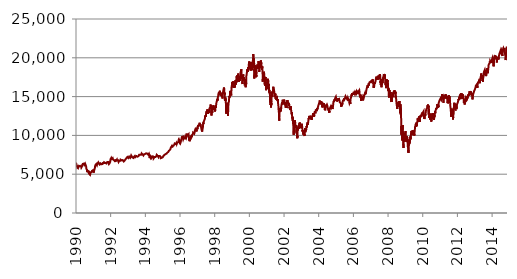
| Category | Series 0 |
|---|---|
| 1990-01-02 | 6481.917 |
| 1990-01-03 | 6478.946 |
| 1990-01-04 | 6435.973 |
| 1990-01-05 | 6386.667 |
| 1990-01-08 | 6402.94 |
| 1990-01-09 | 6342.966 |
| 1990-01-10 | 6295.359 |
| 1990-01-11 | 6310.886 |
| 1990-01-12 | 6166.74 |
| 1990-01-15 | 6113.155 |
| 1990-01-16 | 6160.519 |
| 1990-01-17 | 6118.686 |
| 1990-01-18 | 6121.993 |
| 1990-01-19 | 6139.929 |
| 1990-01-22 | 6001.557 |
| 1990-01-23 | 6007.873 |
| 1990-01-24 | 5960.491 |
| 1990-01-25 | 5909.802 |
| 1990-01-25 | 5889.754 |
| 1990-01-29 | 5867.016 |
| 1990-01-30 | 5816.233 |
| 1990-01-31 | 5910.231 |
| 1990-02-01 | 5888.292 |
| 1990-02-02 | 5931.733 |
| 1990-02-05 | 5954.252 |
| 1990-02-06 | 5926.023 |
| 1990-02-07 | 5984.862 |
| 1990-02-08 | 5982.351 |
| 1990-02-09 | 5995.406 |
| 1990-02-12 | 5939.376 |
| 1990-02-13 | 5947.316 |
| 1990-02-14 | 5958.92 |
| 1990-02-15 | 6007.233 |
| 1990-02-16 | 5979.934 |
| 1990-02-20 | 5903.671 |
| 1990-02-21 | 5889.91 |
| 1990-02-22 | 5870.179 |
| 1990-02-23 | 5836.743 |
| 1990-02-26 | 5890.021 |
| 1990-02-27 | 5919.031 |
| 1990-02-28 | 5953.007 |
| 1990-03-01 | 5938.716 |
| 1990-03-02 | 5988.024 |
| 1990-03-05 | 5964.924 |
| 1990-03-06 | 6026.605 |
| 1990-03-07 | 6016.617 |
| 1990-03-08 | 6068.422 |
| 1990-03-09 | 6038.201 |
| 1990-03-12 | 6048.207 |
| 1990-03-13 | 6010.255 |
| 1990-03-14 | 6023.83 |
| 1990-03-15 | 6042.621 |
| 1990-03-16 | 6096.59 |
| 1990-03-19 | 6118.173 |
| 1990-03-20 | 6089.414 |
| 1990-03-21 | 6062.559 |
| 1990-03-22 | 5995.625 |
| 1990-03-23 | 6017.302 |
| 1990-03-26 | 6025.236 |
| 1990-03-27 | 6077.558 |
| 1990-03-28 | 6079.648 |
| 1990-03-29 | 6062.319 |
| 1990-03-30 | 6054.273 |
| 1990-04-02 | 6017.161 |
| 1990-04-03 | 6094.683 |
| 1990-04-04 | 6057.4 |
| 1990-04-05 | 6049.33 |
| 1990-04-06 | 6034.871 |
| 1990-04-09 | 6048.48 |
| 1990-04-10 | 6057.547 |
| 1990-04-11 | 6057.621 |
| 1990-04-12 | 6096.677 |
| 1990-04-16 | 6102.07 |
| 1990-04-17 | 6100.795 |
| 1990-04-18 | 6039.746 |
| 1990-04-19 | 5995.907 |
| 1990-04-20 | 5943.425 |
| 1990-04-23 | 5870.76 |
| 1990-04-24 | 5858.222 |
| 1990-04-25 | 5883.705 |
| 1990-04-26 | 5895.136 |
| 1990-04-27 | 5837.816 |
| 1990-04-30 | 5858.129 |
| 1990-05-01 | 5868.68 |
| 1990-05-02 | 5904.514 |
| 1990-05-03 | 5923.637 |
| 1990-05-04 | 5966.693 |
| 1990-05-07 | 6000.463 |
| 1990-05-08 | 6021.079 |
| 1990-05-09 | 6034.049 |
| 1990-05-10 | 6052.233 |
| 1990-05-11 | 6179.171 |
| 1990-05-14 | 6222.318 |
| 1990-05-15 | 6215.483 |
| 1990-05-16 | 6214.857 |
| 1990-05-17 | 6226.353 |
| 1990-05-18 | 6233.943 |
| 1990-05-21 | 6292.106 |
| 1990-05-22 | 6305.076 |
| 1990-05-23 | 6316.978 |
| 1990-05-24 | 6310.124 |
| 1990-05-25 | 6258.078 |
| 1990-05-29 | 6341.315 |
| 1990-05-30 | 6347.174 |
| 1990-05-31 | 6353.291 |
| 1990-06-01 | 6354.768 |
| 1990-06-04 | 6419.801 |
| 1990-06-05 | 6410.583 |
| 1990-06-06 | 6391.27 |
| 1990-06-07 | 6365.176 |
| 1990-06-08 | 6298.641 |
| 1990-06-11 | 6339.211 |
| 1990-06-12 | 6407.139 |
| 1990-06-13 | 6393.689 |
| 1990-06-14 | 6363.142 |
| 1990-06-15 | 6359.111 |
| 1990-06-18 | 6265.071 |
| 1990-06-19 | 6283.285 |
| 1990-06-20 | 6290.285 |
| 1990-06-21 | 6307.528 |
| 1990-06-22 | 6240.095 |
| 1990-06-25 | 6189.686 |
| 1990-06-26 | 6181.989 |
| 1990-06-27 | 6220.397 |
| 1990-06-28 | 6262.158 |
| 1990-06-29 | 6274.875 |
| 1990-07-02 | 6271.295 |
| 1990-07-03 | 6281.664 |
| 1990-07-05 | 6215.53 |
| 1990-07-06 | 6254.703 |
| 1990-07-09 | 6269.324 |
| 1990-07-10 | 6231.046 |
| 1990-07-11 | 6303.66 |
| 1990-07-12 | 6367.348 |
| 1990-07-13 | 6399.182 |
| 1990-07-16 | 6422.31 |
| 1990-07-17 | 6397.32 |
| 1990-07-18 | 6344.494 |
| 1990-07-19 | 6351.138 |
| 1990-07-20 | 6297.234 |
| 1990-07-23 | 6185.21 |
| 1990-07-24 | 6186.689 |
| 1990-07-25 | 6207.461 |
| 1990-07-26 | 6191.453 |
| 1990-07-27 | 6155.055 |
| 1990-07-30 | 6170.205 |
| 1990-07-31 | 6177.781 |
| 1990-08-01 | 6109.583 |
| 1990-08-02 | 6043.509 |
| 1990-08-03 | 5923.155 |
| 1990-08-06 | 5750.474 |
| 1990-08-07 | 5755.177 |
| 1990-08-08 | 5805.243 |
| 1990-08-09 | 5838.578 |
| 1990-08-10 | 5776.683 |
| 1990-08-13 | 5814.45 |
| 1990-08-14 | 5830.837 |
| 1990-08-15 | 5842.865 |
| 1990-08-16 | 5725.261 |
| 1990-08-17 | 5638.025 |
| 1990-08-20 | 5634.498 |
| 1990-08-21 | 5521.27 |
| 1990-08-22 | 5438.538 |
| 1990-08-23 | 5266.544 |
| 1990-08-24 | 5332.672 |
| 1990-08-27 | 5499.891 |
| 1990-08-28 | 5506.8 |
| 1990-08-29 | 5541.637 |
| 1990-08-30 | 5472.126 |
| 1990-08-31 | 5523.187 |
| 1990-09-04 | 5481.099 |
| 1990-09-05 | 5504.794 |
| 1990-09-06 | 5449.493 |
| 1990-09-07 | 5489.637 |
| 1990-09-10 | 5470.713 |
| 1990-09-11 | 5458.175 |
| 1990-09-12 | 5479.664 |
| 1990-09-13 | 5420.093 |
| 1990-09-14 | 5389.51 |
| 1990-09-17 | 5400.739 |
| 1990-09-18 | 5403.304 |
| 1990-09-19 | 5378.245 |
| 1990-09-20 | 5294.028 |
| 1990-09-21 | 5285.329 |
| 1990-09-24 | 5173.488 |
| 1990-09-25 | 5220.502 |
| 1990-09-26 | 5168.555 |
| 1990-09-27 | 5094.904 |
| 1990-09-28 | 5164.824 |
| 1990-10-01 | 5268.33 |
| 1990-10-02 | 5284.288 |
| 1990-10-03 | 5230.263 |
| 1990-10-04 | 5236.967 |
| 1990-10-05 | 5213.753 |
| 1990-10-08 | 5237.966 |
| 1990-10-09 | 5111.943 |
| 1990-10-10 | 5034.703 |
| 1990-10-11 | 4943.039 |
| 1990-10-12 | 5004.392 |
| 1990-10-15 | 5044.242 |
| 1990-10-16 | 4980.161 |
| 1990-10-17 | 4977.023 |
| 1990-10-18 | 5082.88 |
| 1990-10-19 | 5179.448 |
| 1990-10-22 | 5211.221 |
| 1990-10-23 | 5191.625 |
| 1990-10-24 | 5194.657 |
| 1990-10-25 | 5163.704 |
| 1990-10-26 | 5079.617 |
| 1990-10-29 | 5031.761 |
| 1990-10-30 | 5050.287 |
| 1990-10-31 | 5053.015 |
| 1990-11-01 | 5082.478 |
| 1990-11-02 | 5157.961 |
| 1990-11-05 | 5205.496 |
| 1990-11-06 | 5171.944 |
| 1990-11-07 | 5090.91 |
| 1990-11-08 | 5106.619 |
| 1990-11-09 | 5198.576 |
| 1990-11-12 | 5292.205 |
| 1990-11-13 | 5280.41 |
| 1990-11-14 | 5325.953 |
| 1990-11-15 | 5279.698 |
| 1990-11-16 | 5279.77 |
| 1990-11-19 | 5305.601 |
| 1990-11-20 | 5250.202 |
| 1990-11-21 | 5257.23 |
| 1990-11-23 | 5247.996 |
| 1990-11-26 | 5258.546 |
| 1990-11-27 | 5291.582 |
| 1990-11-28 | 5297.168 |
| 1990-11-29 | 5280.73 |
| 1990-11-30 | 5363.739 |
| 1990-12-03 | 5395.458 |
| 1990-12-04 | 5432.301 |
| 1990-12-05 | 5499.281 |
| 1990-12-06 | 5493.268 |
| 1990-12-07 | 5474.784 |
| 1990-12-10 | 5487.718 |
| 1990-12-11 | 5450.412 |
| 1990-12-12 | 5506.184 |
| 1990-12-13 | 5500.864 |
| 1990-12-14 | 5460.214 |
| 1990-12-17 | 5439.987 |
| 1990-12-18 | 5496.862 |
| 1990-12-19 | 5508.158 |
| 1990-12-20 | 5506.806 |
| 1990-12-21 | 5526.162 |
| 1990-12-24 | 5502.661 |
| 1990-12-26 | 5519.224 |
| 1990-12-27 | 5485.743 |
| 1990-12-28 | 5491.204 |
| 1990-12-31 | 5517.338 |
| 1991-01-02 | 5428.345 |
| 1991-01-03 | 5363.178 |
| 1991-01-04 | 5349.19 |
| 1991-01-07 | 5259.283 |
| 1991-01-08 | 5243.579 |
| 1991-01-09 | 5196.68 |
| 1991-01-10 | 5241.085 |
| 1991-01-11 | 5251.431 |
| 1991-01-14 | 5197.617 |
| 1991-01-15 | 5213.091 |
| 1991-01-16 | 5261.086 |
| 1991-01-17 | 5441.608 |
| 1991-01-18 | 5495.51 |
| 1991-01-21 | 5483.025 |
| 1991-01-22 | 5456.357 |
| 1991-01-23 | 5487.976 |
| 1991-01-24 | 5565.168 |
| 1991-01-25 | 5591.659 |
| 1991-01-28 | 5597.265 |
| 1991-01-29 | 5601.174 |
| 1991-01-30 | 5686.394 |
| 1991-01-31 | 5739.182 |
| 1991-02-01 | 5735.805 |
| 1991-02-04 | 5824.414 |
| 1991-02-05 | 5878.359 |
| 1991-02-06 | 5987.804 |
| 1991-02-07 | 5967.55 |
| 1991-02-08 | 6006.292 |
| 1991-02-11 | 6143.937 |
| 1991-02-12 | 6106.661 |
| 1991-02-13 | 6161.507 |
| 1991-02-14 | 6097.108 |
| 1991-02-15 | 6163.061 |
| 1991-02-19 | 6169.594 |
| 1991-02-20 | 6109.345 |
| 1991-02-21 | 6109.645 |
| 1991-02-22 | 6120.858 |
| 1991-02-25 | 6145.932 |
| 1991-02-26 | 6079.096 |
| 1991-02-27 | 6151.583 |
| 1991-02-28 | 6153.578 |
| 1991-03-01 | 6195.753 |
| 1991-03-04 | 6195.541 |
| 1991-03-05 | 6316.285 |
| 1991-03-06 | 6313.27 |
| 1991-03-07 | 6310.784 |
| 1991-03-08 | 6301.227 |
| 1991-03-11 | 6263.319 |
| 1991-03-12 | 6209.629 |
| 1991-03-13 | 6272.593 |
| 1991-03-14 | 6266.475 |
| 1991-03-15 | 6256.125 |
| 1991-03-18 | 6232.762 |
| 1991-03-19 | 6160.683 |
| 1991-03-20 | 6181.118 |
| 1991-03-21 | 6165.884 |
| 1991-03-22 | 6175.494 |
| 1991-03-25 | 6214.496 |
| 1991-03-26 | 6314.962 |
| 1991-03-27 | 6314.804 |
| 1991-03-28 | 6318.7 |
| 1991-04-01 | 6253.912 |
| 1991-04-02 | 6376.326 |
| 1991-04-03 | 6383.72 |
| 1991-04-04 | 6399.02 |
| 1991-04-05 | 6346.061 |
| 1991-04-08 | 6386.995 |
| 1991-04-09 | 6314.582 |
| 1991-04-10 | 6304.424 |
| 1991-04-11 | 6377.822 |
| 1991-04-12 | 6421.027 |
| 1991-04-15 | 6430.182 |
| 1991-04-16 | 6520.394 |
| 1991-04-17 | 6569.585 |
| 1991-04-18 | 6541.979 |
| 1991-04-19 | 6478.158 |
| 1991-04-22 | 6417.541 |
| 1991-04-23 | 6426.291 |
| 1991-04-24 | 6440.71 |
| 1991-04-25 | 6395.041 |
| 1991-04-26 | 6385.252 |
| 1991-04-29 | 6303.578 |
| 1991-04-30 | 6316.836 |
| 1991-05-01 | 6370.015 |
| 1991-05-02 | 6383.338 |
| 1991-05-03 | 6389.324 |
| 1991-05-06 | 6376.826 |
| 1991-05-07 | 6338.997 |
| 1991-05-08 | 6353.76 |
| 1991-05-09 | 6424.011 |
| 1991-05-10 | 6322.391 |
| 1991-05-13 | 6333.398 |
| 1991-05-14 | 6254.423 |
| 1991-05-15 | 6196.46 |
| 1991-05-16 | 6247.506 |
| 1991-05-17 | 6250.473 |
| 1991-05-20 | 6242.644 |
| 1991-05-21 | 6289.39 |
| 1991-05-22 | 6305.627 |
| 1991-05-23 | 6296.411 |
| 1991-05-24 | 6335.539 |
| 1991-05-28 | 6402.191 |
| 1991-05-29 | 6420.026 |
| 1991-05-30 | 6483.185 |
| 1991-05-31 | 6528.825 |
| 1991-06-03 | 6492.05 |
| 1991-06-04 | 6490.125 |
| 1991-06-05 | 6456.661 |
| 1991-06-06 | 6435.116 |
| 1991-06-07 | 6372.405 |
| 1991-06-10 | 6357.475 |
| 1991-06-11 | 6386.564 |
| 1991-06-12 | 6317.903 |
| 1991-06-13 | 6328.754 |
| 1991-06-14 | 6395.053 |
| 1991-06-17 | 6370.217 |
| 1991-06-18 | 6348.287 |
| 1991-06-19 | 6289.094 |
| 1991-06-20 | 6289.952 |
| 1991-06-21 | 6315.487 |
| 1991-06-24 | 6209.406 |
| 1991-06-25 | 6193.847 |
| 1991-06-26 | 6201.548 |
| 1991-06-27 | 6243.623 |
| 1991-06-28 | 6205.381 |
| 1991-07-01 | 6289.261 |
| 1991-07-02 | 6284.508 |
| 1991-07-03 | 6227.237 |
| 1991-07-05 | 6238.195 |
| 1991-07-08 | 6291.673 |
| 1991-07-09 | 6275.105 |
| 1991-07-10 | 6280.75 |
| 1991-07-11 | 6300.936 |
| 1991-07-12 | 6353.802 |
| 1991-07-15 | 6391.115 |
| 1991-07-16 | 6381.258 |
| 1991-07-17 | 6379.598 |
| 1991-07-18 | 6437.777 |
| 1991-07-19 | 6425.841 |
| 1991-07-22 | 6402.282 |
| 1991-07-23 | 6346.724 |
| 1991-07-24 | 6326.609 |
| 1991-07-25 | 6359.692 |
| 1991-07-26 | 6362.68 |
| 1991-07-29 | 6395.204 |
| 1991-07-30 | 6451.392 |
| 1991-07-31 | 6476.628 |
| 1991-08-01 | 6452.627 |
| 1991-08-02 | 6457.436 |
| 1991-08-05 | 6425.722 |
| 1991-08-06 | 6498.508 |
| 1991-08-07 | 6503.509 |
| 1991-08-08 | 6493.28 |
| 1991-08-09 | 6464.964 |
| 1991-08-12 | 6478.503 |
| 1991-08-13 | 6507.168 |
| 1991-08-14 | 6520.133 |
| 1991-08-15 | 6512.971 |
| 1991-08-16 | 6462.611 |
| 1991-08-19 | 6310.383 |
| 1991-08-20 | 6354.051 |
| 1991-08-21 | 6526.249 |
| 1991-08-22 | 6539.945 |
| 1991-08-23 | 6582.899 |
| 1991-08-26 | 6579.867 |
| 1991-08-27 | 6570.109 |
| 1991-08-28 | 6627.491 |
| 1991-08-29 | 6626.079 |
| 1991-08-30 | 6613.01 |
| 1991-09-03 | 6536.727 |
| 1991-09-04 | 6499.391 |
| 1991-09-05 | 6484.939 |
| 1991-09-06 | 6485.165 |
| 1991-09-09 | 6473.992 |
| 1991-09-10 | 6402.895 |
| 1991-09-11 | 6410.095 |
| 1991-09-12 | 6454.787 |
| 1991-09-13 | 6402.843 |
| 1991-09-16 | 6425.761 |
| 1991-09-17 | 6422.361 |
| 1991-09-18 | 6446.702 |
| 1991-09-19 | 6466.185 |
| 1991-09-20 | 6482.372 |
| 1991-09-23 | 6455.81 |
| 1991-09-24 | 6482.701 |
| 1991-09-25 | 6477.531 |
| 1991-09-26 | 6471.702 |
| 1991-09-27 | 6464.034 |
| 1991-09-30 | 6495.505 |
| 1991-10-01 | 6506.337 |
| 1991-10-02 | 6491.767 |
| 1991-10-03 | 6430.908 |
| 1991-10-04 | 6389.348 |
| 1991-10-07 | 6354.215 |
| 1991-10-08 | 6370.205 |
| 1991-10-09 | 6315.583 |
| 1991-10-10 | 6359.308 |
| 1991-10-11 | 6379.127 |
| 1991-10-14 | 6454.694 |
| 1991-10-15 | 6530.538 |
| 1991-10-16 | 6578.11 |
| 1991-10-17 | 6567.802 |
| 1991-10-18 | 6578.889 |
| 1991-10-21 | 6540.222 |
| 1991-10-22 | 6511.846 |
| 1991-10-23 | 6508.138 |
| 1991-10-24 | 6459.614 |
| 1991-10-25 | 6439.934 |
| 1991-10-28 | 6515.501 |
| 1991-10-29 | 6552.557 |
| 1991-10-30 | 6588.365 |
| 1991-10-31 | 6595.364 |
| 1991-11-01 | 6562.712 |
| 1991-11-04 | 6538.908 |
| 1991-11-05 | 6518.266 |
| 1991-11-06 | 6535.955 |
| 1991-11-07 | 6592.336 |
| 1991-11-08 | 6592.077 |
| 1991-11-11 | 6604.099 |
| 1991-11-12 | 6660.791 |
| 1991-11-13 | 6671.881 |
| 1991-11-14 | 6664.574 |
| 1991-11-15 | 6435.543 |
| 1991-11-18 | 6465.478 |
| 1991-11-19 | 6364.894 |
| 1991-11-20 | 6354.633 |
| 1991-11-21 | 6380.578 |
| 1991-11-22 | 6320.708 |
| 1991-11-25 | 6297.233 |
| 1991-11-26 | 6327.427 |
| 1991-11-27 | 6314.8 |
| 1991-11-29 | 6304.868 |
| 1991-12-02 | 6385.1 |
| 1991-12-03 | 6387.033 |
| 1991-12-04 | 6381.854 |
| 1991-12-05 | 6348.368 |
| 1991-12-06 | 6371.394 |
| 1991-12-09 | 6355.583 |
| 1991-12-10 | 6344.847 |
| 1991-12-11 | 6334.611 |
| 1991-12-12 | 6390.019 |
| 1991-12-13 | 6438.057 |
| 1991-12-16 | 6446.825 |
| 1991-12-17 | 6418.966 |
| 1991-12-18 | 6421.106 |
| 1991-12-19 | 6400.462 |
| 1991-12-20 | 6456.198 |
| 1991-12-23 | 6602.331 |
| 1991-12-24 | 6654.563 |
| 1991-12-26 | 6748.584 |
| 1991-12-27 | 6791.15 |
| 1991-12-30 | 6930.12 |
| 1991-12-31 | 6975.396 |
| 1992-01-02 | 6958.451 |
| 1992-01-03 | 6999.542 |
| 1992-01-06 | 6990.838 |
| 1992-01-07 | 6996.836 |
| 1992-01-08 | 7023.604 |
| 1992-01-09 | 7041.098 |
| 1992-01-10 | 7001.817 |
| 1992-01-13 | 6993.889 |
| 1992-01-14 | 7088.722 |
| 1992-01-15 | 7103.493 |
| 1992-01-16 | 7066.677 |
| 1992-01-17 | 7080.397 |
| 1992-01-20 | 7033.98 |
| 1992-01-21 | 6948.471 |
| 1992-01-22 | 7041.667 |
| 1992-01-23 | 7016.968 |
| 1992-01-24 | 7027.758 |
| 1992-01-27 | 7016.399 |
| 1992-01-28 | 7016.726 |
| 1992-01-29 | 6946.541 |
| 1992-01-30 | 6970.913 |
| 1992-01-31 | 6942.318 |
| 1992-02-03 | 6929.398 |
| 1992-02-04 | 6999.228 |
| 1992-02-05 | 7008.914 |
| 1992-02-06 | 7017.398 |
| 1992-02-07 | 6977.434 |
| 1992-02-10 | 7008.296 |
| 1992-02-11 | 7006.166 |
| 1992-02-12 | 7067.425 |
| 1992-02-13 | 7011.559 |
| 1992-02-14 | 6994.093 |
| 1992-02-18 | 6914.921 |
| 1992-02-19 | 6912.654 |
| 1992-02-20 | 7001.46 |
| 1992-02-21 | 6967.988 |
| 1992-02-24 | 6963.557 |
| 1992-02-25 | 6931.648 |
| 1992-02-26 | 7015.079 |
| 1992-02-27 | 7004.534 |
| 1992-02-28 | 6991.946 |
| 1992-03-02 | 6958.092 |
| 1992-03-03 | 6963.663 |
| 1992-03-04 | 6910.007 |
| 1992-03-05 | 6853.345 |
| 1992-03-06 | 6813.599 |
| 1992-03-09 | 6821.152 |
| 1992-03-10 | 6854.08 |
| 1992-03-11 | 6808.661 |
| 1992-03-12 | 6797.229 |
| 1992-03-13 | 6827.594 |
| 1992-03-16 | 6829.354 |
| 1992-03-17 | 6878.19 |
| 1992-03-18 | 6877.695 |
| 1992-03-19 | 6888.152 |
| 1992-03-20 | 6907.308 |
| 1992-03-23 | 6885.35 |
| 1992-03-24 | 6864.999 |
| 1992-03-25 | 6853.738 |
| 1992-03-26 | 6849.791 |
| 1992-03-27 | 6773.443 |
| 1992-03-30 | 6761.328 |
| 1992-03-31 | 6769.359 |
| 1992-04-01 | 6761.548 |
| 1992-04-02 | 6699.916 |
| 1992-04-03 | 6699.438 |
| 1992-04-06 | 6757.214 |
| 1992-04-07 | 6636.134 |
| 1992-04-08 | 6567.779 |
| 1992-04-09 | 6667.12 |
| 1992-04-10 | 6725.306 |
| 1992-04-13 | 6752.197 |
| 1992-04-14 | 6843.314 |
| 1992-04-15 | 6900.749 |
| 1992-04-16 | 6882.15 |
| 1992-04-20 | 6777.604 |
| 1992-04-21 | 6773.475 |
| 1992-04-22 | 6766.872 |
| 1992-04-23 | 6785.436 |
| 1992-04-24 | 6752.607 |
| 1992-04-27 | 6738.24 |
| 1992-04-28 | 6729.657 |
| 1992-04-29 | 6781.273 |
| 1992-04-30 | 6840.124 |
| 1992-05-01 | 6803.154 |
| 1992-05-04 | 6868.907 |
| 1992-05-05 | 6878.397 |
| 1992-05-06 | 6885.519 |
| 1992-05-07 | 6871.514 |
| 1992-05-08 | 6871.275 |
| 1992-05-11 | 6904.381 |
| 1992-05-12 | 6871.786 |
| 1992-05-13 | 6869.588 |
| 1992-05-14 | 6815.763 |
| 1992-05-15 | 6775.296 |
| 1992-05-18 | 6812.185 |
| 1992-05-19 | 6859.518 |
| 1992-05-20 | 6854.117 |
| 1992-05-21 | 6817.007 |
| 1992-05-22 | 6835.221 |
| 1992-05-26 | 6792.42 |
| 1992-05-27 | 6801.28 |
| 1992-05-28 | 6854.185 |
| 1992-05-29 | 6852.141 |
| 1992-06-01 | 6861.778 |
| 1992-06-02 | 6817.772 |
| 1992-06-03 | 6832.508 |
| 1992-06-04 | 6810.199 |
| 1992-06-05 | 6804.8 |
| 1992-06-08 | 6794.223 |
| 1992-06-09 | 6736.124 |
| 1992-06-10 | 6688.111 |
| 1992-06-11 | 6701.388 |
| 1992-06-12 | 6714.8 |
| 1992-06-15 | 6717.924 |
| 1992-06-16 | 6685.904 |
| 1992-06-17 | 6583.815 |
| 1992-06-18 | 6554.426 |
| 1992-06-19 | 6595.937 |
| 1992-06-22 | 6578.841 |
| 1992-06-23 | 6596.481 |
| 1992-06-24 | 6590.623 |
| 1992-06-25 | 6576.107 |
| 1992-06-26 | 6579.995 |
| 1992-06-29 | 6666.583 |
| 1992-06-30 | 6672.899 |
| 1992-07-01 | 6730.009 |
| 1992-07-02 | 6716.862 |
| 1992-07-06 | 6741.682 |
| 1992-07-07 | 6673.203 |
| 1992-07-08 | 6679.76 |
| 1992-07-09 | 6744.274 |
| 1992-07-10 | 6758.606 |
| 1992-07-13 | 6766.891 |
| 1992-07-14 | 6815.7 |
| 1992-07-15 | 6806.585 |
| 1992-07-16 | 6815.598 |
| 1992-07-17 | 6779.851 |
| 1992-07-20 | 6743.393 |
| 1992-07-21 | 6750.39 |
| 1992-07-22 | 6710.39 |
| 1992-07-23 | 6725.485 |
| 1992-07-24 | 6721.843 |
| 1992-07-27 | 6722.148 |
| 1992-07-28 | 6812.142 |
| 1992-07-29 | 6881.942 |
| 1992-07-30 | 6909.1 |
| 1992-07-31 | 6918.739 |
| 1992-08-03 | 6916.988 |
| 1992-08-04 | 6908.389 |
| 1992-08-05 | 6872.22 |
| 1992-08-06 | 6847.522 |
| 1992-08-07 | 6827.79 |
| 1992-08-10 | 6828.347 |
| 1992-08-11 | 6817.468 |
| 1992-08-12 | 6800.203 |
| 1992-08-13 | 6799.493 |
| 1992-08-14 | 6828.753 |
| 1992-08-17 | 6842.842 |
| 1992-08-18 | 6848.586 |
| 1992-08-19 | 6804.798 |
| 1992-08-20 | 6803.683 |
| 1992-08-21 | 6751.448 |
| 1992-08-24 | 6680.9 |
| 1992-08-25 | 6677.352 |
| 1992-08-26 | 6711.376 |
| 1992-08-27 | 6723.81 |
| 1992-08-28 | 6743.66 |
| 1992-08-31 | 6732.105 |
| 1992-09-01 | 6741.82 |
| 1992-09-02 | 6774.467 |
| 1992-09-03 | 6784.625 |
| 1992-09-04 | 6773.675 |
| 1992-09-08 | 6733.178 |
| 1992-09-09 | 6755.802 |
| 1992-09-10 | 6809.455 |
| 1992-09-11 | 6816.985 |
| 1992-09-14 | 6906.656 |
| 1992-09-15 | 6831.86 |
| 1992-09-16 | 6832.551 |
| 1992-09-17 | 6829.418 |
| 1992-09-18 | 6868.972 |
| 1992-09-21 | 6854.316 |
| 1992-09-22 | 6786.697 |
| 1992-09-23 | 6783.749 |
| 1992-09-24 | 6802.363 |
| 1992-09-25 | 6733.902 |
| 1992-09-28 | 6754.319 |
| 1992-09-29 | 6760.299 |
| 1992-09-30 | 6779.352 |
| 1992-10-01 | 6732.265 |
| 1992-10-02 | 6646.437 |
| 1992-10-05 | 6590.051 |
| 1992-10-06 | 6593.727 |
| 1992-10-07 | 6563.713 |
| 1992-10-08 | 6615.13 |
| 1992-10-09 | 6545.534 |
| 1992-10-12 | 6605.864 |
| 1992-10-13 | 6636.046 |
| 1992-10-14 | 6638.362 |
| 1992-10-15 | 6645.883 |
| 1992-10-16 | 6673.362 |
| 1992-10-19 | 6731.745 |
| 1992-10-20 | 6748.196 |
| 1992-10-21 | 6756.052 |
| 1992-10-22 | 6747.457 |
| 1992-10-23 | 6741.901 |
| 1992-10-26 | 6792.696 |
| 1992-10-27 | 6797.413 |
| 1992-10-28 | 6826.689 |
| 1992-10-29 | 6850.139 |
| 1992-10-30 | 6828.334 |
| 1992-11-02 | 6871.402 |
| 1992-11-03 | 6837.457 |
| 1992-11-04 | 6802.188 |
| 1992-11-05 | 6831.087 |
| 1992-11-06 | 6829.193 |
| 1992-11-09 | 6852.242 |
| 1992-11-10 | 6862.015 |
| 1992-11-11 | 6924.121 |
| 1992-11-12 | 6929.451 |
| 1992-11-13 | 6928.68 |
| 1992-11-16 | 6900.67 |
| 1992-11-17 | 6874.671 |
| 1992-11-18 | 6930.289 |
| 1992-11-19 | 6944.739 |
| 1992-11-20 | 6990.233 |
| 1992-11-23 | 6970.067 |
| 1992-11-24 | 7013.131 |
| 1992-11-25 | 7038.711 |
| 1992-11-27 | 7056.261 |
| 1992-11-30 | 7079.595 |
| 1992-12-01 | 7080.189 |
| 1992-12-02 | 7066.552 |
| 1992-12-03 | 7073.362 |
| 1992-12-04 | 7106.878 |
| 1992-12-07 | 7156.53 |
| 1992-12-08 | 7176.609 |
| 1992-12-09 | 7151.582 |
| 1992-12-10 | 7135.445 |
| 1992-12-11 | 7120.264 |
| 1992-12-14 | 7107.7 |
| 1992-12-15 | 7100.05 |
| 1992-12-16 | 7077.64 |
| 1992-12-17 | 7133.298 |
| 1992-12-18 | 7215.61 |
| 1992-12-21 | 7205.042 |
| 1992-12-22 | 7203.835 |
| 1992-12-23 | 7189.207 |
| 1992-12-24 | 7204.12 |
| 1992-12-28 | 7199.037 |
| 1992-12-29 | 7194.156 |
| 1992-12-30 | 7213.815 |
| 1992-12-31 | 7195.85 |
| 1993-01-04 | 7149.009 |
| 1993-01-05 | 7130.447 |
| 1993-01-06 | 7136.189 |
| 1993-01-07 | 7084.227 |
| 1993-01-08 | 7055.282 |
| 1993-01-11 | 7087.181 |
| 1993-01-12 | 7084.31 |
| 1993-01-13 | 7121.467 |
| 1993-01-14 | 7174.231 |
| 1993-01-15 | 7200.304 |
| 1993-01-18 | 7198.935 |
| 1993-01-19 | 7183.095 |
| 1993-01-20 | 7165.785 |
| 1993-01-21 | 7193.778 |
| 1993-01-22 | 7211.405 |
| 1993-01-25 | 7273.049 |
| 1993-01-25 | 7275.019 |
| 1993-01-27 | 7229.132 |
| 1993-01-28 | 7232.303 |
| 1993-01-29 | 7239.281 |
| 1993-02-01 | 7269.51 |
| 1993-02-02 | 7283.449 |
| 1993-02-03 | 7351.781 |
| 1993-02-04 | 7391.653 |
| 1993-02-05 | 7370.212 |
| 1993-02-08 | 7350.966 |
| 1993-02-09 | 7303.56 |
| 1993-02-10 | 7316.151 |
| 1993-02-11 | 7338.491 |
| 1993-02-12 | 7294.843 |
| 1993-02-16 | 7108.244 |
| 1993-02-17 | 7068.706 |
| 1993-02-18 | 7056.696 |
| 1993-02-19 | 7087.818 |
| 1993-02-22 | 7074.993 |
| 1993-02-23 | 7070.552 |
| 1993-02-24 | 7165.864 |
| 1993-02-25 | 7200.729 |
| 1993-02-26 | 7223.883 |
| 1993-03-01 | 7189.299 |
| 1993-03-02 | 7271.433 |
| 1993-03-03 | 7304.701 |
| 1993-03-04 | 7278.627 |
| 1993-03-05 | 7264.438 |
| 1993-03-08 | 7377.071 |
| 1993-03-09 | 7381.447 |
| 1993-03-10 | 7418.163 |
| 1993-03-11 | 7393.614 |
| 1993-03-12 | 7339.494 |
| 1993-03-15 | 7364.126 |
| 1993-03-16 | 7360.081 |
| 1993-03-17 | 7311.629 |
| 1993-03-18 | 7354.478 |
| 1993-03-19 | 7326.382 |
| 1993-03-22 | 7291.158 |
| 1993-03-23 | 7287.876 |
| 1993-03-24 | 7277.516 |
| 1993-03-25 | 7320.481 |
| 1993-03-26 | 7291.092 |
| 1993-03-29 | 7328.603 |
| 1993-03-30 | 7351.843 |
| 1993-03-31 | 7366.861 |
| 1993-04-01 | 7323.156 |
| 1993-04-02 | 7179.924 |
| 1993-04-05 | 7186.503 |
| 1993-04-06 | 7150.765 |
| 1993-04-07 | 7174.568 |
| 1993-04-08 | 7157.625 |
| 1993-04-12 | 7244.556 |
| 1993-04-13 | 7271.847 |
| 1993-04-14 | 7270.624 |
| 1993-04-15 | 7256.606 |
| 1993-04-16 | 7262.739 |
| 1993-04-19 | 7236.638 |
| 1993-04-20 | 7199.347 |
| 1993-04-21 | 7183.627 |
| 1993-04-22 | 7134.996 |
| 1993-04-23 | 7094.564 |
| 1993-04-26 | 7024.328 |
| 1993-04-27 | 7083.968 |
| 1993-04-28 | 7088.332 |
| 1993-04-29 | 7105.11 |
| 1993-04-30 | 7134.516 |
| 1993-05-03 | 7158.46 |
| 1993-05-04 | 7197.202 |
| 1993-05-05 | 7222.673 |
| 1993-05-06 | 7208.031 |
| 1993-05-07 | 7192.448 |
| 1993-05-10 | 7202.815 |
| 1993-05-11 | 7223.812 |
| 1993-05-12 | 7228.863 |
| 1993-05-13 | 7149.481 |
| 1993-05-14 | 7148.243 |
| 1993-05-17 | 7155.555 |
| 1993-05-18 | 7155.885 |
| 1993-05-19 | 7254.531 |
| 1993-05-20 | 7310.655 |
| 1993-05-21 | 7253.524 |
| 1993-05-24 | 7273.019 |
| 1993-05-25 | 7289.361 |
| 1993-05-26 | 7359.631 |
| 1993-05-27 | 7353.309 |
| 1993-05-28 | 7326.716 |
| 1993-06-01 | 7361.587 |
| 1993-06-02 | 7370.224 |
| 1993-06-03 | 7353.839 |
| 1993-06-04 | 7313.717 |
| 1993-06-07 | 7267.166 |
| 1993-06-08 | 7210.707 |
| 1993-06-09 | 7226.45 |
| 1993-06-10 | 7218.043 |
| 1993-06-11 | 7242.176 |
| 1993-06-14 | 7254.687 |
| 1993-06-15 | 7243.593 |
| 1993-06-16 | 7258.347 |
| 1993-06-17 | 7269.951 |
| 1993-06-18 | 7204.328 |
| 1993-06-21 | 7234.56 |
| 1993-06-22 | 7226.318 |
| 1993-06-23 | 7194.124 |
| 1993-06-24 | 7241.516 |
| 1993-06-25 | 7266.078 |
| 1993-06-28 | 7338.163 |
| 1993-06-29 | 7324.382 |
| 1993-06-30 | 7334.734 |
| 1993-07-01 | 7328.767 |
| 1993-07-02 | 7288.364 |
| 1993-07-06 | 7233.34 |
| 1993-07-07 | 7240.643 |
| 1993-07-08 | 7313.799 |
| 1993-07-09 | 7317.047 |
| 1993-07-12 | 7336.069 |
| 1993-07-13 | 7328.552 |
| 1993-07-14 | 7360.795 |
| 1993-07-15 | 7346.586 |
| 1993-07-16 | 7296.919 |
| 1993-07-19 | 7286.633 |
| 1993-07-20 | 7305.326 |
| 1993-07-21 | 7299.458 |
| 1993-07-22 | 7258.281 |
| 1993-07-23 | 7294.612 |
| 1993-07-26 | 7330.58 |
| 1993-07-27 | 7317.558 |
| 1993-07-28 | 7308.096 |
| 1993-07-29 | 7348.993 |
| 1993-07-30 | 7324.366 |
| 1993-08-02 | 7334.412 |
| 1993-08-03 | 7326.522 |
| 1993-08-04 | 7324.993 |
| 1993-08-05 | 7318.187 |
| 1993-08-06 | 7333.278 |
| 1993-08-09 | 7360.435 |
| 1993-08-10 | 7346.856 |
| 1993-08-11 | 7360.287 |
| 1993-08-12 | 7336.599 |
| 1993-08-13 | 7352.199 |
| 1993-08-16 | 7384.994 |
| 1993-08-17 | 7412.627 |
| 1993-08-18 | 7458.573 |
| 1993-08-19 | 7457.011 |
| 1993-08-20 | 7457.85 |
| 1993-08-23 | 7447.954 |
| 1993-08-24 | 7507.051 |
| 1993-08-25 | 7512.821 |
| 1993-08-26 | 7521.254 |
| 1993-08-27 | 7511.982 |
| 1993-08-30 | 7534.257 |
| 1993-08-31 | 7564.306 |
| 1993-09-01 | 7557.558 |
| 1993-09-02 | 7539.759 |
| 1993-09-03 | 7544.073 |
| 1993-09-07 | 7486.083 |
| 1993-09-08 | 7437.148 |
| 1993-09-09 | 7463.642 |
| 1993-09-10 | 7528.341 |
| 1993-09-13 | 7525.914 |
| 1993-09-14 | 7490.873 |
| 1993-09-15 | 7516.661 |
| 1993-09-16 | 7498.419 |
| 1993-09-17 | 7490.234 |
| 1993-09-20 | 7444.055 |
| 1993-09-21 | 7406.783 |
| 1993-09-22 | 7464.068 |
| 1993-09-23 | 7497.845 |
| 1993-09-24 | 7507.524 |
| 1993-09-27 | 7563.349 |
| 1993-09-28 | 7569.222 |
| 1993-09-29 | 7556.032 |
| 1993-09-30 | 7549.143 |
| 1993-10-01 | 7547.51 |
| 1993-10-04 | 7549.52 |
| 1993-10-05 | 7544.651 |
| 1993-10-06 | 7544.08 |
| 1993-10-07 | 7520.146 |
| 1993-10-08 | 7531.092 |
| 1993-10-11 | 7545.958 |
| 1993-10-12 | 7560.678 |
| 1993-10-13 | 7574.842 |
| 1993-10-14 | 7644.716 |
| 1993-10-15 | 7681.164 |
| 1993-10-18 | 7661.037 |
| 1993-10-19 | 7598.335 |
| 1993-10-20 | 7590.216 |
| 1993-10-21 | 7584.808 |
| 1993-10-22 | 7565.465 |
| 1993-10-25 | 7565.955 |
| 1993-10-26 | 7558.914 |
| 1993-10-27 | 7569.549 |
| 1993-10-28 | 7613.953 |
| 1993-10-29 | 7633.934 |
| 1993-11-01 | 7648.86 |
| 1993-11-02 | 7640.371 |
| 1993-11-03 | 7548.815 |
| 1993-11-04 | 7447.007 |
| 1993-11-05 | 7469.521 |
| 1993-11-08 | 7492.116 |
| 1993-11-09 | 7504.605 |
| 1993-11-10 | 7555.868 |
| 1993-11-11 | 7548.211 |
| 1993-11-12 | 7587.589 |
| 1993-11-15 | 7550.595 |
| 1993-11-16 | 7579.508 |
| 1993-11-17 | 7541.191 |
| 1993-11-18 | 7511.968 |
| 1993-11-19 | 7489.732 |
| 1993-11-22 | 7410.339 |
| 1993-11-23 | 7445.358 |
| 1993-11-24 | 7480.083 |
| 1993-11-26 | 7496.442 |
| 1993-11-29 | 7479.887 |
| 1993-11-30 | 7483.479 |
| 1993-12-01 | 7507.103 |
| 1993-12-02 | 7523.984 |
| 1993-12-03 | 7551.264 |
| 1993-12-06 | 7571.835 |
| 1993-12-07 | 7578.463 |
| 1993-12-08 | 7573.108 |
| 1993-12-09 | 7536.326 |
| 1993-12-10 | 7533.306 |
| 1993-12-13 | 7546.791 |
| 1993-12-14 | 7499.136 |
| 1993-12-15 | 7484.083 |
| 1993-12-16 | 7507.527 |
| 1993-12-17 | 7549.354 |
| 1993-12-20 | 7547.787 |
| 1993-12-21 | 7526.726 |
| 1993-12-22 | 7554.088 |
| 1993-12-23 | 7564.064 |
| 1993-12-27 | 7604.323 |
| 1993-12-28 | 7617.972 |
| 1993-12-29 | 7630.755 |
| 1993-12-30 | 7611.115 |
| 1993-12-31 | 7604.307 |
| 1994-01-03 | 7556.475 |
| 1994-01-04 | 7574.384 |
| 1994-01-05 | 7587.751 |
| 1994-01-06 | 7580.164 |
| 1994-01-07 | 7615.169 |
| 1994-01-10 | 7680.147 |
| 1994-01-11 | 7668.473 |
| 1994-01-12 | 7676.923 |
| 1994-01-13 | 7661.814 |
| 1994-01-14 | 7698.544 |
| 1994-01-17 | 7684.184 |
| 1994-01-18 | 7693.025 |
| 1994-01-19 | 7688.808 |
| 1994-01-20 | 7697.389 |
| 1994-01-21 | 7699.212 |
| 1994-01-24 | 7659.307 |
| 1994-01-25 | 7638.255 |
| 1994-01-25 | 7671.013 |
| 1994-01-27 | 7729.446 |
| 1994-01-28 | 7762.725 |
| 1994-01-31 | 7811.829 |
| 1994-02-01 | 7761.823 |
| 1994-02-02 | 7795.329 |
| 1994-02-03 | 7779.363 |
| 1994-02-04 | 7601.967 |
| 1994-02-07 | 7621.665 |
| 1994-02-08 | 7628.382 |
| 1994-02-09 | 7657.005 |
| 1994-02-10 | 7609.853 |
| 1994-02-11 | 7613.195 |
| 1994-02-14 | 7616.651 |
| 1994-02-15 | 7654.311 |
| 1994-02-16 | 7664.712 |
| 1994-02-17 | 7630.768 |
| 1994-02-18 | 7588.776 |
| 1994-02-22 | 7634.824 |
| 1994-02-23 | 7624.326 |
| 1994-02-24 | 7530.087 |
| 1994-02-25 | 7560.218 |
| 1994-02-28 | 7591.015 |
| 1994-03-01 | 7524.189 |
| 1994-03-02 | 7508.504 |
| 1994-03-03 | 7492.592 |
| 1994-03-04 | 7527.132 |
| 1994-03-07 | 7567.187 |
| 1994-03-08 | 7549.48 |
| 1994-03-09 | 7558.034 |
| 1994-03-10 | 7518.254 |
| 1994-03-11 | 7548.59 |
| 1994-03-14 | 7572.927 |
| 1994-03-15 | 7578.102 |
| 1994-03-16 | 7621.148 |
| 1994-03-17 | 7649.624 |
| 1994-03-18 | 7654.605 |
| 1994-03-21 | 7608.308 |
| 1994-03-22 | 7617.364 |
| 1994-03-23 | 7622.377 |
| 1994-03-24 | 7549.318 |
| 1994-03-25 | 7504.008 |
| 1994-03-28 | 7462.628 |
| 1994-03-29 | 7334.363 |
| 1994-03-30 | 7218.84 |
| 1994-03-31 | 7208.345 |
| 1994-04-04 | 7078.112 |
| 1994-04-05 | 7250.822 |
| 1994-04-06 | 7257.329 |
| 1994-04-07 | 7300.479 |
| 1994-04-08 | 7242.666 |
| 1994-04-11 | 7268.084 |
| 1994-04-12 | 7224.289 |
| 1994-04-13 | 7186.824 |
| 1994-04-14 | 7186.437 |
| 1994-04-15 | 7190.345 |
| 1994-04-18 | 7131.273 |
| 1994-04-19 | 7112.185 |
| 1994-04-20 | 7085.718 |
| 1994-04-21 | 7192.816 |
| 1994-04-22 | 7192.234 |
| 1994-04-25 | 7265.42 |
| 1994-04-26 | 7265.791 |
| 1994-04-28 | 7230.28 |
| 1994-04-29 | 7258.363 |
| 1994-05-02 | 7291.011 |
| 1994-05-03 | 7289.865 |
| 1994-05-04 | 7280.763 |
| 1994-05-05 | 7276.438 |
| 1994-05-06 | 7214.276 |
| 1994-05-09 | 7118.418 |
| 1994-05-10 | 7158.665 |
| 1994-05-11 | 7088.176 |
| 1994-05-12 | 7113.964 |
| 1994-05-13 | 7112.608 |
| 1994-05-16 | 7107.783 |
| 1994-05-17 | 7159.182 |
| 1994-05-18 | 7240.145 |
| 1994-05-19 | 7286.024 |
| 1994-05-20 | 7273.065 |
| 1994-05-23 | 7250.005 |
| 1994-05-24 | 7272.307 |
| 1994-05-25 | 7291.253 |
| 1994-05-26 | 7306.955 |
| 1994-05-27 | 7314.394 |
| 1994-05-31 | 7303.146 |
| 1994-06-01 | 7291.742 |
| 1994-06-02 | 7308.549 |
| 1994-06-03 | 7343.948 |
| 1994-06-06 | 7341.761 |
| 1994-06-07 | 7324.696 |
| 1994-06-08 | 7294.91 |
| 1994-06-09 | 7292.82 |
| 1994-06-10 | 7313.84 |
| 1994-06-13 | 7312.618 |
| 1994-06-14 | 7355.013 |
| 1994-06-15 | 7337.595 |
| 1994-06-16 | 7358.407 |
| 1994-06-17 | 7306.667 |
| 1994-06-20 | 7244.007 |
| 1994-06-21 | 7167.901 |
| 1994-06-22 | 7200.1 |
| 1994-06-23 | 7139.209 |
| 1994-06-24 | 7034.106 |
| 1994-06-27 | 7092.423 |
| 1994-06-28 | 7077.434 |
| 1994-06-29 | 7102.475 |
| 1994-06-30 | 7068.91 |
| 1994-07-01 | 7079 |
| 1994-07-05 | 7077.043 |
| 1994-07-06 | 7071.365 |
| 1994-07-07 | 7106.541 |
| 1994-07-08 | 7121.971 |
| 1994-07-11 | 7107.294 |
| 1994-07-12 | 7106.797 |
| 1994-07-13 | 7133.728 |
| 1994-07-14 | 7209.645 |
| 1994-07-15 | 7216.927 |
| 1994-07-18 | 7228.235 |
| 1994-07-19 | 7208.65 |
| 1994-07-20 | 7168.246 |
| 1994-07-21 | 7181.014 |
| 1994-07-22 | 7188.681 |
| 1994-07-25 | 7198.593 |
| 1994-07-26 | 7184.863 |
| 1994-07-27 | 7170.684 |
| 1994-07-28 | 7186.355 |
| 1994-07-29 | 7249.68 |
| 1994-08-01 | 7261.255 |
| 1994-08-02 | 7264.099 |
| 1994-08-03 | 7277.934 |
| 1994-08-04 | 7241.015 |
| 1994-08-05 | 7219.273 |
| 1994-08-08 | 7234.018 |
| 1994-08-09 | 7233.155 |
| 1994-08-10 | 7267.837 |
| 1994-08-11 | 7248.076 |
| 1994-08-12 | 7289.564 |
| 1994-08-15 | 7287.119 |
| 1994-08-16 | 7334.246 |
| 1994-08-17 | 7347.65 |
| 1994-08-18 | 7322.121 |
| 1994-08-19 | 7328.799 |
| 1994-08-22 | 7317.424 |
| 1994-08-23 | 7352.442 |
| 1994-08-24 | 7413.436 |
| 1994-08-25 | 7403.275 |
| 1994-08-26 | 7479.445 |
| 1994-08-29 | 7493.248 |
| 1994-08-30 | 7518.792 |
| 1994-08-31 | 7517.882 |
| 1994-09-01 | 7461.3 |
| 1994-09-02 | 7434.756 |
| 1994-09-06 | 7439.186 |
| 1994-09-07 | 7436.143 |
| 1994-09-08 | 7469.903 |
| 1994-09-09 | 7406.843 |
| 1994-09-12 | 7376.252 |
| 1994-09-13 | 7393.475 |
| 1994-09-14 | 7414.108 |
| 1994-09-15 | 7500.223 |
| 1994-09-16 | 7459.133 |
| 1994-09-19 | 7457.237 |
| 1994-09-20 | 7350.49 |
| 1994-09-21 | 7308.587 |
| 1994-09-22 | 7303.202 |
| 1994-09-23 | 7279.511 |
| 1994-09-26 | 7289.484 |
| 1994-09-27 | 7300.892 |
| 1994-09-28 | 7345.598 |
| 1994-09-29 | 7317.828 |
| 1994-09-30 | 7338.206 |
| 1994-10-03 | 7314.621 |
| 1994-10-04 | 7208.502 |
| 1994-10-05 | 7177.423 |
| 1994-10-06 | 7167.503 |
| 1994-10-07 | 7206.958 |
| 1994-10-10 | 7260.662 |
| 1994-10-11 | 7352.754 |
| 1994-10-12 | 7357.291 |
| 1994-10-13 | 7383.419 |
| 1994-10-14 | 7395.249 |
| 1994-10-17 | 7393.577 |
| 1994-10-18 | 7373.165 |
| 1994-10-19 | 7411.967 |
| 1994-10-20 | 7367.784 |
| 1994-10-21 | 7340.574 |
| 1994-10-24 | 7280.723 |
| 1994-10-25 | 7276.074 |
| 1994-10-26 | 7296.008 |
| 1994-10-27 | 7343.646 |
| 1994-10-28 | 7450.418 |
| 1994-10-31 | 7442.139 |
| 1994-11-01 | 7378.722 |
| 1994-11-02 | 7357.002 |
| 1994-11-03 | 7373.396 |
| 1994-11-04 | 7307.902 |
| 1994-11-07 | 7301.239 |
| 1994-11-08 | 7333.629 |
| 1994-11-09 | 7330.433 |
| 1994-11-10 | 7310.605 |
| 1994-11-11 | 7283.526 |
| 1994-11-14 | 7331.848 |
| 1994-11-15 | 7325.806 |
| 1994-11-16 | 7330.512 |
| 1994-11-17 | 7293.909 |
| 1994-11-18 | 7263.73 |
| 1994-11-21 | 7209.843 |
| 1994-11-22 | 7081.064 |
| 1994-11-23 | 7067.279 |
| 1994-11-25 | 7111.18 |
| 1994-11-28 | 7133.027 |
| 1994-11-29 | 7154.207 |
| 1994-11-30 | 7140.262 |
| 1994-12-01 | 7067.947 |
| 1994-12-02 | 7118.574 |
| 1994-12-05 | 7119.019 |
| 1994-12-06 | 7108.986 |
| 1994-12-07 | 7075.69 |
| 1994-12-08 | 6976.375 |
| 1994-12-09 | 6982.91 |
| 1994-12-12 | 7010.434 |
| 1994-12-13 | 7023.155 |
| 1994-12-14 | 7097.633 |
| 1994-12-15 | 7124.87 |
| 1994-12-16 | 7161.887 |
| 1994-12-19 | 7147.799 |
| 1994-12-20 | 7142.393 |
| 1994-12-21 | 7184.784 |
| 1994-12-22 | 7186.994 |
| 1994-12-23 | 7198.649 |
| 1994-12-27 | 7230.784 |
| 1994-12-28 | 7211.528 |
| 1994-12-29 | 7221.355 |
| 1994-12-30 | 7219.828 |
| 1995-01-03 | 7172.683 |
| 1995-01-04 | 7190.548 |
| 1995-01-05 | 7191.054 |
| 1995-01-06 | 7201.079 |
| 1995-01-09 | 7208.079 |
| 1995-01-10 | 7220.305 |
| 1995-01-11 | 7222.76 |
| 1995-01-12 | 7222.839 |
| 1995-01-13 | 7284.208 |
| 1995-01-16 | 7338.687 |
| 1995-01-17 | 7361.699 |
| 1995-01-18 | 7356.045 |
| 1995-01-19 | 7310.672 |
| 1995-01-20 | 7278.697 |
| 1995-01-23 | 7275.497 |
| 1995-01-24 | 7288.911 |
| 1995-01-25 | 7303.149 |
| 1995-01-25 | 7310.466 |
| 1995-01-27 | 7331.988 |
| 1995-01-30 | 7302.151 |
| 1995-01-31 | 7334.776 |
| 1995-02-01 | 7310.312 |
| 1995-02-02 | 7349.527 |
| 1995-02-03 | 7437.83 |
| 1995-02-06 | 7478.464 |
| 1995-02-07 | 7478.527 |
| 1995-02-08 | 7486.398 |
| 1995-02-09 | 7480.373 |
| 1995-02-10 | 7503.419 |
| 1995-02-13 | 7498.907 |
| 1995-02-14 | 7509.996 |
| 1995-02-15 | 7541.813 |
| 1995-02-16 | 7543.911 |
| 1995-02-17 | 7499.948 |
| 1995-02-21 | 7501.668 |
| 1995-02-22 | 7530.029 |
| 1995-02-23 | 7564.275 |
| 1995-02-24 | 7578.614 |
| 1995-02-27 | 7516.006 |
| 1995-02-28 | 7577.715 |
| 1995-03-01 | 7529.735 |
| 1995-03-02 | 7523.729 |
| 1995-03-03 | 7527.487 |
| 1995-03-06 | 7522.078 |
| 1995-03-07 | 7467.209 |
| 1995-03-08 | 7481.185 |
| 1995-03-09 | 7484.487 |
| 1995-03-10 | 7570.125 |
| 1995-03-13 | 7577.53 |
| 1995-03-14 | 7617.322 |
| 1995-03-15 | 7608.769 |
| 1995-03-16 | 7651.8 |
| 1995-03-17 | 7647.273 |
| 1995-03-20 | 7654.961 |
| 1995-03-21 | 7642.304 |
| 1995-03-22 | 7641.801 |
| 1995-03-23 | 7648.829 |
| 1995-03-24 | 7721.48 |
| 1995-03-27 | 7755.88 |
| 1995-03-28 | 7767.357 |
| 1995-03-29 | 7757.688 |
| 1995-03-30 | 7755.849 |
| 1995-03-31 | 7735.882 |
| 1995-04-03 | 7721.042 |
| 1995-04-04 | 7754.968 |
| 1995-04-05 | 7763.383 |
| 1995-04-06 | 7765.797 |
| 1995-04-07 | 7768.978 |
| 1995-04-10 | 7782.909 |
| 1995-04-11 | 7775.857 |
| 1995-04-12 | 7798.422 |
| 1995-04-13 | 7830.703 |
| 1995-04-17 | 7793.69 |
| 1995-04-18 | 7770.686 |
| 1995-04-19 | 7744.767 |
| 1995-04-20 | 7757.679 |
| 1995-04-21 | 7804.58 |
| 1995-04-24 | 7857.013 |
| 1995-04-25 | 7848.253 |
| 1995-04-26 | 7859.05 |
| 1995-04-27 | 7875.394 |
| 1995-04-28 | 7891.362 |
| 1995-05-01 | 7868.004 |
| 1995-05-02 | 7873.399 |
| 1995-05-03 | 7944.934 |
| 1995-05-04 | 7941.415 |
| 1995-05-05 | 7935.269 |
| 1995-05-08 | 7984.298 |
| 1995-05-09 | 7985.549 |
| 1995-05-10 | 8003.957 |
| 1995-05-11 | 8013.074 |
| 1995-05-12 | 8038.723 |
| 1995-05-15 | 8072.097 |
| 1995-05-16 | 8087.956 |
| 1995-05-17 | 8073.286 |
| 1995-05-18 | 7970.473 |
| 1995-05-19 | 7961.715 |
| 1995-05-22 | 8021.16 |
| 1995-05-23 | 8089.222 |
| 1995-05-24 | 8092.475 |
| 1995-05-25 | 8086.611 |
| 1995-05-26 | 8021.989 |
| 1995-05-30 | 8007.663 |
| 1995-05-31 | 8121.205 |
| 1995-06-01 | 8120.213 |
| 1995-06-02 | 8120.993 |
| 1995-06-05 | 8171.362 |
| 1995-06-06 | 8170.863 |
| 1995-06-07 | 8144.266 |
| 1995-06-08 | 8139.895 |
| 1995-06-09 | 8080.349 |
| 1995-06-12 | 8122.82 |
| 1995-06-13 | 8194.323 |
| 1995-06-14 | 8203.937 |
| 1995-06-15 | 8223.682 |
| 1995-06-16 | 8261.268 |
| 1995-06-19 | 8332.771 |
| 1995-06-20 | 8336.813 |
| 1995-06-21 | 8332.365 |
| 1995-06-22 | 8429.981 |
| 1995-06-23 | 8412.484 |
| 1995-06-26 | 8328.806 |
| 1995-06-27 | 8301.663 |
| 1995-06-28 | 8324.155 |
| 1995-06-29 | 8324.233 |
| 1995-06-30 | 8348.676 |
| 1995-07-03 | 8377.177 |
| 1995-07-05 | 8391.943 |
| 1995-07-06 | 8484.798 |
| 1995-07-07 | 8540.599 |
| 1995-07-10 | 8554.054 |
| 1995-07-11 | 8524.007 |
| 1995-07-12 | 8618.408 |
| 1995-07-13 | 8624.62 |
| 1995-07-14 | 8613.117 |
| 1995-07-17 | 8651.092 |
| 1995-07-18 | 8585.286 |
| 1995-07-19 | 8445.153 |
| 1995-07-20 | 8489.216 |
| 1995-07-21 | 8504.777 |
| 1995-07-24 | 8558.814 |
| 1995-07-25 | 8630.817 |
| 1995-07-26 | 8646.488 |
| 1995-07-27 | 8709.375 |
| 1995-07-28 | 8685.025 |
| 1995-07-31 | 8681.279 |
| 1995-08-01 | 8618.886 |
| 1995-08-02 | 8603.458 |
| 1995-08-03 | 8594.538 |
| 1995-08-04 | 8603.832 |
| 1995-08-07 | 8625.409 |
| 1995-08-08 | 8629.706 |
| 1995-08-09 | 8629.908 |
| 1995-08-10 | 8605.591 |
| 1995-08-11 | 8578.986 |
| 1995-08-14 | 8638.252 |
| 1995-08-15 | 8630.671 |
| 1995-08-16 | 8668.983 |
| 1995-08-17 | 8671.988 |
| 1995-08-18 | 8680.534 |
| 1995-08-21 | 8665.216 |
| 1995-08-22 | 8678.495 |
| 1995-08-23 | 8657.883 |
| 1995-08-24 | 8654.318 |
| 1995-08-25 | 8687.229 |
| 1995-08-28 | 8666.897 |
| 1995-08-29 | 8663.815 |
| 1995-08-30 | 8694.312 |
| 1995-08-31 | 8721.493 |
| 1995-09-01 | 8735.536 |
| 1995-09-05 | 8816.034 |
| 1995-09-06 | 8847.513 |
| 1995-09-07 | 8856.214 |
| 1995-09-08 | 8897.869 |
| 1995-09-11 | 8925.355 |
| 1995-09-12 | 8957.128 |
| 1995-09-13 | 8978.119 |
| 1995-09-14 | 9038.699 |
| 1995-09-15 | 9019.697 |
| 1995-09-18 | 9011.571 |
| 1995-09-19 | 9041.34 |
| 1995-09-20 | 9078.847 |
| 1995-09-21 | 9035.156 |
| 1995-09-22 | 9000.804 |
| 1995-09-25 | 8985.686 |
| 1995-09-26 | 8972.697 |
| 1995-09-27 | 8945.506 |
| 1995-09-28 | 9023.566 |
| 1995-09-29 | 9021.919 |
| 1995-10-02 | 8939.016 |
| 1995-10-03 | 8926.333 |
| 1995-10-04 | 8888.22 |
| 1995-10-05 | 8910.459 |
| 1995-10-06 | 8916.112 |
| 1995-10-09 | 8822.185 |
| 1995-10-10 | 8796.043 |
| 1995-10-11 | 8853.623 |
| 1995-10-12 | 8919.472 |
| 1995-10-13 | 8959.227 |
| 1995-10-16 | 8940.705 |
| 1995-10-17 | 8993.096 |
| 1995-10-18 | 9013.724 |
| 1995-10-19 | 9043.722 |
| 1995-10-20 | 8995.419 |
| 1995-10-23 | 8952.769 |
| 1995-10-24 | 8972.205 |
| 1995-10-25 | 8902.236 |
| 1995-10-26 | 8809.95 |
| 1995-10-27 | 8851.47 |
| 1995-10-30 | 8908.028 |
| 1995-10-31 | 8890.729 |
| 1995-11-01 | 8929.649 |
| 1995-11-02 | 9023.994 |
| 1995-11-03 | 9053.066 |
| 1995-11-06 | 9034.888 |
| 1995-11-07 | 8988.305 |
| 1995-11-08 | 9055.096 |
| 1995-11-09 | 9090.584 |
| 1995-11-10 | 9086.833 |
| 1995-11-13 | 9072.7 |
| 1995-11-14 | 9016.602 |
| 1995-11-15 | 9061.605 |
| 1995-11-16 | 9113.891 |
| 1995-11-17 | 9155.112 |
| 1995-11-20 | 9101.431 |
| 1995-11-21 | 9123.266 |
| 1995-11-22 | 9103.384 |
| 1995-11-24 | 9131.666 |
| 1995-11-27 | 9149.719 |
| 1995-11-28 | 9222.88 |
| 1995-11-29 | 9257.686 |
| 1995-11-30 | 9251.58 |
| 1995-12-01 | 9274.06 |
| 1995-12-04 | 9371.707 |
| 1995-12-05 | 9417.499 |
| 1995-12-06 | 9433.006 |
| 1995-12-07 | 9373.49 |
| 1995-12-08 | 9392.765 |
| 1995-12-11 | 9418.243 |
| 1995-12-12 | 9394.719 |
| 1995-12-13 | 9435.192 |
| 1995-12-14 | 9357.735 |
| 1995-12-15 | 9337.033 |
| 1995-12-18 | 9173.839 |
| 1995-12-19 | 9259.173 |
| 1995-12-20 | 9215.831 |
| 1995-12-21 | 9286.233 |
| 1995-12-22 | 9308.78 |
| 1995-12-26 | 9346.539 |
| 1995-12-27 | 9351.843 |
| 1995-12-28 | 9349.501 |
| 1995-12-29 | 9392.843 |
| 1996-01-02 | 9398.077 |
| 1996-01-03 | 9397.738 |
| 1996-01-04 | 9317.757 |
| 1996-01-05 | 9306.041 |
| 1996-01-08 | 9325.682 |
| 1996-01-09 | 9183.603 |
| 1996-01-10 | 9018.97 |
| 1996-01-11 | 9101.633 |
| 1996-01-12 | 9091.905 |
| 1996-01-15 | 9048.6 |
| 1996-01-16 | 9135.519 |
| 1996-01-17 | 9129.383 |
| 1996-01-18 | 9163.592 |
| 1996-01-19 | 9222.745 |
| 1996-01-22 | 9255.768 |
| 1996-01-23 | 9253.486 |
| 1996-01-24 | 9355.035 |
| 1996-01-25 | 9317.218 |
| 1996-01-25 | 9381.15 |
| 1996-01-29 | 9413.263 |
| 1996-01-30 | 9499.102 |
| 1996-01-31 | 9576.462 |
| 1996-02-01 | 9589.253 |
| 1996-02-02 | 9566.295 |
| 1996-02-05 | 9629.284 |
| 1996-02-06 | 9697.097 |
| 1996-02-07 | 9731.903 |
| 1996-02-08 | 9811.287 |
| 1996-02-09 | 9820.323 |
| 1996-02-12 | 9874.491 |
| 1996-02-13 | 9853.592 |
| 1996-02-14 | 9812.133 |
| 1996-02-15 | 9779.217 |
| 1996-02-16 | 9747.562 |
| 1996-02-20 | 9643.698 |
| 1996-02-21 | 9746.332 |
| 1996-02-22 | 9910.541 |
| 1996-02-23 | 9901.198 |
| 1996-02-26 | 9806.877 |
| 1996-02-27 | 9764.434 |
| 1996-02-28 | 9745.748 |
| 1996-02-29 | 9692.195 |
| 1996-03-01 | 9674.592 |
| 1996-03-04 | 9748.661 |
| 1996-03-05 | 9816.142 |
| 1996-03-06 | 9786.575 |
| 1996-03-07 | 9803.208 |
| 1996-03-08 | 9518.534 |
| 1996-03-11 | 9616.361 |
| 1996-03-12 | 9567.379 |
| 1996-03-13 | 9598.581 |
| 1996-03-14 | 9641.494 |
| 1996-03-15 | 9655.054 |
| 1996-03-18 | 9806.113 |
| 1996-03-19 | 9794.479 |
| 1996-03-20 | 9767.74 |
| 1996-03-21 | 9758.675 |
| 1996-03-22 | 9776.684 |
| 1996-03-25 | 9755.48 |
| 1996-03-26 | 9781.591 |
| 1996-03-27 | 9744.671 |
| 1996-03-28 | 9752.514 |
| 1996-03-29 | 9732.043 |
| 1996-04-01 | 9796.917 |
| 1996-04-02 | 9821.36 |
| 1996-04-03 | 9831.137 |
| 1996-04-04 | 9840.457 |
| 1996-04-08 | 9674.993 |
| 1996-04-09 | 9666.937 |
| 1996-04-10 | 9560.44 |
| 1996-04-11 | 9503.178 |
| 1996-04-12 | 9574.862 |
| 1996-04-15 | 9657.129 |
| 1996-04-16 | 9705.543 |
| 1996-04-17 | 9663.922 |
| 1996-04-18 | 9705.116 |
| 1996-04-19 | 9735.361 |
| 1996-04-22 | 9785.922 |
| 1996-04-23 | 9849.793 |
| 1996-04-24 | 9847.904 |
| 1996-04-25 | 9890.79 |
| 1996-04-26 | 9910.694 |
| 1996-04-29 | 9920.791 |
| 1996-04-30 | 9921.446 |
| 1996-05-01 | 9924.646 |
| 1996-05-02 | 9772.419 |
| 1996-05-03 | 9760.259 |
| 1996-05-06 | 9747.141 |
| 1996-05-07 | 9707.47 |
| 1996-05-08 | 9766.81 |
| 1996-05-09 | 9785.673 |
| 1996-05-10 | 9889.96 |
| 1996-05-13 | 10023.263 |
| 1996-05-14 | 10093.806 |
| 1996-05-15 | 10094.946 |
| 1996-05-16 | 10095.448 |
| 1996-05-17 | 10155.473 |
| 1996-05-20 | 10213.035 |
| 1996-05-21 | 10203.474 |
| 1996-05-22 | 10270.794 |
| 1996-05-23 | 10241.443 |
| 1996-05-24 | 10273.166 |
| 1996-05-28 | 10178.972 |
| 1996-05-29 | 10116.865 |
| 1996-05-30 | 10166.31 |
| 1996-05-31 | 10149.529 |
| 1996-06-03 | 10122.424 |
| 1996-06-04 | 10182.41 |
| 1996-06-05 | 10254.731 |
| 1996-06-06 | 10184.385 |
| 1996-06-07 | 10168.542 |
| 1996-06-10 | 10156.222 |
| 1996-06-11 | 10142.627 |
| 1996-06-12 | 10133.877 |
| 1996-06-13 | 10107.249 |
| 1996-06-14 | 10069.532 |
| 1996-06-17 | 10050.498 |
| 1996-06-18 | 9978.238 |
| 1996-06-19 | 9958.126 |
| 1996-06-20 | 9932.349 |
| 1996-06-21 | 9987.884 |
| 1996-06-24 | 10021.029 |
| 1996-06-25 | 10005.976 |
| 1996-06-26 | 9919.315 |
| 1996-06-27 | 9974.319 |
| 1996-06-28 | 10044.954 |
| 1996-07-01 | 10107.691 |
| 1996-07-02 | 10082.053 |
| 1996-07-03 | 10050.533 |
| 1996-07-05 | 9852.042 |
| 1996-07-08 | 9762.879 |
| 1996-07-09 | 9794.779 |
| 1996-07-10 | 9777.101 |
| 1996-07-11 | 9604.202 |
| 1996-07-12 | 9595.788 |
| 1996-07-15 | 9340.261 |
| 1996-07-16 | 9288.47 |
| 1996-07-17 | 9425.649 |
| 1996-07-18 | 9575.305 |
| 1996-07-19 | 9506.215 |
| 1996-07-22 | 9414.202 |
| 1996-07-23 | 9295.672 |
| 1996-07-24 | 9247.338 |
| 1996-07-25 | 9345.385 |
| 1996-07-26 | 9430.697 |
| 1996-07-29 | 9361.547 |
| 1996-07-30 | 9405.59 |
| 1996-07-31 | 9471.253 |
| 1996-08-01 | 9596.417 |
| 1996-08-02 | 9778.837 |
| 1996-08-05 | 9749.208 |
| 1996-08-06 | 9783.74 |
| 1996-08-07 | 9821.207 |
| 1996-08-08 | 9805.894 |
| 1996-08-09 | 9796.572 |
| 1996-08-12 | 9820.027 |
| 1996-08-13 | 9758.469 |
| 1996-08-14 | 9790.489 |
| 1996-08-15 | 9809.359 |
| 1996-08-16 | 9840.743 |
| 1996-08-19 | 9854.937 |
| 1996-08-20 | 9842.907 |
| 1996-08-21 | 9830.847 |
| 1996-08-22 | 9914.407 |
| 1996-08-23 | 9880.148 |
| 1996-08-26 | 9844.284 |
| 1996-08-27 | 9889.817 |
| 1996-08-28 | 9887.653 |
| 1996-08-29 | 9797.056 |
| 1996-08-30 | 9736.149 |
| 1996-09-03 | 9721.379 |
| 1996-09-04 | 9736.644 |
| 1996-09-05 | 9645.927 |
| 1996-09-06 | 9729.027 |
| 1996-09-09 | 9828.222 |
| 1996-09-10 | 9838.177 |
| 1996-09-11 | 9877.427 |
| 1996-09-12 | 9935.094 |
| 1996-09-13 | 10062.934 |
| 1996-09-16 | 10110.48 |
| 1996-09-17 | 10109.318 |
| 1996-09-18 | 10087.144 |
| 1996-09-19 | 10109.137 |
| 1996-09-20 | 10161.118 |
| 1996-09-23 | 10142.504 |
| 1996-09-24 | 10141.946 |
| 1996-09-25 | 10159.097 |
| 1996-09-26 | 10180.622 |
| 1996-09-27 | 10188.466 |
| 1996-09-30 | 10205.541 |
| 1996-10-01 | 10184.629 |
| 1996-10-02 | 10255.783 |
| 1996-10-03 | 10242.235 |
| 1996-10-04 | 10353.657 |
| 1996-10-07 | 10371.4 |
| 1996-10-08 | 10328.591 |
| 1996-10-09 | 10274.037 |
| 1996-10-10 | 10249.858 |
| 1996-10-11 | 10324.621 |
| 1996-10-14 | 10370.167 |
| 1996-10-15 | 10362.423 |
| 1996-10-16 | 10369.355 |
| 1996-10-17 | 10398.677 |
| 1996-10-18 | 10441.185 |
| 1996-10-21 | 10416.555 |
| 1996-10-22 | 10345.642 |
| 1996-10-23 | 10346.153 |
| 1996-10-24 | 10291.164 |
| 1996-10-25 | 10276.549 |
| 1996-10-28 | 10213.815 |
| 1996-10-29 | 10244.686 |
| 1996-10-30 | 10237.769 |
| 1996-10-31 | 10302.141 |
| 1996-11-01 | 10268.336 |
| 1996-11-04 | 10297.377 |
| 1996-11-05 | 10386.136 |
| 1996-11-06 | 10526.643 |
| 1996-11-07 | 10574.55 |
| 1996-11-08 | 10610.675 |
| 1996-11-11 | 10629.795 |
| 1996-11-12 | 10607.283 |
| 1996-11-13 | 10630.5 |
| 1996-11-14 | 10687.667 |
| 1996-11-15 | 10698.158 |
| 1996-11-18 | 10683.6 |
| 1996-11-19 | 10736.744 |
| 1996-11-20 | 10768.201 |
| 1996-11-21 | 10740.886 |
| 1996-11-22 | 10821.856 |
| 1996-11-25 | 10925.113 |
| 1996-11-26 | 10915.597 |
| 1996-11-27 | 10910.284 |
| 1996-11-29 | 10944.263 |
| 1996-12-02 | 10949.381 |
| 1996-12-03 | 10881.679 |
| 1996-12-04 | 10835.543 |
| 1996-12-05 | 10834.763 |
| 1996-12-06 | 10758.581 |
| 1996-12-09 | 10901.685 |
| 1996-12-10 | 10881.469 |
| 1996-12-11 | 10772.764 |
| 1996-12-12 | 10643.227 |
| 1996-12-13 | 10614.892 |
| 1996-12-16 | 10503.711 |
| 1996-12-17 | 10548 |
| 1996-12-18 | 10630.711 |
| 1996-12-19 | 10809.684 |
| 1996-12-20 | 10839.926 |
| 1996-12-23 | 10808.288 |
| 1996-12-24 | 10853.958 |
| 1996-12-26 | 10912.386 |
| 1996-12-27 | 10939.31 |
| 1996-12-30 | 10917.308 |
| 1996-12-31 | 10803.381 |
| 1997-01-02 | 10693.891 |
| 1997-01-03 | 10836.739 |
| 1997-01-06 | 10851.94 |
| 1997-01-07 | 10920.327 |
| 1997-01-08 | 10876.176 |
| 1997-01-09 | 10960.407 |
| 1997-01-10 | 11015.449 |
| 1997-01-13 | 11011.44 |
| 1997-01-14 | 11128.241 |
| 1997-01-15 | 11110.811 |
| 1997-01-16 | 11142.499 |
| 1997-01-17 | 11223.558 |
| 1997-01-20 | 11243.112 |
| 1997-01-21 | 11322.002 |
| 1997-01-22 | 11362.726 |
| 1997-01-23 | 11273.932 |
| 1997-01-24 | 11171.763 |
| 1997-01-27 | 11091.137 |
| 1997-01-28 | 11093.546 |
| 1997-01-29 | 11167.065 |
| 1997-01-30 | 11305.784 |
| 1997-01-31 | 11334.21 |
| 1997-02-03 | 11315.063 |
| 1997-02-04 | 11323.833 |
| 1997-02-05 | 11183.221 |
| 1997-02-06 | 11203.385 |
| 1997-02-07 | 11309.336 |
| 1997-02-10 | 11249.426 |
| 1997-02-11 | 11277.002 |
| 1997-02-12 | 11452.11 |
| 1997-02-13 | 11569.544 |
| 1997-02-14 | 11540.417 |
| 1997-02-18 | 11622.013 |
| 1997-02-19 | 11592.99 |
| 1997-02-20 | 11464.936 |
| 1997-02-21 | 11437.658 |
| 1997-02-24 | 11524.817 |
| 1997-02-25 | 11554.884 |
| 1997-02-26 | 11472.408 |
| 1997-02-27 | 11338.672 |
| 1997-02-28 | 11274.288 |
| 1997-03-03 | 11293.857 |
| 1997-03-04 | 11266.915 |
| 1997-03-05 | 11394.083 |
| 1997-03-06 | 11365.504 |
| 1997-03-07 | 11436.08 |
| 1997-03-10 | 11540.1 |
| 1997-03-11 | 11516.46 |
| 1997-03-12 | 11418.481 |
| 1997-03-13 | 11236.744 |
| 1997-03-14 | 11278.102 |
| 1997-03-17 | 11271.765 |
| 1997-03-18 | 11184.333 |
| 1997-03-19 | 11110.945 |
| 1997-03-20 | 11089.046 |
| 1997-03-21 | 11110.201 |
| 1997-03-24 | 11159.845 |
| 1997-03-25 | 11153.716 |
| 1997-03-26 | 11183.574 |
| 1997-03-27 | 10974.479 |
| 1997-03-31 | 10731.523 |
| 1997-04-01 | 10731.335 |
| 1997-04-02 | 10609.868 |
| 1997-04-03 | 10605.321 |
| 1997-04-04 | 10718.765 |
| 1997-04-07 | 10806.474 |
| 1997-04-08 | 10855.15 |
| 1997-04-09 | 10799.951 |
| 1997-04-10 | 10754.677 |
| 1997-04-11 | 10489.961 |
| 1997-04-14 | 10545.769 |
| 1997-04-15 | 10676.478 |
| 1997-04-16 | 10761.899 |
| 1997-04-17 | 10747.887 |
| 1997-04-18 | 10801.244 |
| 1997-04-21 | 10696.418 |
| 1997-04-22 | 10847.037 |
| 1997-04-23 | 10841.985 |
| 1997-04-24 | 10824.17 |
| 1997-04-25 | 10722.554 |
| 1997-04-28 | 10808.316 |
| 1997-04-29 | 11068.679 |
| 1997-04-30 | 11172.435 |
| 1997-05-01 | 11169.17 |
| 1997-05-02 | 11382.223 |
| 1997-05-05 | 11622.484 |
| 1997-05-06 | 11597.15 |
| 1997-05-07 | 11458.464 |
| 1997-05-08 | 11515.601 |
| 1997-05-09 | 11568.678 |
| 1997-05-12 | 11724.447 |
| 1997-05-13 | 11669.942 |
| 1997-05-14 | 11707.616 |
| 1997-05-15 | 11781.479 |
| 1997-05-16 | 11644.949 |
| 1997-05-19 | 11687.56 |
| 1997-05-20 | 11785.924 |
| 1997-05-21 | 11784.497 |
| 1997-05-22 | 11742.897 |
| 1997-05-23 | 11894.592 |
| 1997-05-27 | 11933.664 |
| 1997-05-28 | 11913.518 |
| 1997-05-29 | 11895.558 |
| 1997-05-30 | 11951.357 |
| 1997-06-02 | 11945.295 |
| 1997-06-03 | 11929.14 |
| 1997-06-04 | 11870.352 |
| 1997-06-05 | 11918.716 |
| 1997-06-06 | 12087.401 |
| 1997-06-09 | 12146.916 |
| 1997-06-10 | 12168.492 |
| 1997-06-11 | 12216.559 |
| 1997-06-12 | 12375.563 |
| 1997-06-13 | 12487.985 |
| 1997-06-16 | 12502.716 |
| 1997-06-17 | 12524.366 |
| 1997-06-18 | 12472.008 |
| 1997-06-19 | 12598.21 |
| 1997-06-20 | 12598.73 |
| 1997-06-23 | 12369.282 |
| 1997-06-24 | 12563.612 |
| 1997-06-25 | 12483.932 |
| 1997-06-26 | 12420.333 |
| 1997-06-27 | 12472.884 |
| 1997-06-30 | 12468.592 |
| 1997-07-01 | 12519.14 |
| 1997-07-02 | 12667.565 |
| 1997-07-03 | 12812.653 |
| 1997-07-07 | 12770.415 |
| 1997-07-08 | 12858.776 |
| 1997-07-09 | 12741.555 |
| 1997-07-10 | 12817.013 |
| 1997-07-11 | 12876.958 |
| 1997-07-14 | 12904.246 |
| 1997-07-15 | 12997.027 |
| 1997-07-16 | 13155.58 |
| 1997-07-17 | 13084.838 |
| 1997-07-18 | 12899.323 |
| 1997-07-21 | 12854.074 |
| 1997-07-22 | 13101.449 |
| 1997-07-23 | 13145.273 |
| 1997-07-24 | 13190.996 |
| 1997-07-25 | 13178.019 |
| 1997-07-28 | 13151.665 |
| 1997-07-29 | 13219.396 |
| 1997-07-30 | 13358.448 |
| 1997-07-31 | 13394.145 |
| 1997-08-01 | 13289.442 |
| 1997-08-04 | 13330.121 |
| 1997-08-05 | 13382.642 |
| 1997-08-06 | 13486.084 |
| 1997-08-07 | 13377.549 |
| 1997-08-08 | 13147.719 |
| 1997-08-11 | 13159.946 |
| 1997-08-12 | 13050.109 |
| 1997-08-13 | 13004.027 |
| 1997-08-14 | 13037.363 |
| 1997-08-15 | 12776.936 |
| 1997-08-18 | 12891.244 |
| 1997-08-19 | 13066.185 |
| 1997-08-20 | 13243.494 |
| 1997-08-21 | 13078.634 |
| 1997-08-22 | 13050.02 |
| 1997-08-25 | 13030.554 |
| 1997-08-26 | 12959.13 |
| 1997-08-27 | 12980.95 |
| 1997-08-28 | 12881.178 |
| 1997-08-29 | 12848.907 |
| 1997-09-02 | 13144.45 |
| 1997-09-03 | 13164.133 |
| 1997-09-04 | 13202.348 |
| 1997-09-05 | 13206.763 |
| 1997-09-08 | 13243.516 |
| 1997-09-09 | 13283.784 |
| 1997-09-10 | 13128.635 |
| 1997-09-11 | 13052.294 |
| 1997-09-12 | 13201.137 |
| 1997-09-15 | 13168.962 |
| 1997-09-16 | 13462.13 |
| 1997-09-17 | 13448.811 |
| 1997-09-18 | 13508.54 |
| 1997-09-19 | 13544.569 |
| 1997-09-22 | 13617.869 |
| 1997-09-23 | 13578.443 |
| 1997-09-24 | 13508.436 |
| 1997-09-25 | 13433.483 |
| 1997-09-26 | 13506.916 |
| 1997-09-29 | 13607.621 |
| 1997-09-30 | 13555.673 |
| 1997-10-01 | 13614.327 |
| 1997-10-02 | 13679.153 |
| 1997-10-03 | 13757.603 |
| 1997-10-06 | 13854.465 |
| 1997-10-07 | 13973.554 |
| 1997-10-08 | 13878.886 |
| 1997-10-09 | 13860.843 |
| 1997-10-10 | 13822.884 |
| 1997-10-13 | 13841.238 |
| 1997-10-14 | 13850.606 |
| 1997-10-15 | 13794.986 |
| 1997-10-16 | 13666.014 |
| 1997-10-17 | 13484.633 |
| 1997-10-20 | 13639 |
| 1997-10-21 | 13852.668 |
| 1997-10-22 | 13826.582 |
| 1997-10-23 | 13563.937 |
| 1997-10-24 | 13458.606 |
| 1997-10-27 | 12574.768 |
| 1997-10-28 | 13109.16 |
| 1997-10-29 | 13110.559 |
| 1997-10-30 | 12908.616 |
| 1997-10-31 | 13058.195 |
| 1997-11-03 | 13373.54 |
| 1997-11-04 | 13407.247 |
| 1997-11-05 | 13450.049 |
| 1997-11-06 | 13385.345 |
| 1997-11-07 | 13209.129 |
| 1997-11-10 | 13143.025 |
| 1997-11-11 | 13155.214 |
| 1997-11-12 | 12896.151 |
| 1997-11-13 | 13004.908 |
| 1997-11-14 | 13165.517 |
| 1997-11-17 | 13405.184 |
| 1997-11-18 | 13304.813 |
| 1997-11-19 | 13364.048 |
| 1997-11-20 | 13547.486 |
| 1997-11-21 | 13589.227 |
| 1997-11-24 | 13363.532 |
| 1997-11-25 | 13403.725 |
| 1997-11-26 | 13424.241 |
| 1997-11-28 | 13474.81 |
| 1997-12-01 | 13734.654 |
| 1997-12-02 | 13700.079 |
| 1997-12-03 | 13767.931 |
| 1997-12-04 | 13750.267 |
| 1997-12-05 | 13883.243 |
| 1997-12-08 | 13888.334 |
| 1997-12-09 | 13786.009 |
| 1997-12-10 | 13683.049 |
| 1997-12-11 | 13466.076 |
| 1997-12-12 | 13425.731 |
| 1997-12-15 | 13521.518 |
| 1997-12-16 | 13605.265 |
| 1997-12-17 | 13593.105 |
| 1997-12-18 | 13440.694 |
| 1997-12-19 | 13344.951 |
| 1997-12-22 | 13427.206 |
| 1997-12-23 | 13272.036 |
| 1997-12-24 | 13202.589 |
| 1997-12-26 | 13245.916 |
| 1997-12-29 | 13457.296 |
| 1997-12-30 | 13692.139 |
| 1997-12-31 | 13721.373 |
| 1998-01-02 | 13739.367 |
| 1998-01-05 | 13765.218 |
| 1998-01-06 | 13622.738 |
| 1998-01-07 | 13570.566 |
| 1998-01-08 | 13464.527 |
| 1998-01-09 | 13073.249 |
| 1998-01-12 | 13166.193 |
| 1998-01-13 | 13353.981 |
| 1998-01-14 | 13450.136 |
| 1998-01-15 | 13374.146 |
| 1998-01-16 | 13525.316 |
| 1998-01-20 | 13745.112 |
| 1998-01-21 | 13648.706 |
| 1998-01-22 | 13546.497 |
| 1998-01-23 | 13472.304 |
| 1998-01-25 | 13438.352 |
| 1998-01-27 | 13574.778 |
| 1998-01-28 | 13706.844 |
| 1998-01-29 | 13805.341 |
| 1998-01-30 | 13758.663 |
| 1998-02-02 | 14003.015 |
| 1998-02-03 | 14063.707 |
| 1998-02-04 | 14103.697 |
| 1998-02-05 | 14087.583 |
| 1998-02-06 | 14182.943 |
| 1998-02-09 | 14175.68 |
| 1998-02-10 | 14292.666 |
| 1998-02-11 | 14308.295 |
| 1998-02-12 | 14358.018 |
| 1998-02-13 | 14330.584 |
| 1998-02-17 | 14355.71 |
| 1998-02-18 | 14470.138 |
| 1998-02-19 | 14437.308 |
| 1998-02-20 | 14494.397 |
| 1998-02-23 | 14548.796 |
| 1998-02-24 | 14458.803 |
| 1998-02-25 | 14616.853 |
| 1998-02-26 | 14701.774 |
| 1998-02-27 | 14711.815 |
| 1998-03-02 | 14676.093 |
| 1998-03-03 | 14712.062 |
| 1998-03-04 | 14668.462 |
| 1998-03-05 | 14491.744 |
| 1998-03-06 | 14771.937 |
| 1998-03-09 | 14722.716 |
| 1998-03-10 | 14881.237 |
| 1998-03-11 | 14942.403 |
| 1998-03-12 | 14972.473 |
| 1998-03-13 | 14964.489 |
| 1998-03-16 | 15091.855 |
| 1998-03-17 | 15104.799 |
| 1998-03-18 | 15178.35 |
| 1998-03-19 | 15240.265 |
| 1998-03-20 | 15344.165 |
| 1998-03-23 | 15297.953 |
| 1998-03-24 | 15419.493 |
| 1998-03-25 | 15390.979 |
| 1998-03-26 | 15382.79 |
| 1998-03-27 | 15325.366 |
| 1998-03-30 | 15296.265 |
| 1998-03-31 | 15401.163 |
| 1998-04-01 | 15472.44 |
| 1998-04-02 | 15604.287 |
| 1998-04-03 | 15631.811 |
| 1998-04-06 | 15605.869 |
| 1998-04-07 | 15434.267 |
| 1998-04-08 | 15361.012 |
| 1998-04-09 | 15484.803 |
| 1998-04-13 | 15479.383 |
| 1998-04-14 | 15587.339 |
| 1998-04-15 | 15649.637 |
| 1998-04-16 | 15513 |
| 1998-04-17 | 15684.617 |
| 1998-04-20 | 15714.689 |
| 1998-04-21 | 15756.392 |
| 1998-04-22 | 15794.639 |
| 1998-04-23 | 15635.165 |
| 1998-04-24 | 15475.618 |
| 1998-04-27 | 15154.225 |
| 1998-04-28 | 15181.91 |
| 1998-04-29 | 15315.574 |
| 1998-04-30 | 15541.022 |
| 1998-05-01 | 15618.942 |
| 1998-05-04 | 15633.929 |
| 1998-05-05 | 15548.439 |
| 1998-05-06 | 15422.874 |
| 1998-05-07 | 15292.819 |
| 1998-05-08 | 15458.739 |
| 1998-05-11 | 15423.195 |
| 1998-05-12 | 15502.295 |
| 1998-05-13 | 15531.186 |
| 1998-05-14 | 15523.554 |
| 1998-05-15 | 15406.191 |
| 1998-05-18 | 15331.229 |
| 1998-05-19 | 15401.79 |
| 1998-05-20 | 15480.861 |
| 1998-05-21 | 15417.42 |
| 1998-05-22 | 15348.774 |
| 1998-05-26 | 15120.334 |
| 1998-05-27 | 15065.637 |
| 1998-05-28 | 15150.425 |
| 1998-05-29 | 15080.434 |
| 1998-06-01 | 15011.87 |
| 1998-06-02 | 15042.347 |
| 1998-06-03 | 14932.532 |
| 1998-06-04 | 15078.052 |
| 1998-06-05 | 15293.784 |
| 1998-06-08 | 15334.833 |
| 1998-06-09 | 15373.298 |
| 1998-06-10 | 15267.411 |
| 1998-06-11 | 15042.172 |
| 1998-06-12 | 15064.865 |
| 1998-06-15 | 14757.104 |
| 1998-06-16 | 14915.767 |
| 1998-06-17 | 15168.255 |
| 1998-06-18 | 15133.894 |
| 1998-06-19 | 15078.972 |
| 1998-06-22 | 15136.713 |
| 1998-06-23 | 15337.36 |
| 1998-06-24 | 15509.925 |
| 1998-06-25 | 15467.576 |
| 1998-06-26 | 15505.12 |
| 1998-06-29 | 15598.405 |
| 1998-06-30 | 15572.207 |
| 1998-07-01 | 15732.814 |
| 1998-07-02 | 15700.595 |
| 1998-07-06 | 15833.51 |
| 1998-07-07 | 15809.051 |
| 1998-07-08 | 15951.65 |
| 1998-07-09 | 15868.631 |
| 1998-07-10 | 15921.561 |
| 1998-07-13 | 15940.609 |
| 1998-07-14 | 16079.344 |
| 1998-07-15 | 16065.051 |
| 1998-07-16 | 16170.196 |
| 1998-07-17 | 16198.505 |
| 1998-07-20 | 16176.876 |
| 1998-07-21 | 15941.353 |
| 1998-07-22 | 15873.459 |
| 1998-07-23 | 15565.798 |
| 1998-07-24 | 15547.654 |
| 1998-07-27 | 15562.852 |
| 1998-07-28 | 15336.504 |
| 1998-07-29 | 15269.922 |
| 1998-07-30 | 15492.682 |
| 1998-07-31 | 15198.192 |
| 1998-08-03 | 15054.193 |
| 1998-08-04 | 14525.936 |
| 1998-08-05 | 14579.34 |
| 1998-08-06 | 14731.54 |
| 1998-08-07 | 14809.068 |
| 1998-08-10 | 14716.842 |
| 1998-08-11 | 14483.778 |
| 1998-08-12 | 14696.025 |
| 1998-08-13 | 14572.945 |
| 1998-08-14 | 14441.766 |
| 1998-08-17 | 14661.763 |
| 1998-08-18 | 14888.577 |
| 1998-08-19 | 14833.264 |
| 1998-08-20 | 14732.021 |
| 1998-08-21 | 14562.748 |
| 1998-08-24 | 14619.066 |
| 1998-08-25 | 14661.224 |
| 1998-08-26 | 14491.718 |
| 1998-08-27 | 13922.148 |
| 1998-08-28 | 13719.588 |
| 1998-08-31 | 12798.478 |
| 1998-09-01 | 13225.576 |
| 1998-09-02 | 13225.59 |
| 1998-09-03 | 13085.201 |
| 1998-09-04 | 12994.441 |
| 1998-09-08 | 13610.048 |
| 1998-09-09 | 13383.7 |
| 1998-09-10 | 13041.858 |
| 1998-09-11 | 13395.471 |
| 1998-09-14 | 13645.418 |
| 1998-09-15 | 13754.685 |
| 1998-09-16 | 13864.811 |
| 1998-09-17 | 13564.755 |
| 1998-09-18 | 13620.553 |
| 1998-09-21 | 13649.914 |
| 1998-09-22 | 13753.39 |
| 1998-09-23 | 14210.902 |
| 1998-09-24 | 13918.47 |
| 1998-09-25 | 13932.641 |
| 1998-09-28 | 13973.322 |
| 1998-09-29 | 13968.157 |
| 1998-09-30 | 13599.209 |
| 1998-10-01 | 13139.834 |
| 1998-10-02 | 13306.426 |
| 1998-10-05 | 13064.622 |
| 1998-10-06 | 12992.284 |
| 1998-10-07 | 12761.074 |
| 1998-10-08 | 12512.303 |
| 1998-10-09 | 12846.286 |
| 1998-10-12 | 13082.039 |
| 1998-10-13 | 13005.201 |
| 1998-10-14 | 13150.429 |
| 1998-10-15 | 13693.851 |
| 1998-10-16 | 13841.387 |
| 1998-10-19 | 13966.687 |
| 1998-10-20 | 14026.02 |
| 1998-10-21 | 14107.967 |
| 1998-10-22 | 14227.287 |
| 1998-10-23 | 14151.915 |
| 1998-10-26 | 14200.813 |
| 1998-10-27 | 14147.271 |
| 1998-10-28 | 14152.714 |
| 1998-10-29 | 14378.916 |
| 1998-10-30 | 14560.806 |
| 1998-11-02 | 14782.988 |
| 1998-11-03 | 14765.673 |
| 1998-11-04 | 14884.369 |
| 1998-11-05 | 15062.34 |
| 1998-11-06 | 15174.796 |
| 1998-11-09 | 15059.786 |
| 1998-11-10 | 15025.228 |
| 1998-11-11 | 14937.098 |
| 1998-11-12 | 14895.53 |
| 1998-11-13 | 14960.161 |
| 1998-11-16 | 15071.267 |
| 1998-11-17 | 15116.986 |
| 1998-11-18 | 15209.092 |
| 1998-11-19 | 15308.282 |
| 1998-11-20 | 15431.884 |
| 1998-11-23 | 15720.598 |
| 1998-11-24 | 15651.307 |
| 1998-11-25 | 15728.856 |
| 1998-11-27 | 15820.919 |
| 1998-11-30 | 15457.791 |
| 1998-12-01 | 15585.265 |
| 1998-12-02 | 15542.96 |
| 1998-12-03 | 15312.03 |
| 1998-12-04 | 15602.939 |
| 1998-12-07 | 15756.069 |
| 1998-12-08 | 15697.353 |
| 1998-12-09 | 15710.249 |
| 1998-12-10 | 15462.662 |
| 1998-12-11 | 15457.608 |
| 1998-12-14 | 15137.799 |
| 1998-12-15 | 15381.653 |
| 1998-12-16 | 15383.904 |
| 1998-12-17 | 15585.555 |
| 1998-12-18 | 15711.731 |
| 1998-12-21 | 15911.741 |
| 1998-12-22 | 15921.689 |
| 1998-12-23 | 16226.032 |
| 1998-12-24 | 16220.629 |
| 1998-12-28 | 16252.754 |
| 1998-12-29 | 16432.78 |
| 1998-12-30 | 16355.721 |
| 1998-12-31 | 16436.469 |
| 1999-01-04 | 16381.401 |
| 1999-01-05 | 16560.569 |
| 1999-01-06 | 16894.247 |
| 1999-01-07 | 16862.62 |
| 1999-01-08 | 16953.501 |
| 1999-01-11 | 16868.676 |
| 1999-01-12 | 16574.462 |
| 1999-01-13 | 16479.453 |
| 1999-01-14 | 16208.477 |
| 1999-01-15 | 16589.24 |
| 1999-01-19 | 16700.519 |
| 1999-01-20 | 16753.818 |
| 1999-01-21 | 16470.702 |
| 1999-01-22 | 16356.96 |
| 1999-01-25 | 16451.318 |
| 1999-01-25 | 16681.989 |
| 1999-01-27 | 16581.865 |
| 1999-01-28 | 16835.731 |
| 1999-01-29 | 16986.446 |
| 1999-02-01 | 16915.192 |
| 1999-02-02 | 16768.828 |
| 1999-02-03 | 16913.962 |
| 1999-02-04 | 16634.619 |
| 1999-02-05 | 16468.446 |
| 1999-02-08 | 16491.555 |
| 1999-02-09 | 16136.013 |
| 1999-02-10 | 16175.574 |
| 1999-02-11 | 16564.411 |
| 1999-02-12 | 16268.312 |
| 1999-02-16 | 16363.394 |
| 1999-02-17 | 16129.082 |
| 1999-02-18 | 16286.472 |
| 1999-02-19 | 16323.312 |
| 1999-02-22 | 16715.159 |
| 1999-02-23 | 16723.537 |
| 1999-02-24 | 16536.281 |
| 1999-02-25 | 16421.723 |
| 1999-02-26 | 16330.923 |
| 1999-03-01 | 16269.174 |
| 1999-03-02 | 16175.274 |
| 1999-03-03 | 16183.151 |
| 1999-03-04 | 16400.74 |
| 1999-03-05 | 16736.378 |
| 1999-03-08 | 16845.742 |
| 1999-03-09 | 16813.197 |
| 1999-03-10 | 16903.187 |
| 1999-03-11 | 17019.952 |
| 1999-03-12 | 16965.681 |
| 1999-03-15 | 17117.184 |
| 1999-03-16 | 17106.696 |
| 1999-03-17 | 17012.205 |
| 1999-03-18 | 17213.378 |
| 1999-03-19 | 17015.812 |
| 1999-03-22 | 16967.484 |
| 1999-03-23 | 16516.74 |
| 1999-03-24 | 16599.142 |
| 1999-03-25 | 16881.447 |
| 1999-03-26 | 16819.169 |
| 1999-03-29 | 17157.549 |
| 1999-03-30 | 17027.194 |
| 1999-03-31 | 16889.627 |
| 1999-04-01 | 16855.302 |
| 1999-04-05 | 17171.817 |
| 1999-04-06 | 17134.408 |
| 1999-04-07 | 17193.93 |
| 1999-04-08 | 17417.954 |
| 1999-04-09 | 17499.89 |
| 1999-04-12 | 17650.199 |
| 1999-04-13 | 17597.194 |
| 1999-04-14 | 17344.998 |
| 1999-04-15 | 17305.083 |
| 1999-04-16 | 17280.191 |
| 1999-04-19 | 16861.832 |
| 1999-04-20 | 17063.5 |
| 1999-04-21 | 17484.179 |
| 1999-04-22 | 17770.532 |
| 1999-04-23 | 17751.298 |
| 1999-04-26 | 17838.433 |
| 1999-04-27 | 17851.05 |
| 1999-04-28 | 17702.274 |
| 1999-04-29 | 17617.201 |
| 1999-04-30 | 17557.808 |
| 1999-05-03 | 17740.084 |
| 1999-05-04 | 17483.978 |
| 1999-05-05 | 17646.203 |
| 1999-05-06 | 17472.55 |
| 1999-05-07 | 17608.938 |
| 1999-05-10 | 17602.679 |
| 1999-05-11 | 17809.316 |
| 1999-05-12 | 17917.332 |
| 1999-05-13 | 17972.701 |
| 1999-05-14 | 17609.339 |
| 1999-05-17 | 17607.104 |
| 1999-05-18 | 17553.154 |
| 1999-05-19 | 17692.75 |
| 1999-05-20 | 17641.334 |
| 1999-05-21 | 17549.315 |
| 1999-05-24 | 17209.913 |
| 1999-05-25 | 16917.917 |
| 1999-05-26 | 17142.085 |
| 1999-05-27 | 16899.485 |
| 1999-05-28 | 17153.055 |
| 1999-06-01 | 17046.786 |
| 1999-06-02 | 17035.458 |
| 1999-06-03 | 17082.276 |
| 1999-06-04 | 17404.535 |
| 1999-06-07 | 17529.408 |
| 1999-06-08 | 17330.576 |
| 1999-06-09 | 17359.621 |
| 1999-06-10 | 17160.589 |
| 1999-06-11 | 17022.038 |
| 1999-06-14 | 16941.992 |
| 1999-06-15 | 17018.457 |
| 1999-06-16 | 17393.85 |
| 1999-06-17 | 17531.098 |
| 1999-06-18 | 17570.999 |
| 1999-06-21 | 17679.803 |
| 1999-06-22 | 17528.62 |
| 1999-06-23 | 17497.685 |
| 1999-06-24 | 17290.875 |
| 1999-06-25 | 17273.489 |
| 1999-06-28 | 17461.951 |
| 1999-06-29 | 17727.652 |
| 1999-06-30 | 18022.183 |
| 1999-07-01 | 18053.673 |
| 1999-07-02 | 18185.597 |
| 1999-07-06 | 18170.247 |
| 1999-07-07 | 18217.396 |
| 1999-07-08 | 18205.702 |
| 1999-07-09 | 18332.042 |
| 1999-07-12 | 18280.081 |
| 1999-07-13 | 18218.51 |
| 1999-07-14 | 18295.959 |
| 1999-07-15 | 18449.844 |
| 1999-07-16 | 18529.849 |
| 1999-07-19 | 18387.331 |
| 1999-07-20 | 18000.798 |
| 1999-07-21 | 18036.31 |
| 1999-07-22 | 17806.432 |
| 1999-07-23 | 17758.269 |
| 1999-07-26 | 17583.608 |
| 1999-07-27 | 17777.632 |
| 1999-07-28 | 17816.727 |
| 1999-07-29 | 17513.413 |
| 1999-07-30 | 17405.878 |
| 1999-08-02 | 17297.859 |
| 1999-08-03 | 17181.194 |
| 1999-08-04 | 16926.568 |
| 1999-08-05 | 17023.86 |
| 1999-08-06 | 16869.817 |
| 1999-08-09 | 16809.49 |
| 1999-08-10 | 16615.134 |
| 1999-08-11 | 16866.512 |
| 1999-08-12 | 16855.586 |
| 1999-08-13 | 17200.938 |
| 1999-08-16 | 17249.171 |
| 1999-08-17 | 17418.242 |
| 1999-08-18 | 17300.409 |
| 1999-08-19 | 17179.969 |
| 1999-08-20 | 17336.178 |
| 1999-08-23 | 17616.887 |
| 1999-08-24 | 17654.493 |
| 1999-08-25 | 17864.177 |
| 1999-08-26 | 17656.359 |
| 1999-08-27 | 17488.484 |
| 1999-08-30 | 17192.918 |
| 1999-08-31 | 17153.944 |
| 1999-09-01 | 17195.266 |
| 1999-09-02 | 17039.603 |
| 1999-09-03 | 17509.328 |
| 1999-09-07 | 17469.817 |
| 1999-09-08 | 17388.186 |
| 1999-09-09 | 17442.71 |
| 1999-09-10 | 17504.649 |
| 1999-09-13 | 17407.537 |
| 1999-09-14 | 17312.821 |
| 1999-09-15 | 17091.519 |
| 1999-09-16 | 17058.472 |
| 1999-09-17 | 17271.212 |
| 1999-09-20 | 17262.847 |
| 1999-09-21 | 16931.249 |
| 1999-09-22 | 17003.197 |
| 1999-09-23 | 16592.845 |
| 1999-09-24 | 16552.866 |
| 1999-09-27 | 16618.221 |
| 1999-09-28 | 16583.46 |
| 1999-09-29 | 16456.462 |
| 1999-09-30 | 16606.596 |
| 1999-10-01 | 16562.118 |
| 1999-10-04 | 16830.433 |
| 1999-10-05 | 16810.904 |
| 1999-10-06 | 17112.901 |
| 1999-10-07 | 17032.661 |
| 1999-10-08 | 17223.142 |
| 1999-10-11 | 17260.927 |
| 1999-10-12 | 17006.89 |
| 1999-10-13 | 16634.857 |
| 1999-10-14 | 16629.904 |
| 1999-10-15 | 16198.844 |
| 1999-10-18 | 16212.147 |
| 1999-10-19 | 16323.096 |
| 1999-10-20 | 16650.566 |
| 1999-10-21 | 16585.185 |
| 1999-10-22 | 16805.385 |
| 1999-10-25 | 16734.627 |
| 1999-10-26 | 16609.526 |
| 1999-10-27 | 16773.162 |
| 1999-10-28 | 17306.354 |
| 1999-10-29 | 17617.973 |
| 1999-11-01 | 17542.163 |
| 1999-11-02 | 17494.359 |
| 1999-11-03 | 17610.758 |
| 1999-11-04 | 17728.289 |
| 1999-11-05 | 17847.516 |
| 1999-11-08 | 17946.236 |
| 1999-11-09 | 17797.449 |
| 1999-11-10 | 17896.311 |
| 1999-11-11 | 17958.923 |
| 1999-11-12 | 18163.321 |
| 1999-11-15 | 18166.376 |
| 1999-11-16 | 18496.522 |
| 1999-11-17 | 18390.136 |
| 1999-11-18 | 18595.977 |
| 1999-11-19 | 18564.65 |
| 1999-11-22 | 18567.125 |
| 1999-11-23 | 18331.852 |
| 1999-11-24 | 18497.724 |
| 1999-11-26 | 18530.027 |
| 1999-11-29 | 18412.059 |
| 1999-11-30 | 18176.814 |
| 1999-12-01 | 18277.966 |
| 1999-12-02 | 18481.304 |
| 1999-12-03 | 18783.743 |
| 1999-12-06 | 18697.201 |
| 1999-12-07 | 18615.622 |
| 1999-12-08 | 18588.298 |
| 1999-12-09 | 18646.158 |
| 1999-12-10 | 18746.73 |
| 1999-12-13 | 18735.699 |
| 1999-12-14 | 18511.712 |
| 1999-12-15 | 18602.95 |
| 1999-12-16 | 18703.608 |
| 1999-12-17 | 18741.285 |
| 1999-12-20 | 18737.848 |
| 1999-12-21 | 18970.632 |
| 1999-12-22 | 19055.676 |
| 1999-12-23 | 19309.561 |
| 1999-12-27 | 19272.421 |
| 1999-12-28 | 19308.614 |
| 1999-12-29 | 19424.56 |
| 1999-12-30 | 19429.524 |
| 1999-12-31 | 19535.613 |
| 2000-01-03 | 19333.617 |
| 2000-01-04 | 18569.351 |
| 2000-01-05 | 18583.523 |
| 2000-01-06 | 18521.054 |
| 2000-01-07 | 19032.623 |
| 2000-01-10 | 19350.877 |
| 2000-01-11 | 19053.662 |
| 2000-01-12 | 18933.307 |
| 2000-01-13 | 19224.698 |
| 2000-01-14 | 19453.253 |
| 2000-01-18 | 19402.586 |
| 2000-01-19 | 19470.555 |
| 2000-01-20 | 19423.146 |
| 2000-01-21 | 19450.559 |
| 2000-01-24 | 18942.938 |
| 2000-01-25 | 19047.063 |
| 2000-01-25 | 18968.927 |
| 2000-01-27 | 18889.748 |
| 2000-01-28 | 18356.59 |
| 2000-01-31 | 18656.977 |
| 2000-02-01 | 18774.422 |
| 2000-02-02 | 18807.421 |
| 2000-02-03 | 19073.306 |
| 2000-02-04 | 19070.292 |
| 2000-02-07 | 19125.104 |
| 2000-02-08 | 19364.439 |
| 2000-02-09 | 19001.252 |
| 2000-02-10 | 19109.516 |
| 2000-02-11 | 18764.371 |
| 2000-02-14 | 18810.253 |
| 2000-02-15 | 18928.553 |
| 2000-02-16 | 18815.664 |
| 2000-02-17 | 18900.601 |
| 2000-02-18 | 18398.17 |
| 2000-02-22 | 18434.127 |
| 2000-02-23 | 18636.748 |
| 2000-02-24 | 18623.276 |
| 2000-02-25 | 18423.908 |
| 2000-02-28 | 18586.618 |
| 2000-02-29 | 18940.146 |
| 2000-03-01 | 19038.726 |
| 2000-03-02 | 19037.252 |
| 2000-03-03 | 19464.512 |
| 2000-03-06 | 19294.874 |
| 2000-03-07 | 18886.675 |
| 2000-03-08 | 19003.438 |
| 2000-03-09 | 19474.009 |
| 2000-03-10 | 19398.442 |
| 2000-03-13 | 19135.204 |
| 2000-03-14 | 18715.73 |
| 2000-03-15 | 18921.17 |
| 2000-03-16 | 19746.104 |
| 2000-03-17 | 19845.473 |
| 2000-03-20 | 19539.175 |
| 2000-03-21 | 19946.525 |
| 2000-03-22 | 20189.826 |
| 2000-03-23 | 20486.03 |
| 2000-03-24 | 20510.208 |
| 2000-03-27 | 20443.818 |
| 2000-03-28 | 20172.182 |
| 2000-03-29 | 19999.957 |
| 2000-03-30 | 19651.364 |
| 2000-03-31 | 19876.951 |
| 2000-04-03 | 19622.814 |
| 2000-04-04 | 19392.329 |
| 2000-04-05 | 19382.282 |
| 2000-04-06 | 19657.581 |
| 2000-04-07 | 19927.794 |
| 2000-04-10 | 19569.316 |
| 2000-04-11 | 19415.729 |
| 2000-04-12 | 18878.915 |
| 2000-04-13 | 18530.345 |
| 2000-04-14 | 17334.229 |
| 2000-04-17 | 17855.049 |
| 2000-04-18 | 18521.341 |
| 2000-04-19 | 18371.908 |
| 2000-04-20 | 18410.843 |
| 2000-04-24 | 18240.067 |
| 2000-04-25 | 18909.124 |
| 2000-04-26 | 18688.518 |
| 2000-04-27 | 18821.999 |
| 2000-04-28 | 18816.955 |
| 2000-05-01 | 19051.946 |
| 2000-05-02 | 18678.702 |
| 2000-05-03 | 18291.94 |
| 2000-05-04 | 18295.437 |
| 2000-05-05 | 18578.673 |
| 2000-05-08 | 18409.9 |
| 2000-05-09 | 18208.719 |
| 2000-05-10 | 17750.312 |
| 2000-05-11 | 18100.613 |
| 2000-05-12 | 18252.911 |
| 2000-05-15 | 18650.596 |
| 2000-05-16 | 18877.843 |
| 2000-05-17 | 18622.782 |
| 2000-05-18 | 18432.621 |
| 2000-05-19 | 18016.435 |
| 2000-05-22 | 17895.129 |
| 2000-05-23 | 17502.815 |
| 2000-05-24 | 17771.464 |
| 2000-05-25 | 17552.725 |
| 2000-05-26 | 17511.642 |
| 2000-05-30 | 18155.062 |
| 2000-05-31 | 18116.671 |
| 2000-06-01 | 18457.219 |
| 2000-06-02 | 18962.911 |
| 2000-06-05 | 18886.186 |
| 2000-06-06 | 18840.264 |
| 2000-06-07 | 18950.443 |
| 2000-06-08 | 18840.264 |
| 2000-06-09 | 18839.38 |
| 2000-06-12 | 18627.237 |
| 2000-06-13 | 18898.681 |
| 2000-06-14 | 18874.34 |
| 2000-06-15 | 18967.205 |
| 2000-06-16 | 18825.132 |
| 2000-06-19 | 19131.935 |
| 2000-06-20 | 19078.53 |
| 2000-06-21 | 19139.418 |
| 2000-06-22 | 18784.36 |
| 2000-06-23 | 18608.515 |
| 2000-06-26 | 18781.75 |
| 2000-06-27 | 18690.128 |
| 2000-06-28 | 18818.615 |
| 2000-06-29 | 18688.264 |
| 2000-06-30 | 18802.93 |
| 2000-07-03 | 18940.945 |
| 2000-07-05 | 18637.814 |
| 2000-07-06 | 18798.967 |
| 2000-07-07 | 19077.165 |
| 2000-07-10 | 19045.772 |
| 2000-07-11 | 19078.433 |
| 2000-07-12 | 19310.499 |
| 2000-07-13 | 19403.163 |
| 2000-07-14 | 19585.833 |
| 2000-07-17 | 19610.931 |
| 2000-07-18 | 19352.761 |
| 2000-07-19 | 19141.26 |
| 2000-07-20 | 19390.228 |
| 2000-07-21 | 19136.99 |
| 2000-07-24 | 18873.709 |
| 2000-07-25 | 18973.895 |
| 2000-07-26 | 18735.051 |
| 2000-07-27 | 18589.767 |
| 2000-07-28 | 18178.199 |
| 2000-07-31 | 18362.425 |
| 2000-08-01 | 18407.496 |
| 2000-08-02 | 18412.662 |
| 2000-08-03 | 18600.511 |
| 2000-08-04 | 18761.099 |
| 2000-08-07 | 18975.961 |
| 2000-08-08 | 19000.797 |
| 2000-08-09 | 18885.886 |
| 2000-08-10 | 18712.391 |
| 2000-08-11 | 18876.988 |
| 2000-08-14 | 19112.856 |
| 2000-08-15 | 19022.727 |
| 2000-08-16 | 18988.317 |
| 2000-08-17 | 19203.633 |
| 2000-08-18 | 19157.06 |
| 2000-08-21 | 19243.002 |
| 2000-08-22 | 19242.933 |
| 2000-08-23 | 19352.458 |
| 2000-08-24 | 19418.302 |
| 2000-08-25 | 19410.67 |
| 2000-08-28 | 19503.059 |
| 2000-08-29 | 19487.59 |
| 2000-08-30 | 19457.905 |
| 2000-08-31 | 19670.672 |
| 2000-09-01 | 19637.133 |
| 2000-09-05 | 19461.439 |
| 2000-09-06 | 19246.019 |
| 2000-09-07 | 19397.677 |
| 2000-09-08 | 19253.789 |
| 2000-09-11 | 19179.296 |
| 2000-09-12 | 19099.638 |
| 2000-09-13 | 19144.133 |
| 2000-09-14 | 19149.738 |
| 2000-09-15 | 18929.535 |
| 2000-09-18 | 18606.775 |
| 2000-09-19 | 18836.954 |
| 2000-09-20 | 18764.873 |
| 2000-09-21 | 18688.668 |
| 2000-09-22 | 18743.948 |
| 2000-09-25 | 18643.158 |
| 2000-09-26 | 18478.674 |
| 2000-09-27 | 18452.226 |
| 2000-09-28 | 18892.124 |
| 2000-09-29 | 18655.121 |
| 2000-10-02 | 18498.36 |
| 2000-10-03 | 18281.957 |
| 2000-10-04 | 18402.245 |
| 2000-10-05 | 18361.246 |
| 2000-10-06 | 17978.399 |
| 2000-10-09 | 17920.437 |
| 2000-10-10 | 17666.524 |
| 2000-10-11 | 17373.062 |
| 2000-10-12 | 16901.323 |
| 2000-10-13 | 17514.772 |
| 2000-10-16 | 17553.309 |
| 2000-10-17 | 17221.132 |
| 2000-10-18 | 17091.912 |
| 2000-10-19 | 17705.676 |
| 2000-10-20 | 17862.448 |
| 2000-10-23 | 17864.514 |
| 2000-10-24 | 17847.92 |
| 2000-10-25 | 17419.656 |
| 2000-10-26 | 17426.66 |
| 2000-10-27 | 17593.295 |
| 2000-10-30 | 17737.003 |
| 2000-10-31 | 18214.406 |
| 2000-11-01 | 18119.067 |
| 2000-11-02 | 18304.611 |
| 2000-11-03 | 18297.297 |
| 2000-11-06 | 18326.992 |
| 2000-11-07 | 18324.354 |
| 2000-11-08 | 17982.292 |
| 2000-11-09 | 17813.715 |
| 2000-11-10 | 17348.358 |
| 2000-11-13 | 17120.923 |
| 2000-11-14 | 17564.145 |
| 2000-11-15 | 17672.551 |
| 2000-11-16 | 17391.671 |
| 2000-11-17 | 17308.723 |
| 2000-11-20 | 16900.502 |
| 2000-11-21 | 16900.639 |
| 2000-11-22 | 16556.977 |
| 2000-11-24 | 16889.66 |
| 2000-11-27 | 16944.758 |
| 2000-11-28 | 16676.416 |
| 2000-11-29 | 16708.095 |
| 2000-11-30 | 16374.017 |
| 2000-12-01 | 16467.149 |
| 2000-12-04 | 16531.157 |
| 2000-12-05 | 17259.888 |
| 2000-12-06 | 16960.721 |
| 2000-12-07 | 16866.548 |
| 2000-12-08 | 17327.644 |
| 2000-12-11 | 17526.236 |
| 2000-12-12 | 17353.814 |
| 2000-12-13 | 17162.363 |
| 2000-12-14 | 16865.755 |
| 2000-12-15 | 16544.468 |
| 2000-12-18 | 16659.42 |
| 2000-12-19 | 16399.693 |
| 2000-12-20 | 15828.09 |
| 2000-12-21 | 15917.366 |
| 2000-12-22 | 16390.733 |
| 2000-12-26 | 16489.515 |
| 2000-12-27 | 16710.816 |
| 2000-12-28 | 16861.446 |
| 2000-12-29 | 16656.534 |
| 2001-01-02 | 15991.877 |
| 2001-01-03 | 16829.73 |
| 2001-01-04 | 16617.881 |
| 2001-01-05 | 16139.698 |
| 2001-01-08 | 16090.474 |
| 2001-01-09 | 16172.759 |
| 2001-01-10 | 16400.485 |
| 2001-01-11 | 16621.986 |
| 2001-01-12 | 16559.304 |
| 2001-01-16 | 16677.246 |
| 2001-01-17 | 16734.313 |
| 2001-01-18 | 16921.979 |
| 2001-01-19 | 16834.759 |
| 2001-01-22 | 16842.848 |
| 2001-01-23 | 17106.694 |
| 2001-01-24 | 17170.898 |
| 2001-01-25 | 17045.127 |
| 2001-01-25 | 17029.684 |
| 2001-01-29 | 17183.704 |
| 2001-01-30 | 17290.512 |
| 2001-01-31 | 17171.075 |
| 2001-02-01 | 17183.658 |
| 2001-02-02 | 16837.43 |
| 2001-02-05 | 16887.162 |
| 2001-02-06 | 16897.561 |
| 2001-02-07 | 16759.468 |
| 2001-02-08 | 16645.868 |
| 2001-02-09 | 16416.164 |
| 2001-02-12 | 16591.18 |
| 2001-02-13 | 16448.105 |
| 2001-02-14 | 16443.23 |
| 2001-02-15 | 16591.519 |
| 2001-02-16 | 16287.955 |
| 2001-02-20 | 15987.112 |
| 2001-02-21 | 15701.868 |
| 2001-02-22 | 15630.878 |
| 2001-02-23 | 15571.817 |
| 2001-02-26 | 15871.983 |
| 2001-02-27 | 15695.572 |
| 2001-02-28 | 15469.7 |
| 2001-03-01 | 15440.201 |
| 2001-03-02 | 15365.847 |
| 2001-03-05 | 15447.077 |
| 2001-03-06 | 15608.376 |
| 2001-03-07 | 15702.494 |
| 2001-03-08 | 15689.391 |
| 2001-03-09 | 15308.19 |
| 2001-03-12 | 14656.86 |
| 2001-03-13 | 14879.68 |
| 2001-03-14 | 14514.933 |
| 2001-03-15 | 14566.471 |
| 2001-03-16 | 14264.798 |
| 2001-03-19 | 14528.172 |
| 2001-03-20 | 14190.525 |
| 2001-03-21 | 13925.665 |
| 2001-03-22 | 13862.955 |
| 2001-03-23 | 14151.335 |
| 2001-03-26 | 14309.891 |
| 2001-03-27 | 14647.796 |
| 2001-03-28 | 14279.347 |
| 2001-03-29 | 14209.019 |
| 2001-03-30 | 14381.625 |
| 2001-04-02 | 14104.326 |
| 2001-04-03 | 13594.665 |
| 2001-04-04 | 13548.028 |
| 2001-04-05 | 14171.698 |
| 2001-04-06 | 13884.231 |
| 2001-04-09 | 14008.373 |
| 2001-04-10 | 14399.813 |
| 2001-04-11 | 14381.863 |
| 2001-04-12 | 14602.98 |
| 2001-04-16 | 14539.146 |
| 2001-04-17 | 14698.663 |
| 2001-04-18 | 15263.829 |
| 2001-04-19 | 15481.353 |
| 2001-04-20 | 15352.596 |
| 2001-04-23 | 15103.894 |
| 2001-04-24 | 14934.999 |
| 2001-04-25 | 15183.458 |
| 2001-04-26 | 15259.765 |
| 2001-04-27 | 15485.982 |
| 2001-04-30 | 15490.799 |
| 2001-05-01 | 15628.724 |
| 2001-05-02 | 15672.513 |
| 2001-05-03 | 15432.178 |
| 2001-05-04 | 15655.22 |
| 2001-05-07 | 15603.97 |
| 2001-05-08 | 15588.82 |
| 2001-05-09 | 15515.147 |
| 2001-05-10 | 15505.476 |
| 2001-05-11 | 15392.77 |
| 2001-05-14 | 15413.277 |
| 2001-05-15 | 15428.91 |
| 2001-05-16 | 15850.025 |
| 2001-05-17 | 15934.441 |
| 2001-05-18 | 15971.652 |
| 2001-05-21 | 16264.523 |
| 2001-05-22 | 16242.354 |
| 2001-05-23 | 15970.514 |
| 2001-05-24 | 16034.449 |
| 2001-05-25 | 15873.064 |
| 2001-05-29 | 15711.573 |
| 2001-05-30 | 15440.603 |
| 2001-05-31 | 15552.011 |
| 2001-06-01 | 15607.719 |
| 2001-06-04 | 15687.995 |
| 2001-06-05 | 15917.173 |
| 2001-06-06 | 15763.255 |
| 2001-06-07 | 15848.091 |
| 2001-06-08 | 15694.962 |
| 2001-06-11 | 15546.233 |
| 2001-06-12 | 15554.644 |
| 2001-06-13 | 15391.071 |
| 2001-06-14 | 15094.87 |
| 2001-06-15 | 15028.06 |
| 2001-06-18 | 14938.866 |
| 2001-06-19 | 14970.318 |
| 2001-06-20 | 15128.033 |
| 2001-06-21 | 15276.656 |
| 2001-06-22 | 15127.619 |
| 2001-06-25 | 15048.347 |
| 2001-06-26 | 15049.818 |
| 2001-06-27 | 15016.039 |
| 2001-06-28 | 15210.756 |
| 2001-06-29 | 15254.243 |
| 2001-07-02 | 15391.379 |
| 2001-07-03 | 15360.268 |
| 2001-07-05 | 15175.703 |
| 2001-07-06 | 14831.128 |
| 2001-07-09 | 14917.946 |
| 2001-07-10 | 14701.009 |
| 2001-07-11 | 14676.857 |
| 2001-07-12 | 15030.431 |
| 2001-07-13 | 15115.867 |
| 2001-07-16 | 14944.954 |
| 2001-07-17 | 15100.834 |
| 2001-07-18 | 14998.662 |
| 2001-07-19 | 15080.464 |
| 2001-07-20 | 15036.009 |
| 2001-07-23 | 14808.626 |
| 2001-07-24 | 14562.495 |
| 2001-07-25 | 14763.715 |
| 2001-07-26 | 14935.553 |
| 2001-07-27 | 14972.753 |
| 2001-07-30 | 14956.916 |
| 2001-07-31 | 15030.833 |
| 2001-08-01 | 15099.52 |
| 2001-08-02 | 15149.017 |
| 2001-08-03 | 15077.004 |
| 2001-08-06 | 14905.716 |
| 2001-08-07 | 14937.766 |
| 2001-08-08 | 14682.838 |
| 2001-08-09 | 14675.57 |
| 2001-08-10 | 14743.774 |
| 2001-08-13 | 14774.752 |
| 2001-08-14 | 14734.266 |
| 2001-08-15 | 14631.196 |
| 2001-08-16 | 14663.528 |
| 2001-08-17 | 14429.493 |
| 2001-08-20 | 14533.422 |
| 2001-08-21 | 14363.729 |
| 2001-08-22 | 14462.764 |
| 2001-08-23 | 14418.751 |
| 2001-08-24 | 14682.034 |
| 2001-08-27 | 14622.854 |
| 2001-08-28 | 14414.742 |
| 2001-08-29 | 14274.042 |
| 2001-08-30 | 14043.145 |
| 2001-08-31 | 14100.943 |
| 2001-09-04 | 14025.539 |
| 2001-09-05 | 13980.924 |
| 2001-09-06 | 13686.636 |
| 2001-09-07 | 13438.792 |
| 2001-09-10 | 13489.469 |
| 2001-09-17 | 12803.598 |
| 2001-09-18 | 12704.301 |
| 2001-09-19 | 12492.636 |
| 2001-09-20 | 12112.801 |
| 2001-09-21 | 11882.126 |
| 2001-09-24 | 12333.477 |
| 2001-09-25 | 12425.966 |
| 2001-09-26 | 12344.157 |
| 2001-09-27 | 12482.303 |
| 2001-09-28 | 12766.565 |
| 2001-10-01 | 12750.023 |
| 2001-10-02 | 12750.049 |
| 2001-10-03 | 13184.064 |
| 2001-10-04 | 13173.053 |
| 2001-10-05 | 13176.911 |
| 2001-10-08 | 13072.724 |
| 2001-10-09 | 13007.276 |
| 2001-10-10 | 13311.653 |
| 2001-10-11 | 13541.164 |
| 2001-10-12 | 13460.901 |
| 2001-10-15 | 13449.086 |
| 2001-10-16 | 13553.006 |
| 2001-10-17 | 13283.041 |
| 2001-10-18 | 13182.993 |
| 2001-10-19 | 13254.308 |
| 2001-10-22 | 13451.618 |
| 2001-10-23 | 13388.715 |
| 2001-10-24 | 13396.551 |
| 2001-10-25 | 13586.815 |
| 2001-10-26 | 13643.623 |
| 2001-10-29 | 13328.463 |
| 2001-10-30 | 13098.362 |
| 2001-10-31 | 13122.996 |
| 2001-11-01 | 13418.562 |
| 2001-11-02 | 13440.312 |
| 2001-11-05 | 13628.576 |
| 2001-11-06 | 13826.18 |
| 2001-11-07 | 13792.407 |
| 2001-11-08 | 13807.314 |
| 2001-11-09 | 13816.572 |
| 2001-11-12 | 13806.751 |
| 2001-11-13 | 14060.064 |
| 2001-11-14 | 14103.243 |
| 2001-11-15 | 14104.088 |
| 2001-11-16 | 14070.758 |
| 2001-11-19 | 14232 |
| 2001-11-20 | 14119.666 |
| 2001-11-21 | 14054.483 |
| 2001-11-23 | 14217.991 |
| 2001-11-26 | 14317.752 |
| 2001-11-27 | 14241.566 |
| 2001-11-28 | 13990.775 |
| 2001-11-29 | 14148.742 |
| 2001-11-30 | 14130.843 |
| 2001-12-03 | 14068.737 |
| 2001-12-04 | 14272.121 |
| 2001-12-05 | 14595.005 |
| 2001-12-06 | 14578.314 |
| 2001-12-07 | 14474.992 |
| 2001-12-10 | 14256.845 |
| 2001-12-11 | 14231.425 |
| 2001-12-12 | 14233.446 |
| 2001-12-13 | 14021.777 |
| 2001-12-14 | 14068.427 |
| 2001-12-17 | 14211.569 |
| 2001-12-18 | 14328.766 |
| 2001-12-19 | 14389.829 |
| 2001-12-20 | 14256.198 |
| 2001-12-21 | 14339.529 |
| 2001-12-24 | 14344.985 |
| 2001-12-26 | 14418.455 |
| 2001-12-27 | 14514.422 |
| 2001-12-28 | 14573.6 |
| 2001-12-31 | 14424.221 |
| 2002-01-02 | 14449.691 |
| 2002-01-03 | 14591.905 |
| 2002-01-04 | 14693.569 |
| 2002-01-07 | 14593.867 |
| 2002-01-08 | 14557.793 |
| 2002-01-09 | 14492.123 |
| 2002-01-10 | 14503.44 |
| 2002-01-11 | 14378.927 |
| 2002-01-14 | 14262.506 |
| 2002-01-15 | 14358.968 |
| 2002-01-16 | 14131.488 |
| 2002-01-17 | 14276.027 |
| 2002-01-18 | 14125.09 |
| 2002-01-22 | 14011.894 |
| 2002-01-23 | 14142.186 |
| 2002-01-24 | 14201.231 |
| 2002-01-25 | 14215.356 |
| 2002-01-28 | 14222.749 |
| 2002-01-29 | 13867.49 |
| 2002-01-30 | 14012.284 |
| 2002-01-31 | 14199.456 |
| 2002-02-01 | 14043.789 |
| 2002-02-04 | 13715.874 |
| 2002-02-05 | 13669.057 |
| 2002-02-06 | 13564.795 |
| 2002-02-07 | 13508.54 |
| 2002-02-08 | 13721.349 |
| 2002-02-11 | 13904.317 |
| 2002-02-12 | 13862.494 |
| 2002-02-13 | 13995.955 |
| 2002-02-14 | 13962.312 |
| 2002-02-15 | 13809.908 |
| 2002-02-19 | 13547.016 |
| 2002-02-20 | 13725.272 |
| 2002-02-21 | 13520.455 |
| 2002-02-22 | 13627.596 |
| 2002-02-25 | 13851.704 |
| 2002-02-26 | 13867.769 |
| 2002-02-27 | 13873.619 |
| 2002-02-28 | 13833.229 |
| 2002-03-01 | 14058.22 |
| 2002-03-04 | 14335.004 |
| 2002-03-05 | 14260.946 |
| 2002-03-06 | 14456.602 |
| 2002-03-07 | 14397.374 |
| 2002-03-08 | 14498.418 |
| 2002-03-11 | 14540.339 |
| 2002-03-12 | 14501.493 |
| 2002-03-13 | 14368.539 |
| 2002-03-14 | 14363.84 |
| 2002-03-15 | 14517.082 |
| 2002-03-18 | 14532.179 |
| 2002-03-19 | 14582.248 |
| 2002-03-20 | 14365.65 |
| 2002-03-21 | 14409.023 |
| 2002-03-22 | 14346.906 |
| 2002-03-25 | 14142.489 |
| 2002-03-26 | 14225.973 |
| 2002-03-27 | 14306.595 |
| 2002-03-28 | 14345.415 |
| 2002-04-01 | 14251.649 |
| 2002-04-02 | 14124.704 |
| 2002-04-03 | 13985.341 |
| 2002-04-04 | 14002.366 |
| 2002-04-05 | 13968.673 |
| 2002-04-08 | 14017.947 |
| 2002-04-09 | 13939.111 |
| 2002-04-10 | 14100.385 |
| 2002-04-11 | 13794.333 |
| 2002-04-12 | 13908.49 |
| 2002-04-15 | 13818.295 |
| 2002-04-16 | 14124.863 |
| 2002-04-17 | 14089.251 |
| 2002-04-18 | 14070.756 |
| 2002-04-19 | 14079.375 |
| 2002-04-22 | 13872.335 |
| 2002-04-23 | 13801.31 |
| 2002-04-24 | 13715.206 |
| 2002-04-25 | 13704.046 |
| 2002-04-26 | 13514.362 |
| 2002-04-29 | 13397.505 |
| 2002-04-30 | 13557.944 |
| 2002-05-01 | 13660.239 |
| 2002-05-02 | 13633.537 |
| 2002-05-03 | 13506.128 |
| 2002-05-06 | 13260.299 |
| 2002-05-07 | 13212.15 |
| 2002-05-08 | 13674.034 |
| 2002-05-09 | 13478.062 |
| 2002-05-10 | 13261.782 |
| 2002-05-13 | 13490.824 |
| 2002-05-14 | 13781.836 |
| 2002-05-15 | 13725.373 |
| 2002-05-16 | 13772.41 |
| 2002-05-17 | 13866.405 |
| 2002-05-20 | 13690.873 |
| 2002-05-21 | 13534.512 |
| 2002-05-22 | 13584.54 |
| 2002-05-23 | 13727.663 |
| 2002-05-24 | 13570.468 |
| 2002-05-28 | 13473.058 |
| 2002-05-29 | 13385.127 |
| 2002-05-30 | 13353.804 |
| 2002-05-31 | 13379.632 |
| 2002-06-03 | 13052.792 |
| 2002-06-04 | 13038.859 |
| 2002-06-05 | 13139.721 |
| 2002-06-06 | 12893.103 |
| 2002-06-07 | 12904.072 |
| 2002-06-10 | 12929.211 |
| 2002-06-11 | 12714.507 |
| 2002-06-12 | 12781.855 |
| 2002-06-13 | 12645.36 |
| 2002-06-14 | 12635.516 |
| 2002-06-17 | 12981.184 |
| 2002-06-18 | 12986.331 |
| 2002-06-19 | 12779.049 |
| 2002-06-20 | 12611.343 |
| 2002-06-21 | 12424.16 |
| 2002-06-24 | 12446.494 |
| 2002-06-25 | 12241.131 |
| 2002-06-26 | 12202.311 |
| 2002-06-27 | 12401.971 |
| 2002-06-28 | 12416.287 |
| 2002-07-01 | 12117.628 |
| 2002-07-02 | 11844.15 |
| 2002-07-03 | 11892.563 |
| 2002-07-05 | 12309.15 |
| 2002-07-08 | 12157.371 |
| 2002-07-09 | 11877.416 |
| 2002-07-10 | 11520.092 |
| 2002-07-11 | 11577.756 |
| 2002-07-12 | 11513.775 |
| 2002-07-15 | 11460.499 |
| 2002-07-16 | 11293.639 |
| 2002-07-17 | 11360.304 |
| 2002-07-18 | 11056.031 |
| 2002-07-19 | 10682.966 |
| 2002-07-22 | 10342.652 |
| 2002-07-23 | 10047.049 |
| 2002-07-24 | 10585.256 |
| 2002-07-25 | 10535.733 |
| 2002-07-26 | 10694.385 |
| 2002-07-29 | 11268.647 |
| 2002-07-30 | 11317.482 |
| 2002-07-31 | 11388.667 |
| 2002-08-01 | 11046.891 |
| 2002-08-02 | 10783.924 |
| 2002-08-05 | 10427.944 |
| 2002-08-06 | 10740.217 |
| 2002-08-07 | 10930.668 |
| 2002-08-08 | 11259.117 |
| 2002-08-09 | 11291.482 |
| 2002-08-12 | 11245.825 |
| 2002-08-13 | 11006.477 |
| 2002-08-14 | 11411.472 |
| 2002-08-15 | 11545.281 |
| 2002-08-16 | 11552.842 |
| 2002-08-19 | 11798.184 |
| 2002-08-20 | 11644.959 |
| 2002-08-21 | 11800.634 |
| 2002-08-22 | 11954.992 |
| 2002-08-23 | 11693.276 |
| 2002-08-26 | 11791.729 |
| 2002-08-27 | 11613.41 |
| 2002-08-28 | 11408.166 |
| 2002-08-29 | 11429.479 |
| 2002-08-30 | 11399.722 |
| 2002-09-03 | 10938.011 |
| 2002-09-04 | 11132.079 |
| 2002-09-05 | 10955.607 |
| 2002-09-06 | 11153.528 |
| 2002-09-09 | 11253.488 |
| 2002-09-10 | 11328.763 |
| 2002-09-11 | 11323.989 |
| 2002-09-12 | 11057.119 |
| 2002-09-13 | 11100.569 |
| 2002-09-16 | 11102.003 |
| 2002-09-17 | 10892.877 |
| 2002-09-18 | 10842.785 |
| 2002-09-19 | 10527.375 |
| 2002-09-20 | 10551.178 |
| 2002-09-23 | 10400.022 |
| 2002-09-24 | 10239.462 |
| 2002-09-25 | 10483.49 |
| 2002-09-26 | 10665.853 |
| 2002-09-27 | 10353.086 |
| 2002-09-30 | 10223.011 |
| 2002-10-01 | 10561.881 |
| 2002-10-02 | 10319.057 |
| 2002-10-03 | 10205.884 |
| 2002-10-04 | 9976.322 |
| 2002-10-07 | 9774.133 |
| 2002-10-08 | 9916.02 |
| 2002-10-09 | 9640.505 |
| 2002-10-10 | 9966.554 |
| 2002-10-11 | 10336.598 |
| 2002-10-14 | 10411.972 |
| 2002-10-15 | 10884.673 |
| 2002-10-16 | 10622.813 |
| 2002-10-17 | 10874.209 |
| 2002-10-18 | 10928.393 |
| 2002-10-21 | 11106.319 |
| 2002-10-22 | 10982.616 |
| 2002-10-23 | 11068.547 |
| 2002-10-24 | 10913.15 |
| 2002-10-25 | 11094.949 |
| 2002-10-28 | 11003.544 |
| 2002-10-29 | 10907.255 |
| 2002-10-30 | 11017.409 |
| 2002-10-31 | 10972.428 |
| 2002-11-01 | 11162.643 |
| 2002-11-04 | 11251.711 |
| 2002-11-05 | 11322.713 |
| 2002-11-06 | 11433.983 |
| 2002-11-07 | 11181.037 |
| 2002-11-08 | 11079.404 |
| 2002-11-11 | 10850.761 |
| 2002-11-12 | 10941.076 |
| 2002-11-13 | 10937.584 |
| 2002-11-14 | 11201.925 |
| 2002-11-15 | 11270.105 |
| 2002-11-18 | 11158.455 |
| 2002-11-19 | 11104.888 |
| 2002-11-20 | 11316.543 |
| 2002-11-21 | 11556.346 |
| 2002-11-22 | 11531.479 |
| 2002-11-25 | 11571.694 |
| 2002-11-26 | 11337.838 |
| 2002-11-27 | 11649.195 |
| 2002-11-29 | 11614.954 |
| 2002-12-02 | 11633.426 |
| 2002-12-03 | 11455.646 |
| 2002-12-04 | 11409.817 |
| 2002-12-05 | 11287.091 |
| 2002-12-06 | 11354.381 |
| 2002-12-09 | 11103.126 |
| 2002-12-10 | 11259.432 |
| 2002-12-11 | 11266.945 |
| 2002-12-12 | 11239.366 |
| 2002-12-13 | 11087.179 |
| 2002-12-16 | 11331.012 |
| 2002-12-17 | 11242.998 |
| 2002-12-18 | 11094.034 |
| 2002-12-19 | 11016.427 |
| 2002-12-20 | 11151.877 |
| 2002-12-23 | 11177.865 |
| 2002-12-24 | 11121.232 |
| 2002-12-26 | 11099.876 |
| 2002-12-27 | 10928.439 |
| 2002-12-30 | 10965.361 |
| 2002-12-31 | 10978.098 |
| 2003-01-02 | 11267.814 |
| 2003-01-03 | 11257.307 |
| 2003-01-06 | 11491.801 |
| 2003-01-07 | 11415.139 |
| 2003-01-08 | 11260.989 |
| 2003-01-09 | 11470.527 |
| 2003-01-10 | 11473.736 |
| 2003-01-13 | 11456.994 |
| 2003-01-14 | 11519.246 |
| 2003-01-15 | 11370.978 |
| 2003-01-16 | 11332.961 |
| 2003-01-17 | 11174.907 |
| 2003-01-21 | 11004.814 |
| 2003-01-22 | 10901.898 |
| 2003-01-23 | 11011.626 |
| 2003-01-24 | 10710.412 |
| 2003-01-27 | 10535.184 |
| 2003-01-28 | 10666.946 |
| 2003-01-29 | 10734.543 |
| 2003-01-30 | 10507.962 |
| 2003-01-31 | 10644.021 |
| 2003-02-03 | 10601.298 |
| 2003-02-04 | 10464.459 |
| 2003-02-05 | 10413.122 |
| 2003-02-06 | 10345.69 |
| 2003-02-07 | 10235.489 |
| 2003-02-10 | 10307.912 |
| 2003-02-11 | 10235.294 |
| 2003-02-12 | 10104.149 |
| 2003-02-13 | 10077.72 |
| 2003-02-14 | 10266.065 |
| 2003-02-18 | 10467.267 |
| 2003-02-19 | 10394.48 |
| 2003-02-20 | 10311.136 |
| 2003-02-21 | 10446.805 |
| 2003-02-24 | 10263.621 |
| 2003-02-25 | 10334.25 |
| 2003-02-26 | 10208.215 |
| 2003-02-27 | 10321.692 |
| 2003-02-28 | 10364.424 |
| 2003-03-03 | 10235.036 |
| 2003-03-04 | 10088.547 |
| 2003-03-05 | 10163.807 |
| 2003-03-06 | 10079.036 |
| 2003-03-07 | 10153.56 |
| 2003-03-10 | 9914.392 |
| 2003-03-11 | 9834.57 |
| 2003-03-12 | 9861.203 |
| 2003-03-13 | 10191.242 |
| 2003-03-14 | 10204.022 |
| 2003-03-17 | 10548.779 |
| 2003-03-18 | 10596.773 |
| 2003-03-19 | 10671.878 |
| 2003-03-20 | 10705.696 |
| 2003-03-21 | 10936.659 |
| 2003-03-24 | 10571.122 |
| 2003-03-25 | 10698.821 |
| 2003-03-26 | 10638.81 |
| 2003-03-27 | 10627.451 |
| 2003-03-28 | 10577.751 |
| 2003-03-31 | 10404.953 |
| 2003-04-01 | 10544.825 |
| 2003-04-02 | 10812.098 |
| 2003-04-03 | 10760.037 |
| 2003-04-04 | 10774.853 |
| 2003-04-07 | 10796.273 |
| 2003-04-08 | 10766.746 |
| 2003-04-09 | 10632.474 |
| 2003-04-10 | 10689.845 |
| 2003-04-11 | 10655.112 |
| 2003-04-14 | 10854.214 |
| 2003-04-15 | 10920.067 |
| 2003-04-16 | 10801.013 |
| 2003-04-17 | 10965.006 |
| 2003-04-21 | 10955.798 |
| 2003-04-22 | 11180.425 |
| 2003-04-23 | 11275.301 |
| 2003-04-24 | 11184.919 |
| 2003-04-25 | 11041.491 |
| 2003-04-28 | 11230.453 |
| 2003-04-29 | 11267.634 |
| 2003-04-30 | 11269.525 |
| 2003-05-01 | 11283.318 |
| 2003-05-02 | 11459.292 |
| 2003-05-05 | 11437.785 |
| 2003-05-06 | 11530.52 |
| 2003-05-07 | 11478.101 |
| 2003-05-08 | 11367.932 |
| 2003-05-09 | 11523.217 |
| 2003-05-12 | 11666.801 |
| 2003-05-13 | 11640.222 |
| 2003-05-14 | 11611.36 |
| 2003-05-15 | 11695.715 |
| 2003-05-16 | 11661.405 |
| 2003-05-19 | 11392.877 |
| 2003-05-20 | 11380.035 |
| 2003-05-21 | 11428.03 |
| 2003-05-22 | 11535.527 |
| 2003-05-23 | 11565.881 |
| 2003-05-27 | 11787.399 |
| 2003-05-28 | 11809.256 |
| 2003-05-29 | 11775.867 |
| 2003-05-30 | 11958.483 |
| 2003-06-02 | 11992.214 |
| 2003-06-03 | 12037.657 |
| 2003-06-04 | 12220.903 |
| 2003-06-05 | 12284.836 |
| 2003-06-06 | 12248.217 |
| 2003-06-09 | 12089.306 |
| 2003-06-10 | 12204.149 |
| 2003-06-11 | 12358.875 |
| 2003-06-12 | 12377.806 |
| 2003-06-13 | 12250.446 |
| 2003-06-16 | 12509.08 |
| 2003-06-17 | 12520.275 |
| 2003-06-18 | 12499.439 |
| 2003-06-19 | 12317.139 |
| 2003-06-20 | 12325.25 |
| 2003-06-23 | 12141.33 |
| 2003-06-24 | 12164.524 |
| 2003-06-25 | 12093.569 |
| 2003-06-26 | 12225.386 |
| 2003-06-27 | 12126.325 |
| 2003-06-30 | 12105.528 |
| 2003-07-01 | 12179.589 |
| 2003-07-02 | 12335.584 |
| 2003-07-03 | 12247.802 |
| 2003-07-07 | 12477.639 |
| 2003-07-08 | 12538.616 |
| 2003-07-09 | 12494.078 |
| 2003-07-10 | 12326.175 |
| 2003-07-11 | 12439.909 |
| 2003-07-14 | 12524.844 |
| 2003-07-15 | 12478.921 |
| 2003-07-16 | 12398.995 |
| 2003-07-17 | 12222.963 |
| 2003-07-18 | 12356.721 |
| 2003-07-21 | 12184.43 |
| 2003-07-22 | 12300.831 |
| 2003-07-23 | 12316.363 |
| 2003-07-24 | 12241.472 |
| 2003-07-25 | 12424.933 |
| 2003-07-28 | 12421.115 |
| 2003-07-29 | 12350.845 |
| 2003-07-30 | 12332.349 |
| 2003-07-31 | 12367.762 |
| 2003-08-01 | 12190.591 |
| 2003-08-04 | 12203.537 |
| 2003-08-05 | 11999.896 |
| 2003-08-06 | 12001.52 |
| 2003-08-07 | 12072.246 |
| 2003-08-08 | 12111.381 |
| 2003-08-11 | 12161.218 |
| 2003-08-12 | 12288.937 |
| 2003-08-13 | 12225.548 |
| 2003-08-14 | 12302.321 |
| 2003-08-15 | 12310.961 |
| 2003-08-18 | 12434.412 |
| 2003-08-19 | 12486.067 |
| 2003-08-20 | 12470.594 |
| 2003-08-21 | 12527.265 |
| 2003-08-22 | 12394.723 |
| 2003-08-25 | 12364.047 |
| 2003-08-26 | 12426.366 |
| 2003-08-27 | 12445.295 |
| 2003-08-28 | 12533.222 |
| 2003-08-29 | 12598.571 |
| 2003-09-02 | 12731.111 |
| 2003-09-03 | 12784.72 |
| 2003-09-04 | 12810.515 |
| 2003-09-05 | 12732.718 |
| 2003-09-08 | 12866.192 |
| 2003-09-09 | 12766.34 |
| 2003-09-10 | 12588.447 |
| 2003-09-11 | 12663.853 |
| 2003-09-12 | 12694.957 |
| 2003-09-15 | 12650.756 |
| 2003-09-16 | 12825.719 |
| 2003-09-17 | 12790.683 |
| 2003-09-18 | 12950.544 |
| 2003-09-19 | 12922.14 |
| 2003-09-22 | 12759.863 |
| 2003-09-23 | 12844.266 |
| 2003-09-24 | 12605.387 |
| 2003-09-25 | 12501.01 |
| 2003-09-26 | 12398.253 |
| 2003-09-29 | 12522.307 |
| 2003-09-30 | 12402.392 |
| 2003-10-01 | 12685.843 |
| 2003-10-02 | 12721.612 |
| 2003-10-03 | 12854.06 |
| 2003-10-06 | 12918.367 |
| 2003-10-07 | 12983.343 |
| 2003-10-08 | 12916.18 |
| 2003-10-09 | 12986.096 |
| 2003-10-10 | 12976.318 |
| 2003-10-13 | 13082.39 |
| 2003-10-14 | 13138.205 |
| 2003-10-15 | 13091.473 |
| 2003-10-16 | 13137.819 |
| 2003-10-17 | 12993.122 |
| 2003-10-20 | 13046.981 |
| 2003-10-21 | 13078.53 |
| 2003-10-22 | 12875.959 |
| 2003-10-23 | 12904.111 |
| 2003-10-24 | 12845.311 |
| 2003-10-27 | 12901.563 |
| 2003-10-28 | 13099.682 |
| 2003-10-29 | 13133.277 |
| 2003-10-30 | 13118.107 |
| 2003-10-31 | 13155.42 |
| 2003-11-03 | 13310.642 |
| 2003-11-04 | 13251.631 |
| 2003-11-05 | 13240.845 |
| 2003-11-06 | 13319.802 |
| 2003-11-07 | 13275.24 |
| 2003-11-10 | 13178.712 |
| 2003-11-11 | 13152.432 |
| 2003-11-12 | 13323.259 |
| 2003-11-13 | 13327.027 |
| 2003-11-14 | 13217.055 |
| 2003-11-17 | 13123.855 |
| 2003-11-18 | 13008.284 |
| 2003-11-19 | 13102.645 |
| 2003-11-20 | 13001.808 |
| 2003-11-21 | 13028.978 |
| 2003-11-24 | 13251.966 |
| 2003-11-25 | 13289.69 |
| 2003-11-26 | 13346.018 |
| 2003-11-28 | 13355.823 |
| 2003-12-01 | 13523.803 |
| 2003-12-02 | 13485.857 |
| 2003-12-03 | 13435.048 |
| 2003-12-04 | 13473.304 |
| 2003-12-05 | 13370.807 |
| 2003-12-08 | 13464.521 |
| 2003-12-09 | 13337.356 |
| 2003-12-10 | 13297.318 |
| 2003-12-11 | 13471.47 |
| 2003-12-12 | 13515.305 |
| 2003-12-15 | 13412.885 |
| 2003-12-16 | 13485.496 |
| 2003-12-17 | 13503.577 |
| 2003-12-18 | 13668.146 |
| 2003-12-19 | 13663.754 |
| 2003-12-22 | 13715.61 |
| 2003-12-23 | 13764.133 |
| 2003-12-24 | 13740.459 |
| 2003-12-26 | 13767.103 |
| 2003-12-29 | 13939.085 |
| 2003-12-30 | 13947.919 |
| 2003-12-31 | 13948.165 |
| 2004-01-02 | 13852.402 |
| 2004-01-05 | 14017.532 |
| 2004-01-06 | 14041.721 |
| 2004-01-07 | 14082.773 |
| 2004-01-08 | 14150.275 |
| 2004-01-09 | 14046.657 |
| 2004-01-12 | 14124.081 |
| 2004-01-13 | 14055.499 |
| 2004-01-14 | 14167.446 |
| 2004-01-15 | 14185.182 |
| 2004-01-16 | 14287.052 |
| 2004-01-20 | 14306.691 |
| 2004-01-21 | 14398.305 |
| 2004-01-22 | 14349.696 |
| 2004-01-23 | 14339.427 |
| 2004-01-25 | 14500.098 |
| 2004-01-27 | 14365.942 |
| 2004-01-28 | 14159.708 |
| 2004-01-29 | 14196.673 |
| 2004-01-30 | 14175.44 |
| 2004-02-02 | 14139.885 |
| 2004-02-03 | 14139.169 |
| 2004-02-04 | 13997.501 |
| 2004-02-05 | 14028.795 |
| 2004-02-06 | 14227.415 |
| 2004-02-09 | 14211.218 |
| 2004-02-10 | 14293.953 |
| 2004-02-11 | 14437.079 |
| 2004-02-12 | 14367.51 |
| 2004-02-13 | 14284.417 |
| 2004-02-17 | 14425.113 |
| 2004-02-18 | 14365.311 |
| 2004-02-19 | 14288.15 |
| 2004-02-20 | 14245.529 |
| 2004-02-23 | 14177.085 |
| 2004-02-24 | 14158.473 |
| 2004-02-25 | 14232.796 |
| 2004-02-26 | 14269.255 |
| 2004-02-27 | 14282.998 |
| 2004-03-01 | 14339.628 |
| 2004-03-02 | 14258.286 |
| 2004-03-03 | 14274.645 |
| 2004-03-04 | 14338.218 |
| 2004-03-05 | 14371.306 |
| 2004-03-08 | 14252.163 |
| 2004-03-09 | 14159.034 |
| 2004-03-10 | 13945.771 |
| 2004-03-11 | 13745.185 |
| 2004-03-12 | 13931.52 |
| 2004-03-15 | 13716.124 |
| 2004-03-16 | 13774.221 |
| 2004-03-17 | 13947.651 |
| 2004-03-18 | 13921.841 |
| 2004-03-19 | 13785.183 |
| 2004-03-22 | 13595.685 |
| 2004-03-23 | 13582.45 |
| 2004-03-24 | 13543.278 |
| 2004-03-25 | 13772.342 |
| 2004-03-26 | 13768.937 |
| 2004-03-29 | 13949.734 |
| 2004-03-30 | 14019.01 |
| 2004-03-31 | 14022.007 |
| 2004-04-01 | 14063.353 |
| 2004-04-02 | 14183.634 |
| 2004-04-05 | 14281.721 |
| 2004-04-06 | 14230.962 |
| 2004-04-07 | 14161.806 |
| 2004-04-08 | 14137.598 |
| 2004-04-12 | 14196.827 |
| 2004-04-13 | 13985.6 |
| 2004-04-14 | 13956.365 |
| 2004-04-15 | 13957.733 |
| 2004-04-16 | 14026.23 |
| 2004-04-19 | 14056.465 |
| 2004-04-20 | 13840.097 |
| 2004-04-21 | 13920.205 |
| 2004-04-22 | 14123.012 |
| 2004-04-23 | 14117.796 |
| 2004-04-26 | 14066.239 |
| 2004-04-27 | 14091.106 |
| 2004-04-28 | 13886.121 |
| 2004-04-29 | 13759.078 |
| 2004-04-30 | 13666.094 |
| 2004-05-03 | 13708.106 |
| 2004-05-04 | 13737.875 |
| 2004-05-05 | 13768.224 |
| 2004-05-06 | 13659.656 |
| 2004-05-07 | 13451.131 |
| 2004-05-10 | 13278.492 |
| 2004-05-11 | 13403.524 |
| 2004-05-12 | 13415.646 |
| 2004-05-13 | 13406.533 |
| 2004-05-14 | 13386.531 |
| 2004-05-17 | 13239.408 |
| 2004-05-18 | 13340.637 |
| 2004-05-19 | 13309.155 |
| 2004-05-20 | 13316.305 |
| 2004-05-21 | 13374.422 |
| 2004-05-24 | 13418.088 |
| 2004-05-25 | 13643.884 |
| 2004-05-26 | 13681.546 |
| 2004-05-27 | 13749.116 |
| 2004-05-28 | 13753.635 |
| 2004-06-01 | 13727.349 |
| 2004-06-02 | 13768.205 |
| 2004-06-03 | 13645.513 |
| 2004-06-04 | 13722.631 |
| 2004-06-07 | 13940.511 |
| 2004-06-08 | 13951.967 |
| 2004-06-09 | 13810.428 |
| 2004-06-10 | 13860.193 |
| 2004-06-14 | 13709.808 |
| 2004-06-15 | 13810.24 |
| 2004-06-16 | 13833.365 |
| 2004-06-17 | 13817.994 |
| 2004-06-18 | 13845.374 |
| 2004-06-21 | 13791.079 |
| 2004-06-22 | 13842.852 |
| 2004-06-23 | 13968.58 |
| 2004-06-24 | 13933.296 |
| 2004-06-25 | 13894.887 |
| 2004-06-28 | 13872.364 |
| 2004-06-29 | 13908.527 |
| 2004-06-30 | 13976.837 |
| 2004-07-01 | 13854.749 |
| 2004-07-02 | 13821.319 |
| 2004-07-06 | 13693.808 |
| 2004-07-07 | 13716.279 |
| 2004-07-08 | 13583.288 |
| 2004-07-09 | 13626.684 |
| 2004-07-12 | 13634.652 |
| 2004-07-13 | 13641.778 |
| 2004-07-14 | 13600.091 |
| 2004-07-15 | 13563.62 |
| 2004-07-16 | 13489.056 |
| 2004-07-19 | 13478.763 |
| 2004-07-20 | 13589.471 |
| 2004-07-21 | 13385.788 |
| 2004-07-22 | 13401.434 |
| 2004-07-23 | 13263.655 |
| 2004-07-26 | 13210.494 |
| 2004-07-27 | 13355.701 |
| 2004-07-28 | 13345.76 |
| 2004-07-29 | 13429.422 |
| 2004-07-30 | 13449.443 |
| 2004-08-02 | 13496.056 |
| 2004-08-03 | 13399.424 |
| 2004-08-04 | 13372.18 |
| 2004-08-05 | 13154.221 |
| 2004-08-06 | 12947.681 |
| 2004-08-09 | 12952.655 |
| 2004-08-10 | 13129.689 |
| 2004-08-11 | 13084.897 |
| 2004-08-12 | 12929.693 |
| 2004-08-13 | 12943.686 |
| 2004-08-16 | 13126.373 |
| 2004-08-17 | 13165.363 |
| 2004-08-18 | 13339.37 |
| 2004-08-19 | 13286.2 |
| 2004-08-20 | 13396.724 |
| 2004-08-23 | 13354.644 |
| 2004-08-24 | 13362.859 |
| 2004-08-25 | 13470.03 |
| 2004-08-26 | 13467.442 |
| 2004-08-27 | 13509.383 |
| 2004-08-30 | 13397.465 |
| 2004-08-31 | 13464.327 |
| 2004-09-01 | 13473.219 |
| 2004-09-02 | 13619.359 |
| 2004-09-03 | 13563.48 |
| 2004-09-07 | 13662.854 |
| 2004-09-08 | 13596.408 |
| 2004-09-09 | 13637.584 |
| 2004-09-10 | 13708.944 |
| 2004-09-13 | 13744.792 |
| 2004-09-14 | 13765.913 |
| 2004-09-15 | 13678.76 |
| 2004-09-16 | 13733.499 |
| 2004-09-17 | 13779.977 |
| 2004-09-20 | 13709.056 |
| 2004-09-21 | 13800.809 |
| 2004-09-22 | 13614.558 |
| 2004-09-23 | 13563.505 |
| 2004-09-24 | 13585.315 |
| 2004-09-27 | 13493.186 |
| 2004-09-28 | 13579.199 |
| 2004-09-29 | 13644.967 |
| 2004-09-30 | 13656.988 |
| 2004-10-01 | 13788.965 |
| 2004-10-04 | 13840.274 |
| 2004-10-05 | 13827.743 |
| 2004-10-06 | 13920.611 |
| 2004-10-07 | 13775.524 |
| 2004-10-08 | 13671.533 |
| 2004-10-11 | 13698.254 |
| 2004-10-12 | 13669.588 |
| 2004-10-13 | 13567.405 |
| 2004-10-14 | 13452.031 |
| 2004-10-15 | 13514.612 |
| 2004-10-18 | 13584.687 |
| 2004-10-19 | 13462.405 |
| 2004-10-20 | 13475.909 |
| 2004-10-21 | 13531.059 |
| 2004-10-22 | 13401.607 |
| 2004-10-25 | 13401.569 |
| 2004-10-26 | 13583.328 |
| 2004-10-27 | 13760.474 |
| 2004-10-28 | 13777.169 |
| 2004-10-29 | 13801.746 |
| 2004-11-01 | 13807.181 |
| 2004-11-02 | 13802.333 |
| 2004-11-03 | 13963.808 |
| 2004-11-04 | 14171.194 |
| 2004-11-05 | 14219.037 |
| 2004-11-08 | 14201.204 |
| 2004-11-09 | 14203.945 |
| 2004-11-10 | 14205.889 |
| 2004-11-11 | 14337.218 |
| 2004-11-12 | 14468.384 |
| 2004-11-15 | 14474.815 |
| 2004-11-16 | 14375.764 |
| 2004-11-17 | 14457.43 |
| 2004-11-18 | 14466.988 |
| 2004-11-19 | 14307.57 |
| 2004-11-22 | 14395.666 |
| 2004-11-23 | 14410.135 |
| 2004-11-24 | 14482.778 |
| 2004-11-26 | 14500.749 |
| 2004-11-29 | 14468.546 |
| 2004-11-30 | 14417.126 |
| 2004-12-01 | 14679.083 |
| 2004-12-02 | 14665.049 |
| 2004-12-03 | 14678.708 |
| 2004-12-06 | 14662.047 |
| 2004-12-07 | 14487.12 |
| 2004-12-08 | 14555.802 |
| 2004-12-09 | 14623.822 |
| 2004-12-10 | 14624.56 |
| 2004-12-13 | 14747.528 |
| 2004-12-14 | 14816.248 |
| 2004-12-15 | 14863.604 |
| 2004-12-16 | 14818.512 |
| 2004-12-17 | 14738.697 |
| 2004-12-20 | 14725.413 |
| 2004-12-21 | 14861.24 |
| 2004-12-22 | 14915.888 |
| 2004-12-23 | 14927.045 |
| 2004-12-27 | 14861.452 |
| 2004-12-28 | 14986.572 |
| 2004-12-29 | 14987.297 |
| 2004-12-30 | 14994.602 |
| 2004-12-31 | 14973.738 |
| 2005-01-03 | 14797.602 |
| 2005-01-04 | 14604.606 |
| 2005-01-05 | 14519.741 |
| 2005-01-06 | 14570.218 |
| 2005-01-07 | 14540.099 |
| 2005-01-10 | 14599.938 |
| 2005-01-11 | 14501.156 |
| 2005-01-12 | 14551.058 |
| 2005-01-13 | 14448.057 |
| 2005-01-14 | 14544.905 |
| 2005-01-18 | 14687.374 |
| 2005-01-19 | 14551.221 |
| 2005-01-20 | 14440.468 |
| 2005-01-21 | 14363.355 |
| 2005-01-24 | 14290.934 |
| 2005-01-25 | 14334.134 |
| 2005-01-25 | 14425.19 |
| 2005-01-27 | 14433.304 |
| 2005-01-28 | 14393.262 |
| 2005-01-31 | 14532.211 |
| 2005-02-01 | 14546.921 |
| 2005-02-02 | 14604.654 |
| 2005-02-03 | 14563.923 |
| 2005-02-04 | 14726.04 |
| 2005-02-07 | 14707.362 |
| 2005-02-08 | 14717.663 |
| 2005-02-09 | 14575.043 |
| 2005-02-10 | 14628.407 |
| 2005-02-11 | 14737.916 |
| 2005-02-14 | 14751.245 |
| 2005-02-15 | 14794.756 |
| 2005-02-16 | 14810.368 |
| 2005-02-17 | 14695.572 |
| 2005-02-18 | 14696.007 |
| 2005-02-22 | 14476.417 |
| 2005-02-23 | 14551.6 |
| 2005-02-24 | 14666.631 |
| 2005-02-25 | 14810.604 |
| 2005-02-28 | 14723.024 |
| 2005-03-01 | 14692.842 |
| 2005-03-02 | 14688.52 |
| 2005-03-03 | 14691.98 |
| 2005-03-04 | 14826.511 |
| 2005-03-07 | 14867.554 |
| 2005-03-08 | 14787.193 |
| 2005-03-09 | 14636.924 |
| 2005-03-10 | 14642.81 |
| 2005-03-11 | 14557.129 |
| 2005-03-14 | 14647.452 |
| 2005-03-15 | 14551.526 |
| 2005-03-16 | 14431.057 |
| 2005-03-17 | 14463.209 |
| 2005-03-18 | 14444.11 |
| 2005-03-21 | 14387.293 |
| 2005-03-22 | 14256.825 |
| 2005-03-23 | 14234.512 |
| 2005-03-24 | 14237.148 |
| 2005-03-28 | 14258.882 |
| 2005-03-29 | 14136.332 |
| 2005-03-30 | 14326.843 |
| 2005-03-31 | 14331.449 |
| 2005-04-01 | 14150.662 |
| 2005-04-04 | 14187.626 |
| 2005-04-05 | 14245.458 |
| 2005-04-06 | 14276.331 |
| 2005-04-07 | 14356.731 |
| 2005-04-08 | 14231.208 |
| 2005-04-11 | 14222.046 |
| 2005-04-12 | 14302.691 |
| 2005-04-13 | 14129.978 |
| 2005-04-14 | 13977.166 |
| 2005-04-15 | 13756.846 |
| 2005-04-18 | 13800.122 |
| 2005-04-19 | 13905.096 |
| 2005-04-20 | 13721.411 |
| 2005-04-21 | 13981.545 |
| 2005-04-22 | 13867.581 |
| 2005-04-25 | 14002.082 |
| 2005-04-26 | 13880.045 |
| 2005-04-27 | 13919.272 |
| 2005-04-28 | 13755.146 |
| 2005-04-29 | 13899.64 |
| 2005-05-02 | 13986.084 |
| 2005-05-03 | 13978.579 |
| 2005-05-04 | 14157.384 |
| 2005-05-05 | 14132.821 |
| 2005-05-06 | 14128.377 |
| 2005-05-09 | 14218.777 |
| 2005-05-10 | 14076.02 |
| 2005-05-11 | 14127.103 |
| 2005-05-12 | 13980.379 |
| 2005-05-13 | 13910.157 |
| 2005-05-16 | 14053.931 |
| 2005-05-17 | 14147.686 |
| 2005-05-18 | 14308.773 |
| 2005-05-19 | 14378.15 |
| 2005-05-20 | 14362.195 |
| 2005-05-23 | 14426.307 |
| 2005-05-24 | 14431.364 |
| 2005-05-25 | 14368.146 |
| 2005-05-26 | 14470.203 |
| 2005-05-27 | 14497.79 |
| 2005-05-31 | 14433.458 |
| 2005-06-01 | 14556.471 |
| 2005-06-02 | 14590.615 |
| 2005-06-03 | 14494.729 |
| 2005-06-06 | 14520.393 |
| 2005-06-07 | 14518.973 |
| 2005-06-08 | 14478.955 |
| 2005-06-09 | 14563.251 |
| 2005-06-10 | 14533.94 |
| 2005-06-13 | 14572.49 |
| 2005-06-14 | 14620.366 |
| 2005-06-15 | 14653.115 |
| 2005-06-16 | 14722.407 |
| 2005-06-17 | 14778.849 |
| 2005-06-20 | 14769.768 |
| 2005-06-21 | 14740.691 |
| 2005-06-22 | 14750.604 |
| 2005-06-23 | 14596.893 |
| 2005-06-24 | 14494.656 |
| 2005-06-27 | 14486.603 |
| 2005-06-28 | 14632.322 |
| 2005-06-29 | 14621.271 |
| 2005-06-30 | 14534.87 |
| 2005-07-01 | 14516.017 |
| 2005-07-05 | 14652.453 |
| 2005-07-06 | 14544.254 |
| 2005-07-07 | 14583.175 |
| 2005-07-08 | 14758.836 |
| 2005-07-11 | 14862.843 |
| 2005-07-12 | 14894.248 |
| 2005-07-13 | 14894.613 |
| 2005-07-14 | 14908.525 |
| 2005-07-15 | 14928.344 |
| 2005-07-18 | 14851.466 |
| 2005-07-19 | 14967.813 |
| 2005-07-20 | 15049.528 |
| 2005-07-21 | 14938.431 |
| 2005-07-22 | 15028.905 |
| 2005-07-25 | 14963.221 |
| 2005-07-26 | 14997.476 |
| 2005-07-27 | 15058.348 |
| 2005-07-28 | 15156.959 |
| 2005-07-29 | 15057.605 |
| 2005-08-01 | 15005.055 |
| 2005-08-02 | 15113.102 |
| 2005-08-03 | 15108.218 |
| 2005-08-04 | 14984.851 |
| 2005-08-05 | 14856.782 |
| 2005-08-08 | 14801.917 |
| 2005-08-09 | 14884.209 |
| 2005-08-10 | 14864.224 |
| 2005-08-11 | 14969.641 |
| 2005-08-12 | 14887.591 |
| 2005-08-15 | 14931.04 |
| 2005-08-16 | 14755.619 |
| 2005-08-17 | 14757.619 |
| 2005-08-18 | 14735.549 |
| 2005-08-19 | 14747.148 |
| 2005-08-22 | 14777.762 |
| 2005-08-23 | 14736.725 |
| 2005-08-24 | 14660.443 |
| 2005-08-25 | 14693.142 |
| 2005-08-26 | 14595.045 |
| 2005-08-29 | 14686.864 |
| 2005-08-30 | 14643.742 |
| 2005-08-31 | 14806.801 |
| 2005-09-01 | 14648.018 |
| 2005-09-02 | 14595.06 |
| 2005-09-06 | 14775.702 |
| 2005-09-07 | 14817.083 |
| 2005-09-08 | 14759.562 |
| 2005-09-09 | 14868.616 |
| 2005-09-12 | 14868.293 |
| 2005-09-13 | 14753.983 |
| 2005-09-14 | 14692.212 |
| 2005-09-15 | 14693.026 |
| 2005-09-16 | 14794.333 |
| 2005-09-19 | 14718.027 |
| 2005-09-20 | 14604.591 |
| 2005-09-21 | 14454.157 |
| 2005-09-22 | 14496.052 |
| 2005-09-23 | 14520.035 |
| 2005-09-26 | 14542.425 |
| 2005-09-27 | 14539.144 |
| 2005-09-28 | 14543.886 |
| 2005-09-29 | 14678.814 |
| 2005-09-30 | 14714.411 |
| 2005-10-03 | 14684.852 |
| 2005-10-04 | 14540.085 |
| 2005-10-05 | 14301.158 |
| 2005-10-06 | 14224.635 |
| 2005-10-07 | 14284.059 |
| 2005-10-10 | 14180.769 |
| 2005-10-11 | 14136.329 |
| 2005-10-12 | 14021.603 |
| 2005-10-13 | 14007.993 |
| 2005-10-14 | 14142.782 |
| 2005-10-17 | 14186.875 |
| 2005-10-18 | 14039.599 |
| 2005-10-19 | 14242.989 |
| 2005-10-20 | 14039.217 |
| 2005-10-21 | 14091.352 |
| 2005-10-24 | 14333.409 |
| 2005-10-25 | 14295.112 |
| 2005-10-26 | 14230.215 |
| 2005-10-27 | 14052.301 |
| 2005-10-28 | 14276.316 |
| 2005-10-31 | 14414.785 |
| 2005-11-01 | 14492.33 |
| 2005-11-02 | 14657.867 |
| 2005-11-03 | 14718.254 |
| 2005-11-04 | 14719.856 |
| 2005-11-07 | 14758.994 |
| 2005-11-08 | 14701.498 |
| 2005-11-09 | 14728.782 |
| 2005-11-10 | 14846.798 |
| 2005-11-11 | 14892.429 |
| 2005-11-14 | 14881.527 |
| 2005-11-15 | 14808.997 |
| 2005-11-16 | 14826.705 |
| 2005-11-17 | 14988.195 |
| 2005-11-18 | 15051.739 |
| 2005-11-21 | 15142.482 |
| 2005-11-22 | 15222.347 |
| 2005-11-23 | 15273.098 |
| 2005-11-25 | 15301.454 |
| 2005-11-28 | 15146.361 |
| 2005-11-29 | 15148.698 |
| 2005-11-30 | 15084.034 |
| 2005-12-01 | 15342.719 |
| 2005-12-02 | 15351.984 |
| 2005-12-05 | 15303.373 |
| 2005-12-06 | 15321.516 |
| 2005-12-07 | 15247.264 |
| 2005-12-08 | 15246.708 |
| 2005-12-09 | 15289.162 |
| 2005-12-12 | 15306.675 |
| 2005-12-13 | 15372.327 |
| 2005-12-14 | 15427.965 |
| 2005-12-15 | 15390.349 |
| 2005-12-16 | 15347.085 |
| 2005-12-19 | 15234.335 |
| 2005-12-20 | 15237.818 |
| 2005-12-21 | 15290.988 |
| 2005-12-22 | 15361.067 |
| 2005-12-23 | 15374.879 |
| 2005-12-27 | 15223.219 |
| 2005-12-28 | 15252.901 |
| 2005-12-29 | 15211.62 |
| 2005-12-30 | 15140.235 |
| 2006-01-03 | 15261.208 |
| 2006-01-04 | 15332.761 |
| 2006-01-05 | 15340.36 |
| 2006-01-06 | 15486.647 |
| 2006-01-09 | 15560.241 |
| 2006-01-10 | 15574.37 |
| 2006-01-11 | 15618.135 |
| 2006-01-12 | 15518.889 |
| 2006-01-13 | 15538.119 |
| 2006-01-17 | 15480.946 |
| 2006-01-18 | 15426.149 |
| 2006-01-19 | 15531.721 |
| 2006-01-20 | 15262.589 |
| 2006-01-23 | 15297.759 |
| 2006-01-24 | 15366.888 |
| 2006-01-25 | 15331.345 |
| 2006-01-25 | 15453.686 |
| 2006-01-27 | 15560.733 |
| 2006-01-30 | 15579.963 |
| 2006-01-31 | 15548.994 |
| 2006-02-01 | 15532.271 |
| 2006-02-02 | 15395.946 |
| 2006-02-03 | 15318.451 |
| 2006-02-06 | 15342.158 |
| 2006-02-07 | 15196.872 |
| 2006-02-08 | 15306.028 |
| 2006-02-09 | 15277.038 |
| 2006-02-10 | 15303.141 |
| 2006-02-13 | 15231.696 |
| 2006-02-14 | 15377.725 |
| 2006-02-15 | 15438.784 |
| 2006-02-16 | 15558.375 |
| 2006-02-17 | 15539.172 |
| 2006-02-21 | 15488.008 |
| 2006-02-22 | 15600.794 |
| 2006-02-23 | 15556.578 |
| 2006-02-24 | 15585.915 |
| 2006-02-27 | 15645.01 |
| 2006-02-28 | 15480.125 |
| 2006-03-01 | 15532.404 |
| 2006-03-02 | 15514.856 |
| 2006-03-03 | 15492.875 |
| 2006-03-06 | 15383.081 |
| 2006-03-07 | 15317.962 |
| 2006-03-08 | 15337.202 |
| 2006-03-09 | 15268.45 |
| 2006-03-10 | 15376.731 |
| 2006-03-13 | 15407.944 |
| 2006-03-14 | 15567.299 |
| 2006-03-15 | 15643.188 |
| 2006-03-16 | 15666.633 |
| 2006-03-17 | 15698.442 |
| 2006-03-20 | 15681.847 |
| 2006-03-21 | 15575.65 |
| 2006-03-22 | 15672.852 |
| 2006-03-23 | 15649.526 |
| 2006-03-24 | 15686.183 |
| 2006-03-27 | 15675.771 |
| 2006-03-28 | 15592.865 |
| 2006-03-29 | 15731.645 |
| 2006-03-30 | 15706.115 |
| 2006-03-31 | 15672.685 |
| 2006-04-03 | 15547.937 |
| 2006-04-04 | 15632.435 |
| 2006-04-05 | 15702.143 |
| 2006-04-06 | 15678.978 |
| 2006-04-07 | 15521.251 |
| 2006-04-10 | 15518.499 |
| 2006-04-11 | 15388.037 |
| 2006-04-12 | 15415.774 |
| 2006-04-13 | 15433.93 |
| 2006-04-17 | 15397.156 |
| 2006-04-18 | 15666.232 |
| 2006-04-19 | 15726.431 |
| 2006-04-20 | 15729.927 |
| 2006-04-21 | 15723.737 |
| 2006-04-24 | 15678.092 |
| 2006-04-25 | 15610.888 |
| 2006-04-26 | 15641.188 |
| 2006-04-27 | 15674.572 |
| 2006-04-28 | 15688.7 |
| 2006-05-01 | 15553.028 |
| 2006-05-02 | 15638.296 |
| 2006-05-03 | 15590.96 |
| 2006-05-04 | 15655.199 |
| 2006-05-05 | 15818.518 |
| 2006-05-08 | 15816.061 |
| 2006-05-09 | 15817.942 |
| 2006-05-10 | 15786.886 |
| 2006-05-11 | 15571.083 |
| 2006-05-12 | 15373.535 |
| 2006-05-15 | 15379.577 |
| 2006-05-16 | 15358.7 |
| 2006-05-17 | 15105.024 |
| 2006-05-18 | 14998.974 |
| 2006-05-19 | 15059.781 |
| 2006-05-22 | 14978.921 |
| 2006-05-23 | 14916.104 |
| 2006-05-24 | 14923.121 |
| 2006-05-25 | 15110.584 |
| 2006-05-26 | 15202.587 |
| 2006-05-30 | 14956.834 |
| 2006-05-31 | 15094.915 |
| 2006-06-01 | 15261.037 |
| 2006-06-02 | 15292.852 |
| 2006-06-05 | 15006.394 |
| 2006-06-06 | 14964.008 |
| 2006-06-07 | 14873.793 |
| 2006-06-08 | 14874.662 |
| 2006-06-09 | 14815.899 |
| 2006-06-12 | 14595.043 |
| 2006-06-13 | 14426.063 |
| 2006-06-14 | 14494.058 |
| 2006-06-15 | 14835.232 |
| 2006-06-16 | 14775.683 |
| 2006-06-19 | 14629.932 |
| 2006-06-20 | 14616.699 |
| 2006-06-21 | 14784.341 |
| 2006-06-22 | 14711.477 |
| 2006-06-23 | 14722.915 |
| 2006-06-26 | 14801.551 |
| 2006-06-27 | 14658.662 |
| 2006-06-28 | 14727.303 |
| 2006-06-29 | 15069.943 |
| 2006-06-30 | 15074.073 |
| 2006-07-03 | 15141.696 |
| 2006-07-05 | 15013.954 |
| 2006-07-06 | 15044.472 |
| 2006-07-07 | 14925.585 |
| 2006-07-10 | 14937.866 |
| 2006-07-11 | 14998.608 |
| 2006-07-12 | 14829.214 |
| 2006-07-13 | 14618.683 |
| 2006-07-14 | 14533.003 |
| 2006-07-17 | 14499.363 |
| 2006-07-18 | 14525.658 |
| 2006-07-19 | 14812.125 |
| 2006-07-20 | 14644.965 |
| 2006-07-21 | 14512.475 |
| 2006-07-24 | 14770.648 |
| 2006-07-25 | 14878.248 |
| 2006-07-26 | 14862.761 |
| 2006-07-27 | 14777.935 |
| 2006-07-28 | 14970.349 |
| 2006-07-31 | 14959.892 |
| 2006-08-01 | 14843.667 |
| 2006-08-02 | 14934.969 |
| 2006-08-03 | 14973.119 |
| 2006-08-04 | 14956.145 |
| 2006-08-07 | 14904.219 |
| 2006-08-08 | 14837.842 |
| 2006-08-09 | 14759.264 |
| 2006-08-10 | 14829.273 |
| 2006-08-11 | 14757.233 |
| 2006-08-14 | 14776.273 |
| 2006-08-15 | 14991.715 |
| 2006-08-16 | 15128.242 |
| 2006-08-17 | 15152.594 |
| 2006-08-18 | 15201.005 |
| 2006-08-21 | 15136.647 |
| 2006-08-22 | 15152.092 |
| 2006-08-23 | 15066.662 |
| 2006-08-24 | 15092.625 |
| 2006-08-25 | 15084.511 |
| 2006-08-28 | 15171.914 |
| 2006-08-29 | 15220.174 |
| 2006-08-30 | 15238.899 |
| 2006-08-31 | 15249.09 |
| 2006-09-01 | 15401.486 |
| 2006-09-05 | 15441.337 |
| 2006-09-06 | 15265.882 |
| 2006-09-07 | 15191 |
| 2006-09-08 | 15241.844 |
| 2006-09-11 | 15236.506 |
| 2006-09-12 | 15418.578 |
| 2006-09-13 | 15490.246 |
| 2006-09-14 | 15462.513 |
| 2006-09-15 | 15501.215 |
| 2006-09-18 | 15512.007 |
| 2006-09-19 | 15470.607 |
| 2006-09-20 | 15555.461 |
| 2006-09-21 | 15469.129 |
| 2006-09-22 | 15412.337 |
| 2006-09-25 | 15544.562 |
| 2006-09-26 | 15657.149 |
| 2006-09-27 | 15675.591 |
| 2006-09-28 | 15701.681 |
| 2006-09-29 | 15656.75 |
| 2006-10-02 | 15675.391 |
| 2006-10-03 | 15694.688 |
| 2006-10-04 | 15893.771 |
| 2006-10-05 | 15965.121 |
| 2006-10-06 | 15917.68 |
| 2006-10-09 | 15951.403 |
| 2006-10-10 | 15990.481 |
| 2006-10-11 | 15940.186 |
| 2006-10-12 | 16109.674 |
| 2006-10-13 | 16155.334 |
| 2006-10-16 | 16215.856 |
| 2006-10-17 | 16148.61 |
| 2006-10-18 | 16161.751 |
| 2006-10-19 | 16185.4 |
| 2006-10-20 | 16180.576 |
| 2006-10-23 | 16274.255 |
| 2006-10-24 | 16279.586 |
| 2006-10-25 | 16341.548 |
| 2006-10-26 | 16447.282 |
| 2006-10-27 | 16301.726 |
| 2006-10-30 | 16318.075 |
| 2006-10-31 | 16311.929 |
| 2006-11-01 | 16194.625 |
| 2006-11-02 | 16181.725 |
| 2006-11-03 | 16164.278 |
| 2006-11-06 | 16353.131 |
| 2006-11-07 | 16386.373 |
| 2006-11-08 | 16436.873 |
| 2006-11-09 | 16346.599 |
| 2006-11-10 | 16392.209 |
| 2006-11-13 | 16436.424 |
| 2006-11-14 | 16559.031 |
| 2006-11-15 | 16618.214 |
| 2006-11-16 | 16645.573 |
| 2006-11-17 | 16654.043 |
| 2006-11-20 | 16660.812 |
| 2006-11-21 | 16699.05 |
| 2006-11-22 | 16744.235 |
| 2006-11-24 | 16699.085 |
| 2006-11-27 | 16442.284 |
| 2006-11-28 | 16492.323 |
| 2006-11-29 | 16650.085 |
| 2006-11-30 | 16676.003 |
| 2006-12-01 | 16605.222 |
| 2006-12-04 | 16770.334 |
| 2006-12-05 | 16834.453 |
| 2006-12-06 | 16817.61 |
| 2006-12-07 | 16749.444 |
| 2006-12-08 | 16775.264 |
| 2006-12-11 | 16805.72 |
| 2006-12-12 | 16775.429 |
| 2006-12-13 | 16790.586 |
| 2006-12-14 | 16923.473 |
| 2006-12-15 | 16934.502 |
| 2006-12-18 | 16854.777 |
| 2006-12-19 | 16881.269 |
| 2006-12-20 | 16867.941 |
| 2006-12-21 | 16802.405 |
| 2006-12-22 | 16723.105 |
| 2006-12-26 | 16797.793 |
| 2006-12-27 | 16922.671 |
| 2006-12-28 | 16896.71 |
| 2006-12-29 | 16817.338 |
| 2007-01-03 | 16753.412 |
| 2007-01-04 | 16780.682 |
| 2007-01-05 | 16657.09 |
| 2007-01-08 | 16695.132 |
| 2007-01-09 | 16704.022 |
| 2007-01-10 | 16748.52 |
| 2007-01-11 | 16875.158 |
| 2007-01-12 | 16964.248 |
| 2007-01-16 | 16971.88 |
| 2007-01-17 | 16953.97 |
| 2007-01-18 | 16875.911 |
| 2007-01-19 | 16940.482 |
| 2007-01-22 | 16851.063 |
| 2007-01-23 | 16923.76 |
| 2007-01-24 | 17072.259 |
| 2007-01-25 | 16885.071 |
| 2007-01-26 | 16880.638 |
| 2007-01-29 | 16885.988 |
| 2007-01-30 | 16979.159 |
| 2007-01-31 | 17088.804 |
| 2007-02-01 | 17095.482 |
| 2007-02-02 | 17127.146 |
| 2007-02-05 | 17108.01 |
| 2007-02-06 | 17132.362 |
| 2007-02-07 | 17173.243 |
| 2007-02-08 | 17156.505 |
| 2007-02-09 | 17026.084 |
| 2007-02-12 | 16963.88 |
| 2007-02-13 | 17091.435 |
| 2007-02-14 | 17209.141 |
| 2007-02-15 | 17231.775 |
| 2007-02-16 | 17233.822 |
| 2007-02-20 | 17307.383 |
| 2007-02-21 | 17295.195 |
| 2007-02-22 | 17286.528 |
| 2007-02-23 | 17229.353 |
| 2007-02-26 | 17198.742 |
| 2007-02-27 | 16613.359 |
| 2007-02-28 | 16693.377 |
| 2007-03-01 | 16501.502 |
| 2007-03-02 | 16297.61 |
| 2007-03-05 | 16107.998 |
| 2007-03-06 | 16373.22 |
| 2007-03-07 | 16335.989 |
| 2007-03-08 | 16453.004 |
| 2007-03-09 | 16475.12 |
| 2007-03-12 | 16525.971 |
| 2007-03-13 | 16188.512 |
| 2007-03-14 | 16281.359 |
| 2007-03-15 | 16357.445 |
| 2007-03-16 | 16290.945 |
| 2007-03-19 | 16470.321 |
| 2007-03-20 | 16578.249 |
| 2007-03-21 | 16850.298 |
| 2007-03-22 | 16854.355 |
| 2007-03-23 | 16872.924 |
| 2007-03-26 | 16881.258 |
| 2007-03-27 | 16778.258 |
| 2007-03-28 | 16656.038 |
| 2007-03-29 | 16706.901 |
| 2007-03-30 | 16702.311 |
| 2007-04-02 | 16639.321 |
| 2007-04-03 | 16792.457 |
| 2007-04-04 | 16808.522 |
| 2007-04-05 | 16860.669 |
| 2007-04-09 | 16869.537 |
| 2007-04-10 | 16912.655 |
| 2007-04-11 | 16806.173 |
| 2007-04-12 | 16909.039 |
| 2007-04-13 | 16971.297 |
| 2007-04-16 | 17150.103 |
| 2007-04-17 | 17172.25 |
| 2007-04-18 | 17170.084 |
| 2007-04-19 | 17131.896 |
| 2007-04-20 | 17286.24 |
| 2007-04-23 | 17256.251 |
| 2007-04-24 | 17243.145 |
| 2007-04-25 | 17401.982 |
| 2007-04-26 | 17399.241 |
| 2007-04-27 | 17381.644 |
| 2007-04-30 | 17219.951 |
| 2007-05-01 | 17151.421 |
| 2007-05-02 | 17286.846 |
| 2007-05-03 | 17351.736 |
| 2007-05-04 | 17392.063 |
| 2007-05-07 | 17424.731 |
| 2007-05-08 | 17402.307 |
| 2007-05-09 | 17467.038 |
| 2007-05-10 | 17222.974 |
| 2007-05-11 | 17392.566 |
| 2007-05-14 | 17342.671 |
| 2007-05-15 | 17293.885 |
| 2007-05-16 | 17426.185 |
| 2007-05-17 | 17406.772 |
| 2007-05-18 | 17519.017 |
| 2007-05-21 | 17577.292 |
| 2007-05-22 | 17596.636 |
| 2007-05-23 | 17568.363 |
| 2007-05-24 | 17377.869 |
| 2007-05-25 | 17478.061 |
| 2007-05-29 | 17531.265 |
| 2007-05-30 | 17675 |
| 2007-05-31 | 17698.923 |
| 2007-06-01 | 17745.243 |
| 2007-06-04 | 17786.966 |
| 2007-06-05 | 17689.972 |
| 2007-06-06 | 17528.727 |
| 2007-06-07 | 17216.805 |
| 2007-06-08 | 17402.967 |
| 2007-06-11 | 17417.761 |
| 2007-06-12 | 17234.57 |
| 2007-06-13 | 17476.597 |
| 2007-06-14 | 17562.909 |
| 2007-06-15 | 17687.23 |
| 2007-06-18 | 17667.249 |
| 2007-06-19 | 17696.769 |
| 2007-06-20 | 17469.32 |
| 2007-06-21 | 17566.302 |
| 2007-06-22 | 17368.979 |
| 2007-06-25 | 17296.102 |
| 2007-06-26 | 17238.717 |
| 2007-06-27 | 17402.658 |
| 2007-06-28 | 17405.537 |
| 2007-06-29 | 17377.353 |
| 2007-07-02 | 17573.766 |
| 2007-07-03 | 17632.982 |
| 2007-07-05 | 17654.18 |
| 2007-07-06 | 17720.813 |
| 2007-07-09 | 17739.68 |
| 2007-07-10 | 17488.072 |
| 2007-07-11 | 17578.417 |
| 2007-07-12 | 17887.196 |
| 2007-07-13 | 17942.058 |
| 2007-07-16 | 17889.664 |
| 2007-07-17 | 17890.167 |
| 2007-07-18 | 17850.742 |
| 2007-07-19 | 17936.105 |
| 2007-07-20 | 17719.83 |
| 2007-07-23 | 17779.024 |
| 2007-07-24 | 17419.965 |
| 2007-07-25 | 17474.45 |
| 2007-07-26 | 17070.744 |
| 2007-07-27 | 16810.554 |
| 2007-07-30 | 16972.789 |
| 2007-07-31 | 16778.421 |
| 2007-08-01 | 16892.523 |
| 2007-08-02 | 16977.721 |
| 2007-08-03 | 16522.672 |
| 2007-08-06 | 16855.567 |
| 2007-08-07 | 16970.475 |
| 2007-08-08 | 17225.475 |
| 2007-08-09 | 16760.775 |
| 2007-08-10 | 16761.588 |
| 2007-08-13 | 16752.807 |
| 2007-08-14 | 16440.232 |
| 2007-08-15 | 16195.329 |
| 2007-08-16 | 16245.644 |
| 2007-08-17 | 16636.217 |
| 2007-08-20 | 16651.145 |
| 2007-08-21 | 16681.38 |
| 2007-08-22 | 16887.233 |
| 2007-08-23 | 16852.854 |
| 2007-08-24 | 17053.727 |
| 2007-08-27 | 16908.47 |
| 2007-08-28 | 16514.99 |
| 2007-08-29 | 16868.378 |
| 2007-08-30 | 16803.042 |
| 2007-08-31 | 16998.191 |
| 2007-09-04 | 17133.665 |
| 2007-09-05 | 16949.979 |
| 2007-09-06 | 17016.905 |
| 2007-09-07 | 16732.064 |
| 2007-09-10 | 16684.125 |
| 2007-09-11 | 16907.69 |
| 2007-09-12 | 16900.281 |
| 2007-09-13 | 17021.528 |
| 2007-09-14 | 17042.695 |
| 2007-09-17 | 16942.044 |
| 2007-09-18 | 17435.665 |
| 2007-09-19 | 17549.252 |
| 2007-09-20 | 17435.54 |
| 2007-09-21 | 17512.307 |
| 2007-09-24 | 17425.481 |
| 2007-09-25 | 17415.434 |
| 2007-09-26 | 17511.279 |
| 2007-09-27 | 17595.068 |
| 2007-09-28 | 17538.668 |
| 2007-10-01 | 17744.734 |
| 2007-10-02 | 17766.778 |
| 2007-10-03 | 17678.247 |
| 2007-10-04 | 17717.551 |
| 2007-10-05 | 17913.264 |
| 2007-10-08 | 17863.82 |
| 2007-10-09 | 18007.822 |
| 2007-10-10 | 17998.184 |
| 2007-10-11 | 17894.079 |
| 2007-10-12 | 17988.01 |
| 2007-10-15 | 17827.273 |
| 2007-10-16 | 17709.622 |
| 2007-10-17 | 17746.636 |
| 2007-10-18 | 17735.062 |
| 2007-10-19 | 17287.586 |
| 2007-10-22 | 17371.047 |
| 2007-10-23 | 17528.88 |
| 2007-10-24 | 17473.523 |
| 2007-10-25 | 17442.969 |
| 2007-10-26 | 17679.067 |
| 2007-10-29 | 17751.25 |
| 2007-10-30 | 17637.929 |
| 2007-10-31 | 17855.925 |
| 2007-11-01 | 17283.587 |
| 2007-11-02 | 17292.342 |
| 2007-11-05 | 17184.865 |
| 2007-11-06 | 17389.728 |
| 2007-11-07 | 16904.338 |
| 2007-11-08 | 16899.23 |
| 2007-11-09 | 16658.659 |
| 2007-11-12 | 16469.98 |
| 2007-11-13 | 16932.006 |
| 2007-11-14 | 16819.478 |
| 2007-11-15 | 16607.265 |
| 2007-11-16 | 16679.033 |
| 2007-11-19 | 16379.333 |
| 2007-11-20 | 16427.726 |
| 2007-11-21 | 16181.866 |
| 2007-11-23 | 16442.233 |
| 2007-11-26 | 16092.011 |
| 2007-11-27 | 16307.836 |
| 2007-11-28 | 16780.451 |
| 2007-11-29 | 16787.45 |
| 2007-11-30 | 16911.643 |
| 2007-12-03 | 16827.845 |
| 2007-12-04 | 16718.46 |
| 2007-12-05 | 16957.958 |
| 2007-12-06 | 17229.765 |
| 2007-12-07 | 17220.404 |
| 2007-12-10 | 17352.149 |
| 2007-12-11 | 16912.66 |
| 2007-12-12 | 16992.455 |
| 2007-12-13 | 16999.833 |
| 2007-12-14 | 16764.426 |
| 2007-12-17 | 16495.078 |
| 2007-12-18 | 16603.964 |
| 2007-12-19 | 16596.575 |
| 2007-12-20 | 16699.625 |
| 2007-12-21 | 16975.807 |
| 2007-12-24 | 17124.97 |
| 2007-12-26 | 17142.015 |
| 2007-12-27 | 16881.178 |
| 2007-12-28 | 16899.152 |
| 2007-12-31 | 16794.833 |
| 2008-01-02 | 16479.452 |
| 2008-01-03 | 16450.527 |
| 2008-01-04 | 16025.312 |
| 2008-01-07 | 16046.681 |
| 2008-01-08 | 15746.042 |
| 2008-01-09 | 15923.775 |
| 2008-01-10 | 16064.025 |
| 2008-01-11 | 15835.512 |
| 2008-01-14 | 15997.729 |
| 2008-01-15 | 15609.175 |
| 2008-01-16 | 15531.523 |
| 2008-01-17 | 15099.271 |
| 2008-01-18 | 15007.692 |
| 2008-01-22 | 14873.735 |
| 2008-01-23 | 15193.399 |
| 2008-01-24 | 15345.985 |
| 2008-01-25 | 15137.567 |
| 2008-01-28 | 15404.929 |
| 2008-01-29 | 15494.095 |
| 2008-01-30 | 15400.294 |
| 2008-01-31 | 15670.994 |
| 2008-02-01 | 15844.247 |
| 2008-02-04 | 15690.787 |
| 2008-02-05 | 15220.309 |
| 2008-02-06 | 15087.617 |
| 2008-02-07 | 15211.111 |
| 2008-02-08 | 15162.694 |
| 2008-02-11 | 15249.128 |
| 2008-02-12 | 15345.49 |
| 2008-02-13 | 15565.774 |
| 2008-02-14 | 15354.946 |
| 2008-02-15 | 15351.348 |
| 2008-02-19 | 15343.455 |
| 2008-02-20 | 15470.109 |
| 2008-02-21 | 15265.724 |
| 2008-02-22 | 15362.93 |
| 2008-02-25 | 15591.197 |
| 2008-02-26 | 15703.009 |
| 2008-02-27 | 15680.128 |
| 2008-02-28 | 15535.73 |
| 2008-02-29 | 15130.097 |
| 2008-03-03 | 14994.165 |
| 2008-03-04 | 14934.76 |
| 2008-03-05 | 15019.347 |
| 2008-03-06 | 14675.713 |
| 2008-03-07 | 14550.215 |
| 2008-03-10 | 14293.966 |
| 2008-03-11 | 14811.29 |
| 2008-03-12 | 14691.844 |
| 2008-03-13 | 14789.262 |
| 2008-03-14 | 14483.909 |
| 2008-03-17 | 14299.741 |
| 2008-03-18 | 14887.461 |
| 2008-03-19 | 14533.371 |
| 2008-03-20 | 14866.816 |
| 2008-03-24 | 15128.069 |
| 2008-03-25 | 15186.961 |
| 2008-03-26 | 15069.556 |
| 2008-03-27 | 14897.382 |
| 2008-03-28 | 14776.208 |
| 2008-03-31 | 14861.899 |
| 2008-04-01 | 15275.555 |
| 2008-04-02 | 15263.4 |
| 2008-04-03 | 15292.829 |
| 2008-04-04 | 15317.228 |
| 2008-04-07 | 15341.118 |
| 2008-04-08 | 15279.644 |
| 2008-04-09 | 15131.655 |
| 2008-04-10 | 15215.223 |
| 2008-04-11 | 14908.852 |
| 2008-04-14 | 14859.156 |
| 2008-04-15 | 14929.062 |
| 2008-04-16 | 15276.275 |
| 2008-04-17 | 15265.428 |
| 2008-04-18 | 15531.633 |
| 2008-04-21 | 15507.4 |
| 2008-04-22 | 15361.14 |
| 2008-04-23 | 15401.483 |
| 2008-04-24 | 15501.96 |
| 2008-04-25 | 15611.311 |
| 2008-04-28 | 15609.893 |
| 2008-04-29 | 15548.519 |
| 2008-04-30 | 15502.624 |
| 2008-05-01 | 15624.921 |
| 2008-05-02 | 15658.786 |
| 2008-05-05 | 15601.649 |
| 2008-05-06 | 15721.922 |
| 2008-05-07 | 15456.171 |
| 2008-05-08 | 15515.944 |
| 2008-05-09 | 15426.932 |
| 2008-05-12 | 15593.837 |
| 2008-05-13 | 15609.868 |
| 2008-05-14 | 15664.389 |
| 2008-05-15 | 15827.075 |
| 2008-05-16 | 15848.534 |
| 2008-05-19 | 15847.82 |
| 2008-05-20 | 15723.416 |
| 2008-05-21 | 15475.465 |
| 2008-05-22 | 15522.603 |
| 2008-05-23 | 15332.898 |
| 2008-05-27 | 15447.842 |
| 2008-05-28 | 15526.987 |
| 2008-05-29 | 15621.416 |
| 2008-05-30 | 15669.444 |
| 2008-06-02 | 15365.316 |
| 2008-06-03 | 15296.806 |
| 2008-06-04 | 15296.74 |
| 2008-06-05 | 15599.252 |
| 2008-06-06 | 15147.47 |
| 2008-06-09 | 15139.159 |
| 2008-06-10 | 15088.543 |
| 2008-06-11 | 14836.778 |
| 2008-06-12 | 14879.192 |
| 2008-06-13 | 15109.429 |
| 2008-06-16 | 15139.92 |
| 2008-06-17 | 15056.332 |
| 2008-06-18 | 14912.98 |
| 2008-06-19 | 14967.088 |
| 2008-06-20 | 14701.747 |
| 2008-06-23 | 14680.883 |
| 2008-06-24 | 14600.058 |
| 2008-06-25 | 14693.295 |
| 2008-06-26 | 14277.748 |
| 2008-06-27 | 14229.775 |
| 2008-06-30 | 14221.638 |
| 2008-07-01 | 14184.63 |
| 2008-07-02 | 13897.15 |
| 2008-07-03 | 13868.084 |
| 2008-07-07 | 13747.101 |
| 2008-07-08 | 13998.232 |
| 2008-07-09 | 13697.842 |
| 2008-07-10 | 13793.2 |
| 2008-07-11 | 13673.256 |
| 2008-07-14 | 13545.401 |
| 2008-07-15 | 13407.743 |
| 2008-07-16 | 13746.982 |
| 2008-07-17 | 13905.991 |
| 2008-07-18 | 13898.427 |
| 2008-07-21 | 13928.337 |
| 2008-07-22 | 14120.156 |
| 2008-07-23 | 14161.386 |
| 2008-07-24 | 13819.918 |
| 2008-07-25 | 13891.49 |
| 2008-07-28 | 13649.167 |
| 2008-07-29 | 13959.881 |
| 2008-07-30 | 14178.732 |
| 2008-07-31 | 14010.298 |
| 2008-08-01 | 14002.691 |
| 2008-08-04 | 13839.937 |
| 2008-08-05 | 14203.753 |
| 2008-08-06 | 14270.104 |
| 2008-08-07 | 14021.726 |
| 2008-08-08 | 14338.324 |
| 2008-08-11 | 14458.738 |
| 2008-08-12 | 14301.895 |
| 2008-08-13 | 14282.262 |
| 2008-08-14 | 14372.113 |
| 2008-08-15 | 14419.538 |
| 2008-08-18 | 14209.077 |
| 2008-08-19 | 14070.106 |
| 2008-08-20 | 14147.007 |
| 2008-08-21 | 14165.325 |
| 2008-08-22 | 14325.428 |
| 2008-08-25 | 14049.485 |
| 2008-08-26 | 14099.887 |
| 2008-08-27 | 14223.647 |
| 2008-08-28 | 14437.617 |
| 2008-08-29 | 14259.403 |
| 2008-09-02 | 14213.829 |
| 2008-09-03 | 14173.367 |
| 2008-09-04 | 13767.138 |
| 2008-09-05 | 13820.122 |
| 2008-09-08 | 14060.065 |
| 2008-09-09 | 13574.283 |
| 2008-09-10 | 13676.172 |
| 2008-09-11 | 13834.375 |
| 2008-09-12 | 13887.903 |
| 2008-09-15 | 13256.387 |
| 2008-09-16 | 13488.67 |
| 2008-09-17 | 12864.29 |
| 2008-09-18 | 13436.828 |
| 2008-09-19 | 14015.48 |
| 2008-09-22 | 13449.971 |
| 2008-09-23 | 13244.06 |
| 2008-09-24 | 13200.465 |
| 2008-09-25 | 13424.088 |
| 2008-09-26 | 13433.292 |
| 2008-09-29 | 12318.909 |
| 2008-09-30 | 12920.18 |
| 2008-10-01 | 12978.813 |
| 2008-10-02 | 12413.15 |
| 2008-10-03 | 12225.042 |
| 2008-10-06 | 11725.752 |
| 2008-10-07 | 11053.412 |
| 2008-10-08 | 10909.927 |
| 2008-10-09 | 10098.279 |
| 2008-10-10 | 10024.465 |
| 2008-10-13 | 11167.365 |
| 2008-10-14 | 11062.71 |
| 2008-10-15 | 10068.021 |
| 2008-10-16 | 10495.574 |
| 2008-10-17 | 10457.051 |
| 2008-10-20 | 10929.128 |
| 2008-10-21 | 10607.197 |
| 2008-10-22 | 9980.611 |
| 2008-10-23 | 10014.1 |
| 2008-10-24 | 9678.716 |
| 2008-10-27 | 9344.816 |
| 2008-10-28 | 10266.438 |
| 2008-10-29 | 10236.741 |
| 2008-10-30 | 10534.625 |
| 2008-10-31 | 10736.514 |
| 2008-11-03 | 10925.435 |
| 2008-11-04 | 11323.295 |
| 2008-11-05 | 10738.126 |
| 2008-11-06 | 10212.704 |
| 2008-11-07 | 10486.362 |
| 2008-11-10 | 10331.582 |
| 2008-11-11 | 10095.473 |
| 2008-11-12 | 9565.479 |
| 2008-11-13 | 10219.393 |
| 2008-11-14 | 9773.227 |
| 2008-11-17 | 9534.384 |
| 2008-11-18 | 9597.482 |
| 2008-11-19 | 8980.299 |
| 2008-11-20 | 8372.058 |
| 2008-11-21 | 8881.478 |
| 2008-11-24 | 9455.711 |
| 2008-11-25 | 9544.805 |
| 2008-11-26 | 9921.15 |
| 2008-11-28 | 10023.489 |
| 2008-12-01 | 9201.979 |
| 2008-12-02 | 9573.471 |
| 2008-12-03 | 9820.788 |
| 2008-12-04 | 9531.226 |
| 2008-12-05 | 9892.641 |
| 2008-12-08 | 10278.003 |
| 2008-12-09 | 10043.457 |
| 2008-12-10 | 10178.942 |
| 2008-12-11 | 9856.488 |
| 2008-12-12 | 9964.007 |
| 2008-12-15 | 9810.202 |
| 2008-12-16 | 10324.652 |
| 2008-12-17 | 10265.356 |
| 2008-12-18 | 10060.656 |
| 2008-12-19 | 10104.18 |
| 2008-12-22 | 9908.991 |
| 2008-12-23 | 9821.015 |
| 2008-12-24 | 9863.825 |
| 2008-12-26 | 9929.111 |
| 2008-12-29 | 9863.44 |
| 2008-12-30 | 10110.43 |
| 2008-12-31 | 10288.963 |
| 2009-01-02 | 10557.078 |
| 2009-01-05 | 10532.931 |
| 2009-01-06 | 10639.093 |
| 2009-01-07 | 10317.033 |
| 2009-01-08 | 10365.351 |
| 2009-01-09 | 10130.096 |
| 2009-01-12 | 9889.194 |
| 2009-01-13 | 9925.19 |
| 2009-01-14 | 9583.458 |
| 2009-01-15 | 9623.547 |
| 2009-01-16 | 9698.74 |
| 2009-01-20 | 9168.979 |
| 2009-01-21 | 9564.812 |
| 2009-01-22 | 9399.802 |
| 2009-01-23 | 9452.934 |
| 2009-01-26 | 9505.412 |
| 2009-01-27 | 9609.77 |
| 2009-01-28 | 9936.238 |
| 2009-01-29 | 9603.919 |
| 2009-01-30 | 9397.142 |
| 2009-02-02 | 9359.773 |
| 2009-02-03 | 9493.656 |
| 2009-02-04 | 9433.26 |
| 2009-02-05 | 9585.371 |
| 2009-02-06 | 9854.831 |
| 2009-02-09 | 9859.755 |
| 2009-02-10 | 9399.596 |
| 2009-02-11 | 9467.911 |
| 2009-02-12 | 9492.859 |
| 2009-02-13 | 9406.842 |
| 2009-02-17 | 8989.971 |
| 2009-02-18 | 8961.624 |
| 2009-02-19 | 8849.874 |
| 2009-02-20 | 8752.247 |
| 2009-02-23 | 8441.988 |
| 2009-02-24 | 8787.751 |
| 2009-02-25 | 8684.492 |
| 2009-02-26 | 8547.176 |
| 2009-02-27 | 8384.049 |
| 2009-03-02 | 7960.72 |
| 2009-03-03 | 7904.589 |
| 2009-03-04 | 8096.986 |
| 2009-03-05 | 7750.933 |
| 2009-03-06 | 7761.004 |
| 2009-03-09 | 7674.894 |
| 2009-03-10 | 8172.03 |
| 2009-03-11 | 8190.013 |
| 2009-03-12 | 8534.141 |
| 2009-03-13 | 8589.724 |
| 2009-03-16 | 8538.696 |
| 2009-03-17 | 8815.648 |
| 2009-03-18 | 9008.896 |
| 2009-03-19 | 8913.017 |
| 2009-03-20 | 8730.064 |
| 2009-03-23 | 9341.6 |
| 2009-03-24 | 9141.246 |
| 2009-03-25 | 9237.942 |
| 2009-03-26 | 9486.158 |
| 2009-03-27 | 9273.338 |
| 2009-03-30 | 8954.444 |
| 2009-03-31 | 9078.971 |
| 2009-04-01 | 9200.863 |
| 2009-04-02 | 9489.159 |
| 2009-04-03 | 9599.188 |
| 2009-04-06 | 9508.18 |
| 2009-04-07 | 9264.657 |
| 2009-04-08 | 9386.943 |
| 2009-04-09 | 9761.492 |
| 2009-04-13 | 9789.097 |
| 2009-04-14 | 9583.628 |
| 2009-04-15 | 9702.509 |
| 2009-04-16 | 9868.754 |
| 2009-04-17 | 9923.997 |
| 2009-04-20 | 9484.75 |
| 2009-04-21 | 9706.45 |
| 2009-04-22 | 9645.156 |
| 2009-04-23 | 9711.305 |
| 2009-04-24 | 9893.49 |
| 2009-04-27 | 9787.747 |
| 2009-04-28 | 9771.036 |
| 2009-04-29 | 10009.413 |
| 2009-04-30 | 10004.982 |
| 2009-05-01 | 10015.865 |
| 2009-05-04 | 10365.806 |
| 2009-05-05 | 10328.675 |
| 2009-05-06 | 10477.311 |
| 2009-05-07 | 10317.667 |
| 2009-05-08 | 10584.553 |
| 2009-05-11 | 10361.888 |
| 2009-05-12 | 10328.998 |
| 2009-05-13 | 10016.689 |
| 2009-05-14 | 10131.722 |
| 2009-05-15 | 10022.032 |
| 2009-05-18 | 10345.593 |
| 2009-05-19 | 10332.092 |
| 2009-05-20 | 10285.845 |
| 2009-05-21 | 10112.088 |
| 2009-05-22 | 10093.745 |
| 2009-05-26 | 10377.226 |
| 2009-05-27 | 10189.511 |
| 2009-05-28 | 10328.007 |
| 2009-05-29 | 10472.024 |
| 2009-06-01 | 10667.457 |
| 2009-06-02 | 10697.154 |
| 2009-06-03 | 10548.912 |
| 2009-06-04 | 10677.212 |
| 2009-06-05 | 10655.174 |
| 2009-06-08 | 10630.587 |
| 2009-06-09 | 10679.817 |
| 2009-06-10 | 10639.36 |
| 2009-06-11 | 10705.11 |
| 2009-06-12 | 10706.148 |
| 2009-06-15 | 10447.881 |
| 2009-06-16 | 10306.459 |
| 2009-06-17 | 10290.556 |
| 2009-06-18 | 10367.486 |
| 2009-06-19 | 10404.941 |
| 2009-06-22 | 10074.258 |
| 2009-06-23 | 10085.79 |
| 2009-06-24 | 10167.299 |
| 2009-06-25 | 10386.953 |
| 2009-06-26 | 10395.66 |
| 2009-06-29 | 10477.213 |
| 2009-06-30 | 10404.61 |
| 2009-07-01 | 10480.157 |
| 2009-07-02 | 10178.417 |
| 2009-07-06 | 10176.792 |
| 2009-07-07 | 9974.707 |
| 2009-07-08 | 9954.016 |
| 2009-07-09 | 9986.711 |
| 2009-07-10 | 9959.697 |
| 2009-07-13 | 10198.058 |
| 2009-07-14 | 10250.152 |
| 2009-07-15 | 10568.019 |
| 2009-07-16 | 10673.057 |
| 2009-07-17 | 10659.628 |
| 2009-07-20 | 10796.554 |
| 2009-07-21 | 10823.148 |
| 2009-07-22 | 10834.82 |
| 2009-07-23 | 11089.739 |
| 2009-07-24 | 11136.505 |
| 2009-07-27 | 11166.614 |
| 2009-07-28 | 11145.149 |
| 2009-07-29 | 11081.892 |
| 2009-07-30 | 11226.412 |
| 2009-07-31 | 11228.479 |
| 2009-08-03 | 11395.014 |
| 2009-08-04 | 11419.619 |
| 2009-08-05 | 11407.256 |
| 2009-08-06 | 11324.532 |
| 2009-08-07 | 11501.637 |
| 2009-08-10 | 11454.943 |
| 2009-08-11 | 11316.371 |
| 2009-08-12 | 11444.642 |
| 2009-08-13 | 11529.98 |
| 2009-08-14 | 11412.759 |
| 2009-08-17 | 11129.615 |
| 2009-08-18 | 11249.979 |
| 2009-08-19 | 11330.266 |
| 2009-08-20 | 11448.061 |
| 2009-08-21 | 11663.358 |
| 2009-08-24 | 11649.539 |
| 2009-08-25 | 11684.566 |
| 2009-08-26 | 11681.588 |
| 2009-08-27 | 11715.743 |
| 2009-08-28 | 11693.477 |
| 2009-08-31 | 11593.625 |
| 2009-09-01 | 11265.596 |
| 2009-09-02 | 11324.991 |
| 2009-09-03 | 11394.526 |
| 2009-09-04 | 11548.034 |
| 2009-09-08 | 11659.87 |
| 2009-09-09 | 11764.376 |
| 2009-09-10 | 11893.052 |
| 2009-09-11 | 11883.221 |
| 2009-09-14 | 11962.4 |
| 2009-09-15 | 12013.319 |
| 2009-09-16 | 12205.182 |
| 2009-09-17 | 12167.918 |
| 2009-09-18 | 12193.07 |
| 2009-09-21 | 12160.545 |
| 2009-09-22 | 12249.279 |
| 2009-09-23 | 12086.767 |
| 2009-09-24 | 11982.503 |
| 2009-09-25 | 11908.328 |
| 2009-09-28 | 12127.194 |
| 2009-09-29 | 12072.218 |
| 2009-09-30 | 12063.258 |
| 2009-10-01 | 11730 |
| 2009-10-02 | 11671.311 |
| 2009-10-05 | 11854.093 |
| 2009-10-06 | 12019.631 |
| 2009-10-07 | 12055.516 |
| 2009-10-08 | 12153.954 |
| 2009-10-09 | 12272.112 |
| 2009-10-13 | 12199.902 |
| 2009-10-14 | 12455.587 |
| 2009-10-15 | 12503.452 |
| 2009-10-16 | 12394.664 |
| 2009-10-19 | 12517.226 |
| 2009-10-20 | 12422.631 |
| 2009-10-21 | 12315.319 |
| 2009-10-22 | 12439.94 |
| 2009-10-23 | 12289.157 |
| 2009-10-26 | 12136.072 |
| 2009-10-27 | 12078.881 |
| 2009-10-28 | 11803.762 |
| 2009-10-29 | 12074.102 |
| 2009-10-30 | 11732.951 |
| 2009-11-02 | 11790.825 |
| 2009-11-03 | 11845.731 |
| 2009-11-04 | 11849.494 |
| 2009-11-05 | 12086.304 |
| 2009-11-06 | 12115.418 |
| 2009-11-09 | 12375.995 |
| 2009-11-10 | 12373.288 |
| 2009-11-11 | 12433.178 |
| 2009-11-12 | 12300.909 |
| 2009-11-13 | 12369.646 |
| 2009-11-16 | 12573.457 |
| 2009-11-17 | 12575.702 |
| 2009-11-18 | 12574.557 |
| 2009-11-19 | 12383.95 |
| 2009-11-20 | 12301.921 |
| 2009-11-23 | 12502.135 |
| 2009-11-24 | 12439.714 |
| 2009-11-25 | 12506.954 |
| 2009-11-27 | 12286.693 |
| 2009-11-30 | 12331.597 |
| 2009-12-01 | 12590.778 |
| 2009-12-02 | 12616.74 |
| 2009-12-03 | 12507.831 |
| 2009-12-04 | 12599.487 |
| 2009-12-07 | 12576.066 |
| 2009-12-08 | 12454.053 |
| 2009-12-09 | 12493.152 |
| 2009-12-10 | 12554.02 |
| 2009-12-11 | 12609.994 |
| 2009-12-14 | 12716.563 |
| 2009-12-15 | 12654.885 |
| 2009-12-16 | 12684.143 |
| 2009-12-17 | 12538.553 |
| 2009-12-18 | 12598.611 |
| 2009-12-21 | 12751.59 |
| 2009-12-22 | 12781.724 |
| 2009-12-23 | 12878.374 |
| 2009-12-24 | 12946.742 |
| 2009-12-28 | 12957.382 |
| 2009-12-29 | 12941.527 |
| 2009-12-30 | 12942.271 |
| 2009-12-31 | 12813.334 |
| 2010-01-04 | 12914.764 |
| 2010-01-05 | 12954.958 |
| 2010-01-06 | 12966.679 |
| 2010-01-07 | 13018.045 |
| 2010-01-08 | 13060.425 |
| 2010-01-11 | 13079.133 |
| 2010-01-12 | 12937.371 |
| 2010-01-13 | 13050.022 |
| 2010-01-14 | 13081.253 |
| 2010-01-15 | 12937.239 |
| 2010-01-19 | 13103.816 |
| 2010-01-20 | 12970.579 |
| 2010-01-21 | 12741.871 |
| 2010-01-22 | 12466.443 |
| 2010-01-25 | 12515.481 |
| 2010-01-26 | 12460.995 |
| 2010-01-27 | 12522.313 |
| 2010-01-28 | 12312.818 |
| 2010-01-29 | 12249.643 |
| 2010-02-01 | 12421.528 |
| 2010-02-02 | 12573.05 |
| 2010-02-03 | 12504.785 |
| 2010-02-04 | 12108.105 |
| 2010-02-05 | 12143.501 |
| 2010-02-08 | 12043.979 |
| 2010-02-09 | 12198.983 |
| 2010-02-10 | 12173.076 |
| 2010-02-11 | 12309.805 |
| 2010-02-12 | 12301.876 |
| 2010-02-15 | 12244.581 |
| 2010-02-16 | 12521.489 |
| 2010-02-17 | 12581.704 |
| 2010-02-18 | 12659.964 |
| 2010-02-19 | 12691.242 |
| 2010-02-22 | 12683.587 |
| 2010-02-23 | 12528.517 |
| 2010-02-24 | 12580.156 |
| 2010-02-25 | 12626.227 |
| 2010-02-26 | 12643.249 |
| 2010-03-01 | 12740.938 |
| 2010-03-02 | 12783.167 |
| 2010-03-03 | 12790.922 |
| 2010-03-04 | 12836.017 |
| 2010-03-05 | 13022.641 |
| 2010-03-08 | 13029.214 |
| 2010-03-09 | 13055.212 |
| 2010-03-10 | 13123.155 |
| 2010-03-11 | 13175.611 |
| 2010-03-12 | 13177.197 |
| 2010-03-15 | 13171.75 |
| 2010-03-16 | 13277.11 |
| 2010-03-17 | 13355.017 |
| 2010-03-18 | 13271.641 |
| 2010-03-19 | 13252.435 |
| 2010-03-22 | 13339.453 |
| 2010-03-23 | 13439.223 |
| 2010-03-24 | 13362.673 |
| 2010-03-25 | 13327.454 |
| 2010-03-26 | 13333.82 |
| 2010-03-29 | 13411.814 |
| 2010-03-30 | 13415.467 |
| 2010-03-31 | 13367.966 |
| 2010-04-01 | 13445.095 |
| 2010-04-05 | 13577.437 |
| 2010-04-06 | 13505.747 |
| 2010-04-07 | 13533.251 |
| 2010-04-08 | 13573.136 |
| 2010-04-09 | 13665.101 |
| 2010-04-12 | 13693.729 |
| 2010-04-13 | 13707.224 |
| 2010-04-14 | 13875.193 |
| 2010-04-15 | 13883.633 |
| 2010-04-16 | 13667.209 |
| 2010-04-17 | 13704.462 |
| 2010-04-20 | 13831.421 |
| 2010-04-21 | 13830.144 |
| 2010-04-22 | 13885.063 |
| 2010-04-23 | 13990.612 |
| 2010-04-26 | 13935.594 |
| 2010-04-27 | 13605.716 |
| 2010-04-28 | 13688.237 |
| 2010-04-29 | 13866.775 |
| 2010-04-30 | 13623.24 |
| 2010-05-03 | 13801.102 |
| 2010-05-04 | 13455.704 |
| 2010-05-05 | 13342.994 |
| 2010-05-06 | 12899.93 |
| 2010-05-07 | 12678.098 |
| 2010-05-10 | 13254.132 |
| 2010-05-11 | 13228.57 |
| 2010-05-12 | 13439.318 |
| 2010-05-13 | 13288.619 |
| 2010-05-14 | 13027.587 |
| 2010-05-15 | 13037.417 |
| 2010-05-16 | 12847.115 |
| 2010-05-17 | 12762.934 |
| 2010-05-18 | 12247.177 |
| 2010-05-19 | 12433.41 |
| 2010-05-24 | 12281.478 |
| 2010-05-25 | 12279.918 |
| 2010-05-26 | 12240.642 |
| 2010-05-27 | 12662.366 |
| 2010-05-28 | 12509.67 |
| 2010-06-01 | 12281.096 |
| 2010-06-02 | 12602.97 |
| 2010-06-03 | 12671.387 |
| 2010-06-04 | 12215.758 |
| 2010-06-07 | 12028.611 |
| 2010-06-08 | 12136.332 |
| 2010-06-09 | 12085.617 |
| 2010-06-10 | 12447.067 |
| 2010-06-11 | 12521.48 |
| 2010-06-14 | 12516.642 |
| 2010-06-15 | 12813.246 |
| 2010-06-16 | 12795.718 |
| 2010-06-17 | 12804.924 |
| 2010-06-18 | 12818.062 |
| 2010-06-21 | 12758.261 |
| 2010-06-22 | 12543.998 |
| 2010-06-23 | 12509.992 |
| 2010-06-24 | 12289.308 |
| 2010-06-25 | 12366.932 |
| 2010-06-28 | 12335.95 |
| 2010-06-29 | 11935.764 |
| 2010-06-30 | 11819.711 |
| 2010-07-01 | 11773.205 |
| 2010-07-02 | 11706.462 |
| 2010-07-06 | 11739.053 |
| 2010-07-07 | 12114.184 |
| 2010-07-08 | 12232.276 |
| 2010-07-09 | 12333.729 |
| 2010-07-12 | 12320.354 |
| 2010-07-13 | 12538.535 |
| 2010-07-14 | 12531.733 |
| 2010-07-15 | 12533.239 |
| 2010-07-16 | 12163.753 |
| 2010-07-19 | 12234.689 |
| 2010-07-20 | 12389.336 |
| 2010-07-21 | 12225.441 |
| 2010-07-22 | 12519.122 |
| 2010-07-23 | 12647.576 |
| 2010-07-26 | 12804.264 |
| 2010-07-27 | 12771.804 |
| 2010-07-28 | 12668.331 |
| 2010-07-29 | 12619.974 |
| 2010-07-30 | 12630.914 |
| 2010-08-02 | 12876.006 |
| 2010-08-03 | 12803.957 |
| 2010-08-04 | 12895.828 |
| 2010-08-05 | 12863.358 |
| 2010-08-06 | 12816.42 |
| 2010-08-09 | 12895.305 |
| 2010-08-10 | 12790.503 |
| 2010-08-11 | 12412.574 |
| 2010-08-12 | 12349.085 |
| 2010-08-13 | 12293.991 |
| 2010-08-16 | 12307.805 |
| 2010-08-17 | 12468.454 |
| 2010-08-18 | 12491.023 |
| 2010-08-19 | 12272.555 |
| 2010-08-20 | 12237.85 |
| 2010-08-23 | 12176.061 |
| 2010-08-24 | 12000.224 |
| 2010-08-25 | 12055.264 |
| 2010-08-26 | 11964.135 |
| 2010-08-27 | 12100 |
| 2010-08-30 | 11989.812 |
| 2010-08-31 | 11994.795 |
| 2010-09-01 | 12348.541 |
| 2010-09-02 | 12470.118 |
| 2010-09-03 | 12636.601 |
| 2010-09-07 | 12401.762 |
| 2010-09-08 | 12559.113 |
| 2010-09-09 | 12610.568 |
| 2010-09-10 | 12667.744 |
| 2010-09-13 | 12827.395 |
| 2010-09-14 | 12817.817 |
| 2010-09-15 | 12863.213 |
| 2010-09-16 | 12850.279 |
| 2010-09-17 | 12870.765 |
| 2010-09-20 | 13079.179 |
| 2010-09-21 | 13035.352 |
| 2010-09-22 | 12964.979 |
| 2010-09-23 | 12858.593 |
| 2010-09-24 | 13144.713 |
| 2010-09-27 | 13081.38 |
| 2010-09-28 | 13154.335 |
| 2010-09-29 | 13132.748 |
| 2010-09-30 | 13099.077 |
| 2010-10-01 | 13139.01 |
| 2010-10-04 | 13028.26 |
| 2010-10-05 | 13302.761 |
| 2010-10-06 | 13277.849 |
| 2010-10-07 | 13259.238 |
| 2010-10-08 | 13355.131 |
| 2010-10-09 | 13359.92 |
| 2010-10-10 | 13412.073 |
| 2010-10-11 | 13519.72 |
| 2010-10-12 | 13469.33 |
| 2010-10-13 | 13495.342 |
| 2010-10-18 | 13589.994 |
| 2010-10-19 | 13364.371 |
| 2010-10-20 | 13508.652 |
| 2010-10-21 | 13521.407 |
| 2010-10-22 | 13566.584 |
| 2010-10-25 | 13606.82 |
| 2010-10-26 | 13610.694 |
| 2010-10-27 | 13575.378 |
| 2010-10-28 | 13581.287 |
| 2010-10-29 | 13592.323 |
| 2010-11-01 | 13590.698 |
| 2010-11-02 | 13714.379 |
| 2010-11-03 | 13760.973 |
| 2010-11-04 | 14026.774 |
| 2010-11-05 | 14085.531 |
| 2010-11-08 | 14064.382 |
| 2010-11-09 | 13944.596 |
| 2010-11-10 | 14018.746 |
| 2010-11-11 | 13968.127 |
| 2010-11-12 | 13788.475 |
| 2010-11-15 | 13774.844 |
| 2010-11-16 | 13544.725 |
| 2010-11-17 | 13558.519 |
| 2010-11-18 | 13686.312 |
| 2010-11-19 | 13813.659 |
| 2010-11-22 | 13810.722 |
| 2010-11-23 | 13622.051 |
| 2010-11-24 | 13839.355 |
| 2010-11-26 | 13746.417 |
| 2010-11-29 | 13724.475 |
| 2010-11-30 | 13643.134 |
| 2010-12-01 | 13974.333 |
| 2010-12-02 | 14143.117 |
| 2010-12-03 | 14193.167 |
| 2010-12-06 | 14189.128 |
| 2010-12-07 | 14200.743 |
| 2010-12-08 | 14233.687 |
| 2010-12-09 | 14287.678 |
| 2010-12-10 | 14306.061 |
| 2010-12-13 | 14371.972 |
| 2010-12-14 | 14376.262 |
| 2010-12-15 | 14298.387 |
| 2010-12-16 | 14391.512 |
| 2010-12-17 | 14412.492 |
| 2010-12-20 | 14384.918 |
| 2010-12-21 | 14399.245 |
| 2010-12-22 | 14406.861 |
| 2010-12-23 | 14414.477 |
| 2010-12-27 | 14587.848 |
| 2010-12-28 | 14589.594 |
| 2010-12-29 | 14613.708 |
| 2010-12-30 | 14598.971 |
| 2010-12-31 | 14583.983 |
| 2011-01-03 | 14612.453 |
| 2011-01-04 | 14564.182 |
| 2011-01-05 | 14650.326 |
| 2011-01-06 | 14619.911 |
| 2011-01-07 | 14592.922 |
| 2011-01-10 | 14587.615 |
| 2011-01-11 | 14645.581 |
| 2011-01-12 | 14770.864 |
| 2011-01-13 | 14747.777 |
| 2011-01-14 | 14852.567 |
| 2011-01-18 | 14879.977 |
| 2011-01-19 | 14691.583 |
| 2011-01-20 | 14646.154 |
| 2011-01-21 | 14660.789 |
| 2011-01-24 | 14753.96 |
| 2011-01-25 | 14756.9 |
| 2011-01-26 | 14848.135 |
| 2011-01-27 | 14886.549 |
| 2011-01-28 | 14609.599 |
| 2011-01-31 | 14718.691 |
| 2011-02-01 | 14894.52 |
| 2011-02-02 | 14856.047 |
| 2011-02-03 | 14893.251 |
| 2011-02-04 | 14862.404 |
| 2011-02-07 | 15035.429 |
| 2011-02-08 | 15147.639 |
| 2011-02-09 | 15053.348 |
| 2011-02-10 | 15074.612 |
| 2011-02-11 | 15171.606 |
| 2011-02-14 | 15217.382 |
| 2011-02-15 | 15160.205 |
| 2011-02-16 | 15260.996 |
| 2011-02-17 | 15313.978 |
| 2011-02-18 | 15334.618 |
| 2011-02-22 | 15000.538 |
| 2011-02-23 | 14883.711 |
| 2011-02-24 | 14882.452 |
| 2011-02-25 | 15066.717 |
| 2011-02-28 | 15135.446 |
| 2011-03-01 | 14747.639 |
| 2011-03-02 | 14782.001 |
| 2011-03-03 | 15038.761 |
| 2011-03-04 | 14934.779 |
| 2011-03-07 | 14791.066 |
| 2011-03-08 | 14928.25 |
| 2011-03-09 | 14898.979 |
| 2011-03-10 | 14609.624 |
| 2011-03-11 | 14707.503 |
| 2011-03-12 | 14619.168 |
| 2011-03-13 | 14465.666 |
| 2011-03-14 | 14214.594 |
| 2011-03-15 | 14377.651 |
| 2011-03-16 | 14444.618 |
| 2011-03-21 | 14677.38 |
| 2011-03-22 | 14552.307 |
| 2011-03-23 | 14661.946 |
| 2011-03-24 | 14800.312 |
| 2011-03-25 | 14858.502 |
| 2011-03-28 | 14810.75 |
| 2011-03-29 | 14915.819 |
| 2011-03-30 | 15033.915 |
| 2011-03-31 | 15020.312 |
| 2011-04-01 | 15001.702 |
| 2011-04-04 | 15011.449 |
| 2011-04-05 | 15021.345 |
| 2011-04-06 | 15046.132 |
| 2011-04-07 | 15013.82 |
| 2011-04-08 | 14941.587 |
| 2011-04-11 | 14884.701 |
| 2011-04-12 | 14759.232 |
| 2011-04-13 | 14773.52 |
| 2011-04-14 | 14776.97 |
| 2011-04-15 | 14843.859 |
| 2011-04-19 | 14745.135 |
| 2011-04-20 | 14959.325 |
| 2011-04-21 | 15044.936 |
| 2011-04-25 | 15024.361 |
| 2011-04-26 | 15157.143 |
| 2011-04-27 | 15251.199 |
| 2011-04-28 | 15301.778 |
| 2011-04-29 | 15341.35 |
| 2011-05-02 | 15221.758 |
| 2011-05-03 | 15142.005 |
| 2011-05-04 | 15025.91 |
| 2011-05-05 | 14903.62 |
| 2011-05-06 | 14965.623 |
| 2011-05-09 | 15047.146 |
| 2011-05-10 | 15177.989 |
| 2011-05-11 | 15002.598 |
| 2011-05-12 | 15076.378 |
| 2011-05-13 | 14944.555 |
| 2011-05-16 | 14831.62 |
| 2011-05-17 | 14811.542 |
| 2011-05-18 | 14963.706 |
| 2011-05-19 | 14997.226 |
| 2011-05-20 | 14889.936 |
| 2011-05-23 | 14698.67 |
| 2011-05-24 | 14680.941 |
| 2011-05-25 | 14746.484 |
| 2011-05-26 | 14825.468 |
| 2011-05-27 | 14895.551 |
| 2011-05-31 | 15050.464 |
| 2011-06-01 | 14866.651 |
| 2011-06-02 | 14698.041 |
| 2011-06-03 | 14544.987 |
| 2011-06-06 | 14369.46 |
| 2011-06-07 | 14367.636 |
| 2011-06-08 | 14287.533 |
| 2011-06-09 | 14391.658 |
| 2011-06-10 | 14191.487 |
| 2011-06-13 | 14186.731 |
| 2011-06-14 | 14378.824 |
| 2011-06-15 | 14134.162 |
| 2011-06-16 | 14148.282 |
| 2011-06-17 | 14181.743 |
| 2011-06-20 | 14264.587 |
| 2011-06-21 | 14480.734 |
| 2011-06-22 | 14393.556 |
| 2011-06-23 | 14368.732 |
| 2011-06-24 | 14215.678 |
| 2011-06-27 | 14339.205 |
| 2011-06-28 | 14530.466 |
| 2011-06-29 | 14648.141 |
| 2011-06-30 | 14787.772 |
| 2011-07-01 | 14989.003 |
| 2011-07-05 | 14980.406 |
| 2011-07-06 | 15005.777 |
| 2011-07-07 | 15171.055 |
| 2011-07-08 | 15073.344 |
| 2011-07-11 | 14786.049 |
| 2011-07-12 | 14780.233 |
| 2011-07-13 | 14721.906 |
| 2011-07-14 | 14658.669 |
| 2011-07-15 | 14751.143 |
| 2011-07-18 | 14611.657 |
| 2011-07-19 | 14861.929 |
| 2011-07-20 | 14783.71 |
| 2011-07-21 | 15034.635 |
| 2011-07-25 | 14955.025 |
| 2011-07-26 | 14885.593 |
| 2011-07-27 | 14560.758 |
| 2011-07-28 | 14516.855 |
| 2011-07-29 | 14436.128 |
| 2011-08-01 | 14339.26 |
| 2011-08-02 | 13956.71 |
| 2011-08-17 | 13211.185 |
| 2011-08-18 | 12596.504 |
| 2011-08-19 | 12400.496 |
| 2011-08-22 | 12392.521 |
| 2011-08-23 | 12835.812 |
| 2011-08-24 | 13004.954 |
| 2011-08-25 | 12782.405 |
| 2011-08-30 | 13448.78 |
| 2011-08-31 | 13508.134 |
| 2011-09-01 | 13307.417 |
| 2011-09-02 | 12956.942 |
| 2011-09-06 | 12864.767 |
| 2011-09-07 | 13256.966 |
| 2011-09-09 | 12756.552 |
| 2011-09-12 | 12841.834 |
| 2011-09-13 | 12976.655 |
| 2011-09-14 | 13159.881 |
| 2011-09-15 | 13373.312 |
| 2011-09-16 | 13430.803 |
| 2011-09-19 | 13296.632 |
| 2011-09-20 | 13239.634 |
| 2011-09-21 | 12845.243 |
| 2011-09-22 | 12423.638 |
| 2011-09-26 | 12790.606 |
| 2011-09-27 | 12947.038 |
| 2011-09-28 | 12641.234 |
| 2011-09-29 | 12741.487 |
| 2011-10-03 | 12046.952 |
| 2011-10-04 | 12368.716 |
| 2011-10-05 | 12592.144 |
| 2011-10-06 | 12840.224 |
| 2011-10-07 | 12704.799 |
| 2011-10-11 | 13161.494 |
| 2011-10-12 | 13303.469 |
| 2011-10-13 | 13275.326 |
| 2011-10-14 | 13509.277 |
| 2011-10-18 | 13513.304 |
| 2011-10-20 | 13385.605 |
| 2011-10-21 | 13641.854 |
| 2011-10-24 | 13864.64 |
| 2011-10-25 | 13573.048 |
| 2011-10-26 | 13727.228 |
| 2011-10-27 | 14213.842 |
| 2011-10-31 | 13867.457 |
| 2011-11-01 | 13479.406 |
| 2011-11-02 | 13709.052 |
| 2011-11-03 | 13972.871 |
| 2011-11-07 | 13962.37 |
| 2011-11-08 | 14121.994 |
| 2011-11-09 | 13587.811 |
| 2011-11-10 | 13696.341 |
| 2011-11-11 | 13968.757 |
| 2011-11-14 | 13838.005 |
| 2011-11-15 | 13912.551 |
| 2011-11-17 | 13458.563 |
| 2011-11-18 | 13452.387 |
| 2011-11-21 | 13200.867 |
| 2011-11-22 | 13140.083 |
| 2011-11-28 | 13187.21 |
| 2011-11-29 | 13206.033 |
| 2011-11-30 | 13784.618 |
| 2011-12-01 | 13787.755 |
| 2011-12-02 | 13796.373 |
| 2011-12-03 | 13951.539 |
| 2011-12-04 | 13971.864 |
| 2011-12-05 | 13659.285 |
| 2011-12-06 | 13908.452 |
| 2011-12-12 | 13555.971 |
| 2011-12-13 | 13393.821 |
| 2011-12-14 | 13448.933 |
| 2011-12-19 | 13339.132 |
| 2011-12-20 | 13746.018 |
| 2011-12-23 | 14001.008 |
| 2012-01-03 | 14057.707 |
| 2012-01-04 | 14048.024 |
| 2012-01-05 | 14102.632 |
| 2012-01-06 | 14070.77 |
| 2012-01-09 | 14105.278 |
| 2012-01-10 | 14241.713 |
| 2012-01-11 | 14259.429 |
| 2012-01-12 | 14298.914 |
| 2012-01-13 | 14226.213 |
| 2012-01-17 | 14275.349 |
| 2012-01-18 | 14446.124 |
| 2012-01-19 | 14522.186 |
| 2012-01-20 | 14527.846 |
| 2012-01-23 | 14531.269 |
| 2012-01-24 | 14537.276 |
| 2012-01-25 | 14668.492 |
| 2012-01-27 | 14587.725 |
| 2012-01-30 | 14538.925 |
| 2012-01-31 | 14533.065 |
| 2012-02-01 | 14627.139 |
| 2012-02-06 | 14873.406 |
| 2012-02-07 | 14895.561 |
| 2012-02-08 | 14925.338 |
| 2012-02-09 | 14945.58 |
| 2012-02-10 | 14832.348 |
| 2012-02-13 | 14941.795 |
| 2012-02-14 | 14923.916 |
| 2012-02-15 | 14848.345 |
| 2012-02-16 | 15032.13 |
| 2012-02-17 | 15056.292 |
| 2012-02-28 | 15140.918 |
| 2012-02-29 | 15056.324 |
| 2012-03-01 | 15039.352 |
| 2012-03-05 | 14913.795 |
| 2012-03-06 | 14671.616 |
| 2012-03-07 | 14785.416 |
| 2012-03-08 | 14931.612 |
| 2012-03-12 | 14993 |
| 2012-03-13 | 15263.207 |
| 2012-03-14 | 15222.032 |
| 2012-03-15 | 15319.354 |
| 2012-03-16 | 15330.862 |
| 2012-03-19 | 15398.082 |
| 2012-03-20 | 15336.299 |
| 2012-03-21 | 15318.846 |
| 2012-03-22 | 15201.787 |
| 2012-03-23 | 15261.64 |
| 2012-03-27 | 15424.376 |
| 2012-03-28 | 15343.293 |
| 2012-03-29 | 15316.407 |
| 2012-03-30 | 15363.133 |
| 2012-04-03 | 15378.384 |
| 2012-04-04 | 15205.958 |
| 2012-04-05 | 15197.455 |
| 2012-04-10 | 14737.759 |
| 2012-04-11 | 14863.082 |
| 2012-04-12 | 15077.738 |
| 2012-04-13 | 14895.629 |
| 2012-04-18 | 15044.643 |
| 2012-04-19 | 14967.291 |
| 2012-04-20 | 14988.51 |
| 2012-04-23 | 14846.52 |
| 2012-04-25 | 15103.839 |
| 2012-04-27 | 15265.558 |
| 2012-05-01 | 15287.833 |
| 2012-05-02 | 15263.886 |
| 2012-05-03 | 15121.46 |
| 2012-05-04 | 14880.099 |
| 2012-05-07 | 14888.012 |
| 2012-05-08 | 14823.941 |
| 2012-05-10 | 14768.145 |
| 2012-05-11 | 14726.228 |
| 2012-05-14 | 14554.915 |
| 2012-05-15 | 14479.274 |
| 2012-05-16 | 14409.993 |
| 2012-05-17 | 14166.653 |
| 2012-05-23 | 14330.25 |
| 2012-05-24 | 14347.661 |
| 2012-05-25 | 14324.419 |
| 2012-05-29 | 14488.72 |
| 2012-05-30 | 14264.667 |
| 2012-05-31 | 14231.595 |
| 2012-06-04 | 14253.532 |
| 2012-06-05 | 13972.349 |
| 2012-06-06 | 14294.774 |
| 2012-06-07 | 14275.263 |
| 2012-06-08 | 14395.389 |
| 2012-06-11 | 14192.343 |
| 2012-06-12 | 14353.152 |
| 2012-06-13 | 14238.533 |
| 2012-06-14 | 14384.342 |
| 2012-06-15 | 14532.776 |
| 2012-06-18 | 14566.508 |
| 2012-06-19 | 14725.574 |
| 2012-06-20 | 14703.998 |
| 2012-06-21 | 14372.393 |
| 2012-06-22 | 14482.582 |
| 2012-06-23 | 14323.579 |
| 2012-06-24 | 14454.037 |
| 2012-06-25 | 14425.367 |
| 2012-06-26 | 14789.853 |
| 2012-07-10 | 14623.212 |
| 2012-07-11 | 14612.188 |
| 2012-07-12 | 14544.687 |
| 2012-07-16 | 14733.394 |
| 2012-07-17 | 14834.61 |
| 2012-07-18 | 14931.836 |
| 2012-07-19 | 14965.239 |
| 2012-07-20 | 14813.259 |
| 2012-07-21 | 14669.051 |
| 2012-07-22 | 14527.212 |
| 2012-07-23 | 14525.632 |
| 2012-07-24 | 14743.514 |
| 2012-07-25 | 15020.512 |
| 2012-07-26 | 15002.621 |
| 2012-07-27 | 14930.268 |
| 2012-08-01 | 14773.877 |
| 2012-08-02 | 14671.837 |
| 2012-08-07 | 15087.292 |
| 2012-08-08 | 15089.338 |
| 2012-08-09 | 15103.452 |
| 2012-08-10 | 15129.644 |
| 2012-08-20 | 15275.482 |
| 2012-08-21 | 15227.902 |
| 2012-08-22 | 15226.301 |
| 2012-08-23 | 15109.775 |
| 2012-08-24 | 15196.854 |
| 2012-08-29 | 15211.857 |
| 2012-08-30 | 15092.148 |
| 2012-08-31 | 15168.524 |
| 2012-09-04 | 15113.616 |
| 2012-09-05 | 15102.939 |
| 2012-09-06 | 15404.182 |
| 2012-09-10 | 15381.83 |
| 2012-09-11 | 15427.08 |
| 2012-09-12 | 15469.058 |
| 2012-09-13 | 15704.17 |
| 2012-09-14 | 15793.661 |
| 2012-09-17 | 15725.772 |
| 2012-09-18 | 15698.369 |
| 2012-09-19 | 15722.058 |
| 2012-09-20 | 15693.668 |
| 2012-09-21 | 15700.838 |
| 2012-09-25 | 15479.57 |
| 2012-09-26 | 15391.129 |
| 2012-09-27 | 15540.681 |
| 2012-10-01 | 15516.608 |
| 2012-10-02 | 15533.504 |
| 2012-10-03 | 15585.676 |
| 2012-10-04 | 15697.325 |
| 2012-10-09 | 15474.161 |
| 2012-10-10 | 15387.589 |
| 2012-10-11 | 15405.185 |
| 2012-10-12 | 15350.935 |
| 2012-10-15 | 15469.684 |
| 2012-10-16 | 15621.846 |
| 2012-10-17 | 15694.485 |
| 2012-10-18 | 15650.011 |
| 2012-10-19 | 15394.082 |
| 2012-10-22 | 15340.84 |
| 2012-10-23 | 15197.898 |
| 2012-10-24 | 15162.15 |
| 2012-10-25 | 15203.331 |
| 2012-10-26 | 15182.566 |
| 2012-10-31 | 15201.891 |
| 2012-11-01 | 15450.504 |
| 2012-11-05 | 15332.533 |
| 2012-11-06 | 15450.876 |
| 2012-11-07 | 15094.648 |
| 2012-11-12 | 14921.962 |
| 2012-11-13 | 14858.211 |
| 2012-11-14 | 14642.534 |
| 2012-11-15 | 14605.54 |
| 2012-11-16 | 14696.019 |
| 2012-11-19 | 14984.587 |
| 2012-11-20 | 14999.879 |
| 2012-11-26 | 15211.047 |
| 2012-11-27 | 15146.355 |
| 2012-11-28 | 15263.509 |
| 2012-11-29 | 15343.421 |
| 2012-11-30 | 15351.764 |
| 2012-12-03 | 15324.371 |
| 2012-12-04 | 15299.428 |
| 2012-12-05 | 15315.611 |
| 2012-12-06 | 15360.21 |
| 2012-12-07 | 15402.944 |
| 2012-12-11 | 15519.398 |
| 2012-12-12 | 15509.726 |
| 2012-12-13 | 15418.028 |
| 2012-12-17 | 15535.239 |
| 2012-12-18 | 15721.267 |
| 2012-12-19 | 15632.95 |
| 2013-01-02 | 15898.1 |
| 2013-01-03 | 15879.68 |
| 2013-01-04 | 15970.218 |
| 2013-01-10 | 16042.564 |
| 2013-01-11 | 16045.365 |
| 2013-01-14 | 16035.535 |
| 2013-01-17 | 16152.462 |
| 2013-01-18 | 16202.161 |
| 2013-01-22 | 16284.698 |
| 2013-01-23 | 16301.02 |
| 2013-01-24 | 16316.649 |
| 2013-01-25 | 16413.182 |
| 2013-01-28 | 16391.827 |
| 2013-01-29 | 16444.585 |
| 2013-01-30 | 16371.009 |
| 2013-01-31 | 16356.951 |
| 2013-02-01 | 16382.827 |
| 2013-02-05 | 16356.673 |
| 2013-02-06 | 16377.885 |
| 2013-02-07 | 16343.785 |
| 2013-02-11 | 16429.107 |
| 2013-02-12 | 16459.24 |
| 2013-02-13 | 16475.982 |
| 2013-02-14 | 16495.749 |
| 2013-02-15 | 16475.316 |
| 2013-02-16 | 16591.765 |
| 2013-02-20 | 16369.488 |
| 2013-02-21 | 16254.936 |
| 2013-02-22 | 16401.456 |
| 2013-02-25 | 16106.58 |
| 2013-02-26 | 16200.843 |
| 2013-02-27 | 16405.034 |
| 2013-02-28 | 16397.745 |
| 2013-03-01 | 16390.325 |
| 2013-03-04 | 16467.224 |
| 2013-03-05 | 16625.715 |
| 2013-03-06 | 16643.733 |
| 2013-03-07 | 16685.056 |
| 2013-03-08 | 16768.386 |
| 2013-03-11 | 16815.037 |
| 2013-03-12 | 16775.422 |
| 2013-03-13 | 16803.839 |
| 2013-03-14 | 16901.159 |
| 2013-03-15 | 16871.361 |
| 2013-03-18 | 16781.087 |
| 2013-03-19 | 16735.377 |
| 2013-03-20 | 16861.288 |
| 2013-03-21 | 16727.033 |
| 2013-03-22 | 16833.362 |
| 2013-03-25 | 16785.382 |
| 2013-03-26 | 16906.497 |
| 2013-03-27 | 16904.411 |
| 2013-03-28 | 16973.19 |
| 2013-04-02 | 16951.813 |
| 2013-04-03 | 16753.162 |
| 2013-04-04 | 16825.76 |
| 2013-04-05 | 16763.737 |
| 2013-04-08 | 16881.948 |
| 2013-04-09 | 16931.81 |
| 2013-04-10 | 17141.096 |
| 2013-04-11 | 17201.103 |
| 2013-04-12 | 17152.571 |
| 2013-04-16 | 16977.455 |
| 2013-04-17 | 16731.748 |
| 2013-04-18 | 16618.245 |
| 2013-04-22 | 16853.716 |
| 2013-04-23 | 17037.769 |
| 2013-04-24 | 17050.267 |
| 2013-04-25 | 17129.017 |
| 2013-04-26 | 17090.692 |
| 2013-04-29 | 17206.958 |
| 2013-04-30 | 17263.32 |
| 2013-05-01 | 17045.327 |
| 2013-05-03 | 17401.753 |
| 2013-05-06 | 17445.078 |
| 2013-05-07 | 17535.919 |
| 2013-05-08 | 17608.623 |
| 2013-05-09 | 17545.249 |
| 2013-05-10 | 17636.488 |
| 2013-05-13 | 17631.941 |
| 2013-05-14 | 17811.303 |
| 2013-05-15 | 17897.148 |
| 2013-05-16 | 17803.66 |
| 2013-05-17 | 17984.218 |
| 2013-05-20 | 17976.953 |
| 2013-05-21 | 18009.212 |
| 2013-05-22 | 17833.15 |
| 2013-05-23 | 17785.87 |
| 2013-05-24 | 17772.586 |
| 2013-05-28 | 17897.281 |
| 2013-05-29 | 17754.5 |
| 2013-06-03 | 17628.09 |
| 2013-06-04 | 17525.571 |
| 2013-06-05 | 17282.589 |
| 2013-06-06 | 17442.97 |
| 2013-06-07 | 17661.271 |
| 2013-06-10 | 17666.909 |
| 2013-06-11 | 17480.493 |
| 2013-06-12 | 17333.263 |
| 2013-06-13 | 17588.956 |
| 2013-06-14 | 17494.204 |
| 2013-06-17 | 17620.017 |
| 2013-06-18 | 17758.98 |
| 2013-06-19 | 17524.725 |
| 2013-06-20 | 17082.963 |
| 2013-06-21 | 17114.319 |
| 2013-06-24 | 16909.371 |
| 2013-06-25 | 17079.956 |
| 2013-06-26 | 17238.246 |
| 2013-06-27 | 17378.351 |
| 2013-06-28 | 17321.571 |
| 2013-07-01 | 17433.237 |
| 2013-07-08 | 17695.34 |
| 2013-07-09 | 17829.653 |
| 2013-07-10 | 17838.752 |
| 2013-07-11 | 18080.394 |
| 2013-07-12 | 18134.931 |
| 2013-07-15 | 18173.52 |
| 2013-07-16 | 18096.026 |
| 2013-07-17 | 18151.815 |
| 2013-07-18 | 18248.242 |
| 2013-07-19 | 18265.952 |
| 2013-07-22 | 18309.605 |
| 2013-07-23 | 18280.605 |
| 2013-07-24 | 18201.552 |
| 2013-07-25 | 18279.158 |
| 2013-07-26 | 18283.407 |
| 2013-07-29 | 18210.774 |
| 2013-07-30 | 18228.514 |
| 2013-07-31 | 18230.277 |
| 2013-08-01 | 18450.865 |
| 2013-08-02 | 18477.134 |
| 2013-08-06 | 18344.062 |
| 2013-08-07 | 18258.763 |
| 2013-08-08 | 18335.319 |
| 2013-08-15 | 17941.863 |
| 2013-08-16 | 17883.769 |
| 2013-08-19 | 17766.858 |
| 2013-08-20 | 17869.052 |
| 2013-08-21 | 17770.309 |
| 2013-08-22 | 17932.947 |
| 2013-08-23 | 18002.592 |
| 2013-08-26 | 17946.768 |
| 2013-08-27 | 17644.157 |
| 2013-08-28 | 17691.595 |
| 2013-08-29 | 17748.325 |
| 2013-08-30 | 17660.329 |
| 2013-09-04 | 17851.405 |
| 2013-09-05 | 17880.835 |
| 2013-09-06 | 17890.665 |
| 2013-09-09 | 18089.64 |
| 2013-09-10 | 18229.003 |
| 2013-09-11 | 18279.11 |
| 2013-09-12 | 18213.256 |
| 2013-09-13 | 18262.835 |
| 2013-09-16 | 18350.484 |
| 2013-09-17 | 18443.928 |
| 2013-09-18 | 18662.574 |
| 2013-09-19 | 18641.958 |
| 2013-09-20 | 18518.545 |
| 2013-09-23 | 18433.041 |
| 2013-09-24 | 18404.943 |
| 2013-09-26 | 18443.451 |
| 2013-09-27 | 18372.371 |
| 2013-09-30 | 18280.564 |
| 2013-10-01 | 18495.076 |
| 2013-10-02 | 18475.721 |
| 2013-10-03 | 18306.289 |
| 2013-10-07 | 18268.558 |
| 2013-10-08 | 18018.669 |
| 2013-10-09 | 18007.448 |
| 2013-10-10 | 18403.969 |
| 2013-10-11 | 18537.25 |
| 2013-10-15 | 18480.99 |
| 2013-10-16 | 18731.929 |
| 2013-10-17 | 18869.042 |
| 2013-10-18 | 19009.142 |
| 2013-10-21 | 19007.256 |
| 2013-10-22 | 19107.23 |
| 2013-10-23 | 19013.005 |
| 2013-10-24 | 19092.085 |
| 2013-10-25 | 19155.387 |
| 2013-10-28 | 19164.01 |
| 2013-10-29 | 19258.439 |
| 2013-10-30 | 19142.352 |
| 2013-10-31 | 19071.262 |
| 2013-11-01 | 19150.573 |
| 2013-11-11 | 19218.111 |
| 2013-11-12 | 19181.018 |
| 2013-11-13 | 19346.906 |
| 2013-11-14 | 19429.508 |
| 2013-11-15 | 19513.346 |
| 2013-11-19 | 19344.118 |
| 2013-11-20 | 19279.991 |
| 2013-11-21 | 19464.926 |
| 2013-11-22 | 19559.048 |
| 2013-11-25 | 19533.21 |
| 2013-11-26 | 19562.654 |
| 2013-12-02 | 19546.499 |
| 2013-12-03 | 19479.803 |
| 2013-12-05 | 19395.397 |
| 2013-12-06 | 19589.857 |
| 2013-12-09 | 19622.776 |
| 2013-12-10 | 19556.386 |
| 2013-12-11 | 19323.083 |
| 2013-12-12 | 19275.303 |
| 2013-12-13 | 19297.099 |
| 2013-12-16 | 19421.329 |
| 2013-12-18 | 19673.201 |
| 2014-01-06 | 19824.062 |
| 2014-01-07 | 19954.741 |
| 2014-01-09 | 19958.659 |
| 2014-01-10 | 20020.111 |
| 2014-01-14 | 19989.359 |
| 2014-01-15 | 20091.108 |
| 2014-01-16 | 20078.215 |
| 2014-01-17 | 20004.542 |
| 2014-01-23 | 19934.939 |
| 2014-01-24 | 19505.84 |
| 2014-01-27 | 19376.27 |
| 2014-01-28 | 19523.211 |
| 2014-01-29 | 19315.561 |
| 2014-01-30 | 19556.303 |
| 2014-01-31 | 19441.335 |
| 2014-02-03 | 18901.171 |
| 2014-02-04 | 19045.238 |
| 2014-02-06 | 19219.497 |
| 2014-02-07 | 19469.744 |
| 2014-02-10 | 19501.68 |
| 2014-02-11 | 19710.217 |
| 2014-02-12 | 19720.974 |
| 2014-02-14 | 19937.997 |
| 2014-02-18 | 19992.775 |
| 2014-02-20 | 19982.961 |
| 2014-02-21 | 19961.812 |
| 2014-02-24 | 20087.965 |
| 2014-02-25 | 20069.817 |
| 2014-02-26 | 20093.328 |
| 2014-02-27 | 20192.928 |
| 2014-03-03 | 19956.443 |
| 2014-03-04 | 20281.104 |
| 2014-03-05 | 20279.462 |
| 2014-03-06 | 20304.948 |
| 2014-03-07 | 20303.135 |
| 2014-03-10 | 20281.154 |
| 2014-03-11 | 20163.133 |
| 2014-03-12 | 20182.172 |
| 2014-03-13 | 19942.633 |
| 2014-03-14 | 19916.2 |
| 2014-03-17 | 20088.558 |
| 2014-03-18 | 20249.231 |
| 2014-03-20 | 20218.084 |
| 2014-03-21 | 20154.228 |
| 2014-03-25 | 20084.871 |
| 2014-03-26 | 19904.313 |
| 2014-03-27 | 19871.12 |
| 2014-03-28 | 19954.983 |
| 2014-03-31 | 20143.086 |
| 2014-04-01 | 20251.832 |
| 2014-04-03 | 20243.71 |
| 2014-04-07 | 19716.706 |
| 2014-04-08 | 19813.165 |
| 2014-04-10 | 19603.43 |
| 2014-04-11 | 19399.308 |
| 2014-04-14 | 19533.117 |
| 2014-04-15 | 19651.303 |
| 2014-04-17 | 19912.385 |
| 2014-04-23 | 20035.872 |
| 2014-04-24 | 20050.903 |
| 2014-04-25 | 19843.196 |
| 2014-04-28 | 19864.733 |
| 2014-04-29 | 19972.607 |
| 2014-04-30 | 20040.581 |
| 2014-05-01 | 19987.54 |
| 2014-05-06 | 19807.871 |
| 2014-05-08 | 19834.726 |
| 2014-05-09 | 19878.15 |
| 2014-05-12 | 20108.867 |
| 2014-05-15 | 19800.277 |
| 2014-05-16 | 19874.898 |
| 2014-05-20 | 19816.646 |
| 2014-05-21 | 19968.34 |
| 2014-05-22 | 20035.797 |
| 2014-05-23 | 20134.581 |
| 2014-05-27 | 20269.976 |
| 2014-05-28 | 20241.05 |
| 2014-05-29 | 20344.186 |
| 2014-05-30 | 20359.555 |
| 2014-06-03 | 20320.914 |
| 2014-06-04 | 20372.986 |
| 2014-06-05 | 20530.609 |
| 2014-06-06 | 20634.813 |
| 2014-06-10 | 20659.061 |
| 2014-06-11 | 20585.248 |
| 2014-06-12 | 20443.064 |
| 2014-06-13 | 20506.102 |
| 2014-06-16 | 20528.902 |
| 2014-06-17 | 20594.476 |
| 2014-06-18 | 20740.654 |
| 2014-06-19 | 20769.267 |
| 2014-06-20 | 20807.487 |
| 2014-06-23 | 20810.243 |
| 2014-06-24 | 20667.85 |
| 2014-06-30 | 20835.43 |
| 2014-07-02 | 20977.809 |
| 2014-07-03 | 21088.138 |
| 2014-07-07 | 20960.076 |
| 2014-07-08 | 20789.563 |
| 2014-07-09 | 20884.485 |
| 2014-07-11 | 20809.714 |
| 2014-07-17 | 20668.674 |
| 2014-07-18 | 20893.337 |
| 2014-07-21 | 20842.394 |
| 2014-07-23 | 20991.287 |
| 2014-07-24 | 21001.737 |
| 2014-07-28 | 20875.843 |
| 2014-07-29 | 20797.226 |
| 2014-07-30 | 20811.393 |
| 2014-07-31 | 20392.048 |
| 2014-08-01 | 20361.322 |
| 2014-08-04 | 20516.629 |
| 2014-08-05 | 20335.763 |
| 2014-08-07 | 20231.594 |
| 2014-08-08 | 20451.54 |
| 2014-08-11 | 20542.578 |
| 2014-08-12 | 20491.58 |
| 2014-08-13 | 20633.026 |
| 2014-08-15 | 20720.462 |
| 2014-08-16 | 20908.343 |
| 2014-08-17 | 21005.026 |
| 2014-08-21 | 21100.378 |
| 2014-08-22 | 21070.705 |
| 2014-08-25 | 21169.089 |
| 2014-08-26 | 21209.49 |
| 2014-08-27 | 21208.429 |
| 2014-08-29 | 21249.87 |
| 2014-09-02 | 21244.43 |
| 2014-09-03 | 21213.18 |
| 2014-09-04 | 21169.98 |
| 2014-09-05 | 21270.32 |
| 2014-09-08 | 21221.96 |
| 2014-09-11 | 21182.54 |
| 2014-09-12 | 21041.43 |
| 2014-09-15 | 20978.92 |
| 2014-09-18 | 21254.01 |
| 2014-09-23 | 20877 |
| 2014-09-26 | 20885.67 |
| 2014-09-29 | 20842.01 |
| 2014-10-01 | 20476.54 |
| 2014-10-07 | 20350.96 |
| 2014-10-09 | 20234.9 |
| 2014-10-10 | 19975.65 |
| 2014-10-14 | 19707.63 |
| 2014-10-16 | 19682.83 |
| 2014-10-17 | 19900.42 |
| 2014-10-20 | 20089.39 |
| 2014-10-21 | 20483.44 |
| 2014-10-23 | 20563.99 |
| 2014-10-24 | 20690.13 |
| 2014-10-27 | 20654.16 |
| 2014-10-30 | 21005.5 |
| 2014-10-31 | 21256.74 |
| 2014-11-03 | 21260.26 |
| 2014-11-04 | 21176.35 |
| 2014-11-07 | 21381.83 |
| 2014-11-10 | 21447.21 |
| 2014-11-11 | 21462.67 |